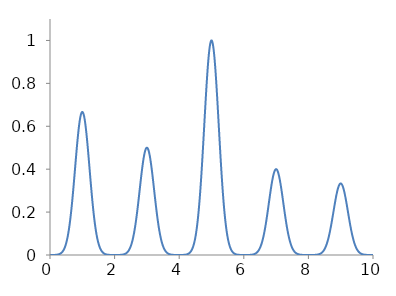
| Category | Series 0 |
|---|---|
| 0.0 | 0 |
| 0.001 | 0 |
| 0.002 | 0 |
| 0.003 | 0 |
| 0.004 | 0 |
| 0.005 | 0 |
| 0.006 | 0 |
| 0.007 | 0 |
| 0.008 | 0 |
| 0.009 | 0 |
| 0.01 | 0 |
| 0.011 | 0 |
| 0.012 | 0 |
| 0.013 | 0 |
| 0.014 | 0 |
| 0.015 | 0 |
| 0.016 | 0 |
| 0.017 | 0 |
| 0.018 | 0 |
| 0.019 | 0 |
| 0.02 | 0 |
| 0.021 | 0 |
| 0.022 | 0 |
| 0.023 | 0 |
| 0.024 | 0 |
| 0.025 | 0 |
| 0.026 | 0 |
| 0.027 | 0 |
| 0.028 | 0 |
| 0.029 | 0 |
| 0.03 | 0 |
| 0.031 | 0 |
| 0.032 | 0 |
| 0.033 | 0 |
| 0.034 | 0 |
| 0.035 | 0 |
| 0.036 | 0 |
| 0.037 | 0 |
| 0.038 | 0 |
| 0.039 | 0 |
| 0.04 | 0 |
| 0.041 | 0 |
| 0.042 | 0 |
| 0.043 | 0 |
| 0.044 | 0 |
| 0.045 | 0 |
| 0.046 | 0 |
| 0.047 | 0 |
| 0.048 | 0 |
| 0.049 | 0 |
| 0.05 | 0 |
| 0.051 | 0 |
| 0.052 | 0 |
| 0.053 | 0 |
| 0.054 | 0 |
| 0.055 | 0 |
| 0.056 | 0 |
| 0.057 | 0 |
| 0.058 | 0 |
| 0.059 | 0 |
| 0.06 | 0 |
| 0.061 | 0 |
| 0.062 | 0 |
| 0.063 | 0 |
| 0.064 | 0 |
| 0.065 | 0 |
| 0.066 | 0 |
| 0.067 | 0 |
| 0.068 | 0 |
| 0.069 | 0 |
| 0.07 | 0 |
| 0.071 | 0 |
| 0.072 | 0 |
| 0.073 | 0 |
| 0.074 | 0 |
| 0.075 | 0 |
| 0.076 | 0 |
| 0.077 | 0 |
| 0.078 | 0 |
| 0.079 | 0 |
| 0.08 | 0 |
| 0.081 | 0 |
| 0.082 | 0 |
| 0.083 | 0 |
| 0.084 | 0 |
| 0.085 | 0 |
| 0.086 | 0 |
| 0.087 | 0 |
| 0.088 | 0 |
| 0.089 | 0 |
| 0.09 | 0 |
| 0.091 | 0 |
| 0.092 | 0 |
| 0.093 | 0 |
| 0.094 | 0 |
| 0.095 | 0 |
| 0.096 | 0 |
| 0.097 | 0 |
| 0.098 | 0 |
| 0.099 | 0 |
| 0.1 | 0 |
| 0.101 | 0 |
| 0.102 | 0 |
| 0.103 | 0 |
| 0.104 | 0 |
| 0.105 | 0 |
| 0.106 | 0 |
| 0.107 | 0 |
| 0.108 | 0 |
| 0.109 | 0 |
| 0.11 | 0 |
| 0.111 | 0 |
| 0.112 | 0 |
| 0.113 | 0 |
| 0.114 | 0 |
| 0.115 | 0 |
| 0.116 | 0 |
| 0.117 | 0 |
| 0.118 | 0 |
| 0.119 | 0 |
| 0.12 | 0 |
| 0.121 | 0 |
| 0.122 | 0 |
| 0.123 | 0 |
| 0.124 | 0 |
| 0.125 | 0 |
| 0.126 | 0 |
| 0.127 | 0 |
| 0.128 | 0 |
| 0.129 | 0 |
| 0.13 | 0 |
| 0.131 | 0 |
| 0.132 | 0 |
| 0.133 | 0 |
| 0.134 | 0 |
| 0.135 | 0 |
| 0.136 | 0 |
| 0.137 | 0 |
| 0.138 | 0 |
| 0.139 | 0 |
| 0.14 | 0 |
| 0.141 | 0 |
| 0.142 | 0 |
| 0.143 | 0 |
| 0.144 | 0 |
| 0.145 | 0 |
| 0.146 | 0 |
| 0.147 | 0 |
| 0.148 | 0 |
| 0.149 | 0 |
| 0.15 | 0 |
| 0.151 | 0 |
| 0.152 | 0.001 |
| 0.153 | 0.001 |
| 0.154 | 0.001 |
| 0.155 | 0.001 |
| 0.156 | 0.001 |
| 0.157 | 0.001 |
| 0.158 | 0.001 |
| 0.159 | 0.001 |
| 0.16 | 0.001 |
| 0.161 | 0.001 |
| 0.162 | 0.001 |
| 0.163 | 0.001 |
| 0.164 | 0.001 |
| 0.165 | 0.001 |
| 0.166 | 0.001 |
| 0.167 | 0.001 |
| 0.168 | 0.001 |
| 0.169 | 0.001 |
| 0.17 | 0.001 |
| 0.171 | 0.001 |
| 0.172 | 0.001 |
| 0.173 | 0.001 |
| 0.174 | 0.001 |
| 0.175 | 0.001 |
| 0.176 | 0.001 |
| 0.177 | 0.001 |
| 0.178 | 0.001 |
| 0.179 | 0.001 |
| 0.18 | 0.001 |
| 0.181 | 0.001 |
| 0.182 | 0.001 |
| 0.183 | 0.001 |
| 0.184 | 0.001 |
| 0.185 | 0.001 |
| 0.186 | 0.001 |
| 0.187 | 0.001 |
| 0.188 | 0.001 |
| 0.189 | 0.001 |
| 0.19 | 0.001 |
| 0.191 | 0.001 |
| 0.192 | 0.001 |
| 0.193 | 0.001 |
| 0.194 | 0.001 |
| 0.195 | 0.001 |
| 0.196 | 0.001 |
| 0.197 | 0.001 |
| 0.198 | 0.001 |
| 0.199 | 0.001 |
| 0.2 | 0.001 |
| 0.201 | 0.001 |
| 0.202 | 0.001 |
| 0.203 | 0.001 |
| 0.204 | 0.001 |
| 0.205 | 0.001 |
| 0.206 | 0.001 |
| 0.207 | 0.001 |
| 0.208 | 0.001 |
| 0.209 | 0.001 |
| 0.21 | 0.001 |
| 0.211 | 0.001 |
| 0.212 | 0.001 |
| 0.213 | 0.001 |
| 0.214 | 0.001 |
| 0.215 | 0.001 |
| 0.216 | 0.001 |
| 0.217 | 0.001 |
| 0.218 | 0.001 |
| 0.219 | 0.001 |
| 0.22 | 0.002 |
| 0.221 | 0.002 |
| 0.222 | 0.002 |
| 0.223 | 0.002 |
| 0.224 | 0.002 |
| 0.225 | 0.002 |
| 0.226 | 0.002 |
| 0.227 | 0.002 |
| 0.228 | 0.002 |
| 0.229 | 0.002 |
| 0.23 | 0.002 |
| 0.231 | 0.002 |
| 0.232 | 0.002 |
| 0.233 | 0.002 |
| 0.234 | 0.002 |
| 0.235 | 0.002 |
| 0.236 | 0.002 |
| 0.237 | 0.002 |
| 0.238 | 0.002 |
| 0.239 | 0.002 |
| 0.24 | 0.002 |
| 0.241 | 0.002 |
| 0.242 | 0.002 |
| 0.243 | 0.002 |
| 0.244 | 0.002 |
| 0.245 | 0.002 |
| 0.246 | 0.002 |
| 0.247 | 0.002 |
| 0.248 | 0.002 |
| 0.249 | 0.002 |
| 0.25 | 0.002 |
| 0.251 | 0.002 |
| 0.252 | 0.002 |
| 0.253 | 0.003 |
| 0.254 | 0.003 |
| 0.255 | 0.003 |
| 0.256 | 0.003 |
| 0.257 | 0.003 |
| 0.258 | 0.003 |
| 0.259 | 0.003 |
| 0.26 | 0.003 |
| 0.261 | 0.003 |
| 0.262 | 0.003 |
| 0.263 | 0.003 |
| 0.264 | 0.003 |
| 0.265 | 0.003 |
| 0.266 | 0.003 |
| 0.267 | 0.003 |
| 0.268 | 0.003 |
| 0.269 | 0.003 |
| 0.27 | 0.003 |
| 0.271 | 0.003 |
| 0.272 | 0.003 |
| 0.273 | 0.003 |
| 0.274 | 0.003 |
| 0.275 | 0.003 |
| 0.276 | 0.004 |
| 0.277 | 0.004 |
| 0.278 | 0.004 |
| 0.279 | 0.004 |
| 0.28 | 0.004 |
| 0.281 | 0.004 |
| 0.282 | 0.004 |
| 0.283 | 0.004 |
| 0.284 | 0.004 |
| 0.285 | 0.004 |
| 0.286 | 0.004 |
| 0.287 | 0.004 |
| 0.288 | 0.004 |
| 0.289 | 0.004 |
| 0.29 | 0.004 |
| 0.291 | 0.004 |
| 0.292 | 0.004 |
| 0.293 | 0.004 |
| 0.294 | 0.005 |
| 0.295 | 0.005 |
| 0.296 | 0.005 |
| 0.297 | 0.005 |
| 0.298 | 0.005 |
| 0.299 | 0.005 |
| 0.3 | 0.005 |
| 0.301 | 0.005 |
| 0.302 | 0.005 |
| 0.303 | 0.005 |
| 0.304 | 0.005 |
| 0.305 | 0.005 |
| 0.306 | 0.005 |
| 0.307 | 0.005 |
| 0.308 | 0.006 |
| 0.309 | 0.006 |
| 0.31 | 0.006 |
| 0.311 | 0.006 |
| 0.312 | 0.006 |
| 0.313 | 0.006 |
| 0.314 | 0.006 |
| 0.315 | 0.006 |
| 0.316 | 0.006 |
| 0.317 | 0.006 |
| 0.318 | 0.006 |
| 0.319 | 0.006 |
| 0.32 | 0.007 |
| 0.321 | 0.007 |
| 0.322 | 0.007 |
| 0.323 | 0.007 |
| 0.324 | 0.007 |
| 0.325 | 0.007 |
| 0.326 | 0.007 |
| 0.327 | 0.007 |
| 0.328 | 0.007 |
| 0.329 | 0.007 |
| 0.33 | 0.007 |
| 0.331 | 0.008 |
| 0.332 | 0.008 |
| 0.333 | 0.008 |
| 0.334 | 0.008 |
| 0.335 | 0.008 |
| 0.336 | 0.008 |
| 0.337 | 0.008 |
| 0.338 | 0.008 |
| 0.339 | 0.008 |
| 0.34 | 0.009 |
| 0.341 | 0.009 |
| 0.342 | 0.009 |
| 0.343 | 0.009 |
| 0.344 | 0.009 |
| 0.345 | 0.009 |
| 0.346 | 0.009 |
| 0.347 | 0.009 |
| 0.348 | 0.009 |
| 0.349 | 0.01 |
| 0.35 | 0.01 |
| 0.351 | 0.01 |
| 0.352 | 0.01 |
| 0.353 | 0.01 |
| 0.354 | 0.01 |
| 0.355 | 0.01 |
| 0.356 | 0.011 |
| 0.357 | 0.011 |
| 0.358 | 0.011 |
| 0.359 | 0.011 |
| 0.36 | 0.011 |
| 0.361 | 0.011 |
| 0.362 | 0.011 |
| 0.363 | 0.012 |
| 0.364 | 0.012 |
| 0.365 | 0.012 |
| 0.366 | 0.012 |
| 0.367 | 0.012 |
| 0.368 | 0.012 |
| 0.369 | 0.012 |
| 0.37 | 0.013 |
| 0.371 | 0.013 |
| 0.372 | 0.013 |
| 0.373 | 0.013 |
| 0.374 | 0.013 |
| 0.375 | 0.013 |
| 0.376 | 0.014 |
| 0.377 | 0.014 |
| 0.378 | 0.014 |
| 0.379 | 0.014 |
| 0.38 | 0.014 |
| 0.381 | 0.014 |
| 0.382 | 0.015 |
| 0.383 | 0.015 |
| 0.384 | 0.015 |
| 0.385 | 0.015 |
| 0.386 | 0.015 |
| 0.387 | 0.016 |
| 0.388 | 0.016 |
| 0.389 | 0.016 |
| 0.39 | 0.016 |
| 0.391 | 0.016 |
| 0.392 | 0.017 |
| 0.393 | 0.017 |
| 0.394 | 0.017 |
| 0.395 | 0.017 |
| 0.396 | 0.017 |
| 0.397 | 0.018 |
| 0.398 | 0.018 |
| 0.399 | 0.018 |
| 0.4 | 0.018 |
| 0.401 | 0.018 |
| 0.402 | 0.019 |
| 0.403 | 0.019 |
| 0.404 | 0.019 |
| 0.405 | 0.019 |
| 0.406 | 0.02 |
| 0.407 | 0.02 |
| 0.408 | 0.02 |
| 0.409 | 0.02 |
| 0.41 | 0.021 |
| 0.411 | 0.021 |
| 0.412 | 0.021 |
| 0.413 | 0.021 |
| 0.414 | 0.022 |
| 0.415 | 0.022 |
| 0.416 | 0.022 |
| 0.417 | 0.022 |
| 0.418 | 0.023 |
| 0.419 | 0.023 |
| 0.42 | 0.023 |
| 0.421 | 0.023 |
| 0.422 | 0.024 |
| 0.423 | 0.024 |
| 0.424 | 0.024 |
| 0.425 | 0.024 |
| 0.426 | 0.025 |
| 0.427 | 0.025 |
| 0.428 | 0.025 |
| 0.429 | 0.026 |
| 0.43 | 0.026 |
| 0.431 | 0.026 |
| 0.432 | 0.026 |
| 0.433 | 0.027 |
| 0.434 | 0.027 |
| 0.435 | 0.027 |
| 0.436 | 0.028 |
| 0.437 | 0.028 |
| 0.438 | 0.028 |
| 0.439 | 0.029 |
| 0.44 | 0.029 |
| 0.441 | 0.029 |
| 0.442 | 0.03 |
| 0.443 | 0.03 |
| 0.444 | 0.03 |
| 0.445 | 0.031 |
| 0.446 | 0.031 |
| 0.447 | 0.031 |
| 0.448 | 0.032 |
| 0.449 | 0.032 |
| 0.45 | 0.032 |
| 0.451 | 0.033 |
| 0.452 | 0.033 |
| 0.453 | 0.033 |
| 0.454 | 0.034 |
| 0.455 | 0.034 |
| 0.456 | 0.035 |
| 0.457 | 0.035 |
| 0.458 | 0.035 |
| 0.459 | 0.036 |
| 0.46 | 0.036 |
| 0.461 | 0.036 |
| 0.462 | 0.037 |
| 0.463 | 0.037 |
| 0.464 | 0.038 |
| 0.465 | 0.038 |
| 0.466 | 0.039 |
| 0.467 | 0.039 |
| 0.468 | 0.039 |
| 0.469 | 0.04 |
| 0.47 | 0.04 |
| 0.471 | 0.041 |
| 0.472 | 0.041 |
| 0.473 | 0.041 |
| 0.474 | 0.042 |
| 0.475 | 0.042 |
| 0.476 | 0.043 |
| 0.477 | 0.043 |
| 0.478 | 0.044 |
| 0.479 | 0.044 |
| 0.48 | 0.045 |
| 0.481 | 0.045 |
| 0.482 | 0.046 |
| 0.483 | 0.046 |
| 0.484 | 0.047 |
| 0.485 | 0.047 |
| 0.486 | 0.047 |
| 0.487 | 0.048 |
| 0.488 | 0.048 |
| 0.489 | 0.049 |
| 0.49 | 0.049 |
| 0.491 | 0.05 |
| 0.492 | 0.05 |
| 0.493 | 0.051 |
| 0.494 | 0.052 |
| 0.495 | 0.052 |
| 0.496 | 0.053 |
| 0.497 | 0.053 |
| 0.498 | 0.054 |
| 0.499 | 0.054 |
| 0.5 | 0.055 |
| 0.501 | 0.055 |
| 0.502 | 0.056 |
| 0.503 | 0.056 |
| 0.504 | 0.057 |
| 0.505 | 0.058 |
| 0.506 | 0.058 |
| 0.507 | 0.059 |
| 0.508 | 0.059 |
| 0.509 | 0.06 |
| 0.51 | 0.06 |
| 0.511 | 0.061 |
| 0.512 | 0.062 |
| 0.513 | 0.062 |
| 0.514 | 0.063 |
| 0.515 | 0.063 |
| 0.516 | 0.064 |
| 0.517 | 0.065 |
| 0.518 | 0.065 |
| 0.519 | 0.066 |
| 0.52 | 0.067 |
| 0.521 | 0.067 |
| 0.522 | 0.068 |
| 0.523 | 0.069 |
| 0.524 | 0.069 |
| 0.525 | 0.07 |
| 0.526 | 0.07 |
| 0.527 | 0.071 |
| 0.528 | 0.072 |
| 0.529 | 0.073 |
| 0.53 | 0.073 |
| 0.531 | 0.074 |
| 0.532 | 0.075 |
| 0.533 | 0.075 |
| 0.534 | 0.076 |
| 0.535 | 0.077 |
| 0.536 | 0.077 |
| 0.537 | 0.078 |
| 0.538 | 0.079 |
| 0.539 | 0.08 |
| 0.54 | 0.08 |
| 0.541 | 0.081 |
| 0.542 | 0.082 |
| 0.543 | 0.083 |
| 0.544 | 0.083 |
| 0.545 | 0.084 |
| 0.546 | 0.085 |
| 0.547 | 0.086 |
| 0.548 | 0.086 |
| 0.549 | 0.087 |
| 0.55 | 0.088 |
| 0.551 | 0.089 |
| 0.552 | 0.09 |
| 0.553 | 0.09 |
| 0.554 | 0.091 |
| 0.555 | 0.092 |
| 0.556 | 0.093 |
| 0.557 | 0.094 |
| 0.558 | 0.095 |
| 0.559 | 0.095 |
| 0.56 | 0.096 |
| 0.561 | 0.097 |
| 0.562 | 0.098 |
| 0.563 | 0.099 |
| 0.564 | 0.1 |
| 0.565 | 0.1 |
| 0.566 | 0.101 |
| 0.567 | 0.102 |
| 0.568 | 0.103 |
| 0.569 | 0.104 |
| 0.57 | 0.105 |
| 0.571 | 0.106 |
| 0.572 | 0.107 |
| 0.573 | 0.108 |
| 0.574 | 0.109 |
| 0.575 | 0.11 |
| 0.576 | 0.11 |
| 0.577 | 0.111 |
| 0.578 | 0.112 |
| 0.579 | 0.113 |
| 0.58 | 0.114 |
| 0.581 | 0.115 |
| 0.582 | 0.116 |
| 0.583 | 0.117 |
| 0.584 | 0.118 |
| 0.585 | 0.119 |
| 0.586 | 0.12 |
| 0.587 | 0.121 |
| 0.588 | 0.122 |
| 0.589 | 0.123 |
| 0.59 | 0.124 |
| 0.591 | 0.125 |
| 0.592 | 0.126 |
| 0.593 | 0.127 |
| 0.594 | 0.128 |
| 0.595 | 0.129 |
| 0.596 | 0.13 |
| 0.597 | 0.131 |
| 0.598 | 0.132 |
| 0.599 | 0.134 |
| 0.6 | 0.135 |
| 0.601 | 0.136 |
| 0.602 | 0.137 |
| 0.603 | 0.138 |
| 0.604 | 0.139 |
| 0.605 | 0.14 |
| 0.606 | 0.141 |
| 0.607 | 0.142 |
| 0.608 | 0.143 |
| 0.609 | 0.145 |
| 0.61 | 0.146 |
| 0.611 | 0.147 |
| 0.612 | 0.148 |
| 0.613 | 0.149 |
| 0.614 | 0.15 |
| 0.615 | 0.151 |
| 0.616 | 0.153 |
| 0.617 | 0.154 |
| 0.618 | 0.155 |
| 0.619 | 0.156 |
| 0.62 | 0.157 |
| 0.621 | 0.159 |
| 0.622 | 0.16 |
| 0.623 | 0.161 |
| 0.624 | 0.162 |
| 0.625 | 0.163 |
| 0.626 | 0.165 |
| 0.627 | 0.166 |
| 0.628 | 0.167 |
| 0.629 | 0.168 |
| 0.63 | 0.17 |
| 0.631 | 0.171 |
| 0.632 | 0.172 |
| 0.633 | 0.173 |
| 0.634 | 0.175 |
| 0.635 | 0.176 |
| 0.636 | 0.177 |
| 0.637 | 0.179 |
| 0.638 | 0.18 |
| 0.639 | 0.181 |
| 0.64 | 0.182 |
| 0.641 | 0.184 |
| 0.642 | 0.185 |
| 0.643 | 0.186 |
| 0.644 | 0.188 |
| 0.645 | 0.189 |
| 0.646 | 0.19 |
| 0.647 | 0.192 |
| 0.648 | 0.193 |
| 0.649 | 0.194 |
| 0.65 | 0.196 |
| 0.651 | 0.197 |
| 0.652 | 0.199 |
| 0.653 | 0.2 |
| 0.654 | 0.201 |
| 0.655 | 0.203 |
| 0.656 | 0.204 |
| 0.657 | 0.206 |
| 0.658 | 0.207 |
| 0.659 | 0.208 |
| 0.66 | 0.21 |
| 0.661 | 0.211 |
| 0.662 | 0.213 |
| 0.663 | 0.214 |
| 0.664 | 0.216 |
| 0.665 | 0.217 |
| 0.666 | 0.218 |
| 0.667 | 0.22 |
| 0.668 | 0.221 |
| 0.669 | 0.223 |
| 0.67 | 0.224 |
| 0.671 | 0.226 |
| 0.672 | 0.227 |
| 0.673 | 0.229 |
| 0.674 | 0.23 |
| 0.675 | 0.232 |
| 0.676 | 0.233 |
| 0.677 | 0.235 |
| 0.678 | 0.236 |
| 0.679 | 0.238 |
| 0.68 | 0.239 |
| 0.681 | 0.241 |
| 0.682 | 0.243 |
| 0.683 | 0.244 |
| 0.684 | 0.246 |
| 0.685 | 0.247 |
| 0.686 | 0.249 |
| 0.687 | 0.25 |
| 0.688 | 0.252 |
| 0.689 | 0.253 |
| 0.69 | 0.255 |
| 0.691 | 0.257 |
| 0.692 | 0.258 |
| 0.693 | 0.26 |
| 0.694 | 0.261 |
| 0.695 | 0.263 |
| 0.696 | 0.265 |
| 0.697 | 0.266 |
| 0.698 | 0.268 |
| 0.699 | 0.269 |
| 0.7 | 0.271 |
| 0.701 | 0.273 |
| 0.702 | 0.274 |
| 0.703 | 0.276 |
| 0.704 | 0.278 |
| 0.705 | 0.279 |
| 0.706 | 0.281 |
| 0.707 | 0.283 |
| 0.708 | 0.284 |
| 0.709 | 0.286 |
| 0.71 | 0.288 |
| 0.711 | 0.289 |
| 0.712 | 0.291 |
| 0.713 | 0.293 |
| 0.714 | 0.294 |
| 0.715 | 0.296 |
| 0.716 | 0.298 |
| 0.717 | 0.299 |
| 0.718 | 0.301 |
| 0.719 | 0.303 |
| 0.72 | 0.304 |
| 0.721 | 0.306 |
| 0.722 | 0.308 |
| 0.723 | 0.31 |
| 0.724 | 0.311 |
| 0.725 | 0.313 |
| 0.726 | 0.315 |
| 0.727 | 0.316 |
| 0.728 | 0.318 |
| 0.729 | 0.32 |
| 0.73 | 0.322 |
| 0.731 | 0.323 |
| 0.732 | 0.325 |
| 0.733 | 0.327 |
| 0.734 | 0.329 |
| 0.735 | 0.33 |
| 0.736 | 0.332 |
| 0.737 | 0.334 |
| 0.738 | 0.336 |
| 0.739 | 0.337 |
| 0.74 | 0.339 |
| 0.741 | 0.341 |
| 0.742 | 0.343 |
| 0.743 | 0.344 |
| 0.744 | 0.346 |
| 0.745 | 0.348 |
| 0.746 | 0.35 |
| 0.747 | 0.351 |
| 0.748 | 0.353 |
| 0.749 | 0.355 |
| 0.75 | 0.357 |
| 0.751 | 0.359 |
| 0.752 | 0.36 |
| 0.753 | 0.362 |
| 0.754 | 0.364 |
| 0.755 | 0.366 |
| 0.756 | 0.368 |
| 0.757 | 0.369 |
| 0.758 | 0.371 |
| 0.759 | 0.373 |
| 0.76 | 0.375 |
| 0.761 | 0.377 |
| 0.762 | 0.378 |
| 0.763 | 0.38 |
| 0.764 | 0.382 |
| 0.765 | 0.384 |
| 0.766 | 0.386 |
| 0.767 | 0.387 |
| 0.768 | 0.389 |
| 0.769 | 0.391 |
| 0.77 | 0.393 |
| 0.771 | 0.395 |
| 0.772 | 0.396 |
| 0.773 | 0.398 |
| 0.774 | 0.4 |
| 0.775 | 0.402 |
| 0.776 | 0.404 |
| 0.777 | 0.405 |
| 0.778 | 0.407 |
| 0.779 | 0.409 |
| 0.78 | 0.411 |
| 0.781 | 0.413 |
| 0.782 | 0.414 |
| 0.783 | 0.416 |
| 0.784 | 0.418 |
| 0.785 | 0.42 |
| 0.786 | 0.422 |
| 0.787 | 0.424 |
| 0.788 | 0.425 |
| 0.789 | 0.427 |
| 0.79 | 0.429 |
| 0.791 | 0.431 |
| 0.792 | 0.433 |
| 0.793 | 0.434 |
| 0.794 | 0.436 |
| 0.795 | 0.438 |
| 0.796 | 0.44 |
| 0.797 | 0.442 |
| 0.798 | 0.443 |
| 0.799 | 0.445 |
| 0.8 | 0.447 |
| 0.801 | 0.449 |
| 0.802 | 0.45 |
| 0.803 | 0.452 |
| 0.804 | 0.454 |
| 0.805 | 0.456 |
| 0.806 | 0.458 |
| 0.807 | 0.459 |
| 0.808 | 0.461 |
| 0.809 | 0.463 |
| 0.81 | 0.465 |
| 0.811 | 0.466 |
| 0.812 | 0.468 |
| 0.813 | 0.47 |
| 0.814 | 0.472 |
| 0.815 | 0.473 |
| 0.816 | 0.475 |
| 0.817 | 0.477 |
| 0.818 | 0.479 |
| 0.819 | 0.48 |
| 0.82 | 0.482 |
| 0.821 | 0.484 |
| 0.822 | 0.486 |
| 0.823 | 0.487 |
| 0.824 | 0.489 |
| 0.825 | 0.491 |
| 0.826 | 0.493 |
| 0.827 | 0.494 |
| 0.828 | 0.496 |
| 0.829 | 0.498 |
| 0.83 | 0.499 |
| 0.831 | 0.501 |
| 0.832 | 0.503 |
| 0.833 | 0.504 |
| 0.834 | 0.506 |
| 0.835 | 0.508 |
| 0.836 | 0.509 |
| 0.837 | 0.511 |
| 0.838 | 0.513 |
| 0.839 | 0.514 |
| 0.84 | 0.516 |
| 0.841 | 0.518 |
| 0.842 | 0.519 |
| 0.843 | 0.521 |
| 0.844 | 0.523 |
| 0.845 | 0.524 |
| 0.846 | 0.526 |
| 0.847 | 0.528 |
| 0.848 | 0.529 |
| 0.849 | 0.531 |
| 0.85 | 0.532 |
| 0.851 | 0.534 |
| 0.852 | 0.536 |
| 0.853 | 0.537 |
| 0.854 | 0.539 |
| 0.855 | 0.54 |
| 0.856 | 0.542 |
| 0.857 | 0.543 |
| 0.858 | 0.545 |
| 0.859 | 0.546 |
| 0.86 | 0.548 |
| 0.861 | 0.55 |
| 0.862 | 0.551 |
| 0.863 | 0.553 |
| 0.864 | 0.554 |
| 0.865 | 0.556 |
| 0.866 | 0.557 |
| 0.867 | 0.559 |
| 0.868 | 0.56 |
| 0.869 | 0.562 |
| 0.87 | 0.563 |
| 0.871 | 0.564 |
| 0.872 | 0.566 |
| 0.873 | 0.567 |
| 0.874 | 0.569 |
| 0.875 | 0.57 |
| 0.876 | 0.572 |
| 0.877 | 0.573 |
| 0.878 | 0.574 |
| 0.879 | 0.576 |
| 0.88 | 0.577 |
| 0.881 | 0.579 |
| 0.882 | 0.58 |
| 0.883 | 0.581 |
| 0.884 | 0.583 |
| 0.885 | 0.584 |
| 0.886 | 0.585 |
| 0.887 | 0.587 |
| 0.888 | 0.588 |
| 0.889 | 0.589 |
| 0.89 | 0.591 |
| 0.891 | 0.592 |
| 0.892 | 0.593 |
| 0.893 | 0.595 |
| 0.894 | 0.596 |
| 0.895 | 0.597 |
| 0.896 | 0.598 |
| 0.897 | 0.6 |
| 0.898 | 0.601 |
| 0.899 | 0.602 |
| 0.9 | 0.603 |
| 0.901 | 0.604 |
| 0.902 | 0.606 |
| 0.903 | 0.607 |
| 0.904 | 0.608 |
| 0.905 | 0.609 |
| 0.906 | 0.61 |
| 0.907 | 0.611 |
| 0.908 | 0.613 |
| 0.909 | 0.614 |
| 0.91 | 0.615 |
| 0.911 | 0.616 |
| 0.912 | 0.617 |
| 0.913 | 0.618 |
| 0.914 | 0.619 |
| 0.915 | 0.62 |
| 0.916 | 0.621 |
| 0.917 | 0.622 |
| 0.918 | 0.623 |
| 0.919 | 0.624 |
| 0.92 | 0.625 |
| 0.921 | 0.626 |
| 0.922 | 0.627 |
| 0.923 | 0.628 |
| 0.924 | 0.629 |
| 0.925 | 0.63 |
| 0.926 | 0.631 |
| 0.927 | 0.632 |
| 0.928 | 0.633 |
| 0.929 | 0.634 |
| 0.93 | 0.635 |
| 0.931 | 0.636 |
| 0.932 | 0.637 |
| 0.933 | 0.637 |
| 0.934 | 0.638 |
| 0.935 | 0.639 |
| 0.936 | 0.64 |
| 0.937 | 0.641 |
| 0.938 | 0.642 |
| 0.939 | 0.642 |
| 0.94 | 0.643 |
| 0.941 | 0.644 |
| 0.942 | 0.645 |
| 0.943 | 0.645 |
| 0.944 | 0.646 |
| 0.945 | 0.647 |
| 0.946 | 0.648 |
| 0.947 | 0.648 |
| 0.948 | 0.649 |
| 0.949 | 0.65 |
| 0.95 | 0.65 |
| 0.951 | 0.651 |
| 0.952 | 0.651 |
| 0.953 | 0.652 |
| 0.954 | 0.653 |
| 0.955 | 0.653 |
| 0.956 | 0.654 |
| 0.957 | 0.654 |
| 0.958 | 0.655 |
| 0.959 | 0.656 |
| 0.96 | 0.656 |
| 0.961 | 0.657 |
| 0.962 | 0.657 |
| 0.963 | 0.658 |
| 0.964 | 0.658 |
| 0.965 | 0.659 |
| 0.966 | 0.659 |
| 0.967 | 0.659 |
| 0.968 | 0.66 |
| 0.969 | 0.66 |
| 0.97 | 0.661 |
| 0.971 | 0.661 |
| 0.972 | 0.661 |
| 0.973 | 0.662 |
| 0.974 | 0.662 |
| 0.975 | 0.663 |
| 0.976 | 0.663 |
| 0.977 | 0.663 |
| 0.978 | 0.663 |
| 0.979 | 0.664 |
| 0.98 | 0.664 |
| 0.981 | 0.664 |
| 0.982 | 0.665 |
| 0.983 | 0.665 |
| 0.984 | 0.665 |
| 0.985 | 0.665 |
| 0.986 | 0.665 |
| 0.987 | 0.666 |
| 0.988 | 0.666 |
| 0.989 | 0.666 |
| 0.99 | 0.666 |
| 0.991 | 0.666 |
| 0.992 | 0.666 |
| 0.993 | 0.666 |
| 0.994 | 0.666 |
| 0.995 | 0.667 |
| 0.996 | 0.667 |
| 0.997 | 0.667 |
| 0.998 | 0.667 |
| 0.999 | 0.667 |
| 1.0 | 0.667 |
| 1.001 | 0.667 |
| 1.002 | 0.667 |
| 1.003 | 0.667 |
| 1.004 | 0.667 |
| 1.005 | 0.667 |
| 1.006 | 0.666 |
| 1.007 | 0.666 |
| 1.008 | 0.666 |
| 1.009 | 0.666 |
| 1.01 | 0.666 |
| 1.011 | 0.666 |
| 1.012 | 0.666 |
| 1.013 | 0.666 |
| 1.014 | 0.665 |
| 1.015 | 0.665 |
| 1.016 | 0.665 |
| 1.017 | 0.665 |
| 1.018 | 0.665 |
| 1.019 | 0.664 |
| 1.02 | 0.664 |
| 1.021 | 0.664 |
| 1.022 | 0.663 |
| 1.023 | 0.663 |
| 1.024 | 0.663 |
| 1.025 | 0.663 |
| 1.026 | 0.662 |
| 1.027 | 0.662 |
| 1.028 | 0.661 |
| 1.029 | 0.661 |
| 1.03 | 0.661 |
| 1.031 | 0.66 |
| 1.032 | 0.66 |
| 1.033 | 0.659 |
| 1.034 | 0.659 |
| 1.035 | 0.659 |
| 1.036 | 0.658 |
| 1.037 | 0.658 |
| 1.038 | 0.657 |
| 1.039 | 0.657 |
| 1.04 | 0.656 |
| 1.041 | 0.656 |
| 1.042 | 0.655 |
| 1.043 | 0.654 |
| 1.044 | 0.654 |
| 1.045 | 0.653 |
| 1.046 | 0.653 |
| 1.047 | 0.652 |
| 1.048 | 0.651 |
| 1.049 | 0.651 |
| 1.05 | 0.65 |
| 1.051 | 0.65 |
| 1.052 | 0.649 |
| 1.053 | 0.648 |
| 1.054 | 0.648 |
| 1.055 | 0.647 |
| 1.056 | 0.646 |
| 1.057 | 0.645 |
| 1.058 | 0.645 |
| 1.059 | 0.644 |
| 1.06 | 0.643 |
| 1.061 | 0.642 |
| 1.062 | 0.642 |
| 1.063 | 0.641 |
| 1.064 | 0.64 |
| 1.065 | 0.639 |
| 1.066 | 0.638 |
| 1.067 | 0.637 |
| 1.068 | 0.637 |
| 1.069 | 0.636 |
| 1.07 | 0.635 |
| 1.071 | 0.634 |
| 1.072 | 0.633 |
| 1.073 | 0.632 |
| 1.074 | 0.631 |
| 1.075 | 0.63 |
| 1.076 | 0.629 |
| 1.077 | 0.628 |
| 1.078 | 0.627 |
| 1.079 | 0.626 |
| 1.08 | 0.625 |
| 1.081 | 0.624 |
| 1.082 | 0.623 |
| 1.083 | 0.622 |
| 1.084 | 0.621 |
| 1.085 | 0.62 |
| 1.086 | 0.619 |
| 1.087 | 0.618 |
| 1.088 | 0.617 |
| 1.089 | 0.616 |
| 1.09 | 0.615 |
| 1.091 | 0.614 |
| 1.092 | 0.613 |
| 1.093 | 0.611 |
| 1.094 | 0.61 |
| 1.095 | 0.609 |
| 1.096 | 0.608 |
| 1.097 | 0.607 |
| 1.098 | 0.606 |
| 1.099 | 0.604 |
| 1.1 | 0.603 |
| 1.101 | 0.602 |
| 1.102 | 0.601 |
| 1.103 | 0.6 |
| 1.104 | 0.598 |
| 1.105 | 0.597 |
| 1.106 | 0.596 |
| 1.107 | 0.595 |
| 1.108 | 0.593 |
| 1.109 | 0.592 |
| 1.11 | 0.591 |
| 1.111 | 0.589 |
| 1.112 | 0.588 |
| 1.113 | 0.587 |
| 1.114 | 0.585 |
| 1.115 | 0.584 |
| 1.116 | 0.583 |
| 1.117 | 0.581 |
| 1.118 | 0.58 |
| 1.119 | 0.579 |
| 1.12 | 0.577 |
| 1.121 | 0.576 |
| 1.122 | 0.574 |
| 1.123 | 0.573 |
| 1.124 | 0.572 |
| 1.125 | 0.57 |
| 1.126 | 0.569 |
| 1.127 | 0.567 |
| 1.128 | 0.566 |
| 1.129 | 0.564 |
| 1.13 | 0.563 |
| 1.131 | 0.562 |
| 1.132 | 0.56 |
| 1.133 | 0.559 |
| 1.134 | 0.557 |
| 1.135 | 0.556 |
| 1.136 | 0.554 |
| 1.137 | 0.553 |
| 1.138 | 0.551 |
| 1.139 | 0.55 |
| 1.14 | 0.548 |
| 1.141 | 0.546 |
| 1.142 | 0.545 |
| 1.143 | 0.543 |
| 1.144 | 0.542 |
| 1.145 | 0.54 |
| 1.146 | 0.539 |
| 1.147 | 0.537 |
| 1.148 | 0.536 |
| 1.149 | 0.534 |
| 1.15 | 0.532 |
| 1.151 | 0.531 |
| 1.152 | 0.529 |
| 1.153 | 0.528 |
| 1.154 | 0.526 |
| 1.155 | 0.524 |
| 1.156 | 0.523 |
| 1.157 | 0.521 |
| 1.158 | 0.519 |
| 1.159 | 0.518 |
| 1.16 | 0.516 |
| 1.161 | 0.514 |
| 1.162 | 0.513 |
| 1.163 | 0.511 |
| 1.164 | 0.509 |
| 1.165 | 0.508 |
| 1.166 | 0.506 |
| 1.167 | 0.504 |
| 1.168 | 0.503 |
| 1.169 | 0.501 |
| 1.17 | 0.499 |
| 1.171 | 0.498 |
| 1.172 | 0.496 |
| 1.173 | 0.494 |
| 1.174 | 0.493 |
| 1.175 | 0.491 |
| 1.176 | 0.489 |
| 1.177 | 0.487 |
| 1.178 | 0.486 |
| 1.179 | 0.484 |
| 1.18 | 0.482 |
| 1.181 | 0.48 |
| 1.182 | 0.479 |
| 1.183 | 0.477 |
| 1.184 | 0.475 |
| 1.185 | 0.473 |
| 1.186 | 0.472 |
| 1.187 | 0.47 |
| 1.188 | 0.468 |
| 1.189 | 0.466 |
| 1.19 | 0.465 |
| 1.191 | 0.463 |
| 1.192 | 0.461 |
| 1.193 | 0.459 |
| 1.194 | 0.458 |
| 1.195 | 0.456 |
| 1.196 | 0.454 |
| 1.197 | 0.452 |
| 1.198 | 0.45 |
| 1.199 | 0.449 |
| 1.2 | 0.447 |
| 1.201 | 0.445 |
| 1.202 | 0.443 |
| 1.203 | 0.442 |
| 1.204 | 0.44 |
| 1.205 | 0.438 |
| 1.206 | 0.436 |
| 1.207 | 0.434 |
| 1.208 | 0.433 |
| 1.209 | 0.431 |
| 1.21 | 0.429 |
| 1.211 | 0.427 |
| 1.212 | 0.425 |
| 1.213 | 0.424 |
| 1.214 | 0.422 |
| 1.215 | 0.42 |
| 1.216 | 0.418 |
| 1.217 | 0.416 |
| 1.218 | 0.414 |
| 1.219 | 0.413 |
| 1.22 | 0.411 |
| 1.221 | 0.409 |
| 1.222 | 0.407 |
| 1.223 | 0.405 |
| 1.224 | 0.404 |
| 1.225 | 0.402 |
| 1.226 | 0.4 |
| 1.227 | 0.398 |
| 1.228 | 0.396 |
| 1.229 | 0.395 |
| 1.23 | 0.393 |
| 1.231 | 0.391 |
| 1.232 | 0.389 |
| 1.233 | 0.387 |
| 1.234 | 0.386 |
| 1.235 | 0.384 |
| 1.236 | 0.382 |
| 1.237 | 0.38 |
| 1.238 | 0.378 |
| 1.239 | 0.377 |
| 1.24 | 0.375 |
| 1.241 | 0.373 |
| 1.242 | 0.371 |
| 1.243 | 0.369 |
| 1.244 | 0.368 |
| 1.245 | 0.366 |
| 1.246 | 0.364 |
| 1.247 | 0.362 |
| 1.248 | 0.36 |
| 1.249 | 0.359 |
| 1.25 | 0.357 |
| 1.251 | 0.355 |
| 1.252 | 0.353 |
| 1.253 | 0.351 |
| 1.254 | 0.35 |
| 1.255 | 0.348 |
| 1.256 | 0.346 |
| 1.257 | 0.344 |
| 1.258 | 0.343 |
| 1.259 | 0.341 |
| 1.26 | 0.339 |
| 1.261 | 0.337 |
| 1.262 | 0.336 |
| 1.263 | 0.334 |
| 1.264 | 0.332 |
| 1.265 | 0.33 |
| 1.266 | 0.329 |
| 1.267 | 0.327 |
| 1.268 | 0.325 |
| 1.269 | 0.323 |
| 1.27 | 0.322 |
| 1.271 | 0.32 |
| 1.272 | 0.318 |
| 1.273 | 0.316 |
| 1.274 | 0.315 |
| 1.275 | 0.313 |
| 1.276 | 0.311 |
| 1.277 | 0.31 |
| 1.278 | 0.308 |
| 1.279 | 0.306 |
| 1.28 | 0.304 |
| 1.281 | 0.303 |
| 1.282 | 0.301 |
| 1.283 | 0.299 |
| 1.284 | 0.298 |
| 1.285 | 0.296 |
| 1.286 | 0.294 |
| 1.287 | 0.293 |
| 1.288 | 0.291 |
| 1.289 | 0.289 |
| 1.29 | 0.288 |
| 1.291 | 0.286 |
| 1.292 | 0.284 |
| 1.293 | 0.283 |
| 1.294 | 0.281 |
| 1.295 | 0.279 |
| 1.296 | 0.278 |
| 1.297 | 0.276 |
| 1.298 | 0.274 |
| 1.299 | 0.273 |
| 1.3 | 0.271 |
| 1.301 | 0.269 |
| 1.302 | 0.268 |
| 1.303 | 0.266 |
| 1.304 | 0.265 |
| 1.305 | 0.263 |
| 1.306 | 0.261 |
| 1.307 | 0.26 |
| 1.308 | 0.258 |
| 1.309 | 0.257 |
| 1.31 | 0.255 |
| 1.311 | 0.253 |
| 1.312 | 0.252 |
| 1.313 | 0.25 |
| 1.314 | 0.249 |
| 1.315 | 0.247 |
| 1.316 | 0.246 |
| 1.317 | 0.244 |
| 1.318 | 0.243 |
| 1.319 | 0.241 |
| 1.32 | 0.239 |
| 1.321 | 0.238 |
| 1.322 | 0.236 |
| 1.323 | 0.235 |
| 1.324 | 0.233 |
| 1.325 | 0.232 |
| 1.326 | 0.23 |
| 1.327 | 0.229 |
| 1.328 | 0.227 |
| 1.329 | 0.226 |
| 1.33 | 0.224 |
| 1.331 | 0.223 |
| 1.332 | 0.221 |
| 1.333 | 0.22 |
| 1.334 | 0.218 |
| 1.335 | 0.217 |
| 1.336 | 0.216 |
| 1.337 | 0.214 |
| 1.338 | 0.213 |
| 1.339 | 0.211 |
| 1.34 | 0.21 |
| 1.341 | 0.208 |
| 1.342 | 0.207 |
| 1.343 | 0.206 |
| 1.344 | 0.204 |
| 1.345 | 0.203 |
| 1.346 | 0.201 |
| 1.347 | 0.2 |
| 1.348 | 0.199 |
| 1.349 | 0.197 |
| 1.35 | 0.196 |
| 1.351 | 0.194 |
| 1.352 | 0.193 |
| 1.353 | 0.192 |
| 1.354 | 0.19 |
| 1.355 | 0.189 |
| 1.356 | 0.188 |
| 1.357 | 0.186 |
| 1.358 | 0.185 |
| 1.359 | 0.184 |
| 1.36 | 0.182 |
| 1.361 | 0.181 |
| 1.362 | 0.18 |
| 1.363 | 0.179 |
| 1.364 | 0.177 |
| 1.365 | 0.176 |
| 1.366 | 0.175 |
| 1.367 | 0.173 |
| 1.368 | 0.172 |
| 1.369 | 0.171 |
| 1.37 | 0.17 |
| 1.371 | 0.168 |
| 1.372 | 0.167 |
| 1.373 | 0.166 |
| 1.374 | 0.165 |
| 1.375 | 0.163 |
| 1.376 | 0.162 |
| 1.377 | 0.161 |
| 1.378 | 0.16 |
| 1.379 | 0.159 |
| 1.38 | 0.157 |
| 1.381 | 0.156 |
| 1.382 | 0.155 |
| 1.383 | 0.154 |
| 1.384 | 0.153 |
| 1.385 | 0.151 |
| 1.386 | 0.15 |
| 1.387 | 0.149 |
| 1.388 | 0.148 |
| 1.389 | 0.147 |
| 1.39 | 0.146 |
| 1.391 | 0.145 |
| 1.392 | 0.143 |
| 1.393 | 0.142 |
| 1.394 | 0.141 |
| 1.395 | 0.14 |
| 1.396 | 0.139 |
| 1.397 | 0.138 |
| 1.398 | 0.137 |
| 1.399 | 0.136 |
| 1.4 | 0.135 |
| 1.401 | 0.134 |
| 1.402 | 0.132 |
| 1.403 | 0.131 |
| 1.404 | 0.13 |
| 1.405 | 0.129 |
| 1.406 | 0.128 |
| 1.407 | 0.127 |
| 1.408 | 0.126 |
| 1.409 | 0.125 |
| 1.41 | 0.124 |
| 1.411 | 0.123 |
| 1.412 | 0.122 |
| 1.413 | 0.121 |
| 1.414 | 0.12 |
| 1.415 | 0.119 |
| 1.416 | 0.118 |
| 1.417 | 0.117 |
| 1.418 | 0.116 |
| 1.419 | 0.115 |
| 1.42 | 0.114 |
| 1.421 | 0.113 |
| 1.422 | 0.112 |
| 1.423 | 0.111 |
| 1.424 | 0.11 |
| 1.425 | 0.11 |
| 1.426 | 0.109 |
| 1.427 | 0.108 |
| 1.428 | 0.107 |
| 1.429 | 0.106 |
| 1.43 | 0.105 |
| 1.431 | 0.104 |
| 1.432 | 0.103 |
| 1.433 | 0.102 |
| 1.434 | 0.101 |
| 1.435 | 0.1 |
| 1.436 | 0.1 |
| 1.437 | 0.099 |
| 1.438 | 0.098 |
| 1.439 | 0.097 |
| 1.44 | 0.096 |
| 1.441 | 0.095 |
| 1.442 | 0.095 |
| 1.443 | 0.094 |
| 1.444 | 0.093 |
| 1.445 | 0.092 |
| 1.446 | 0.091 |
| 1.447 | 0.09 |
| 1.448 | 0.09 |
| 1.449 | 0.089 |
| 1.45 | 0.088 |
| 1.451 | 0.087 |
| 1.452 | 0.086 |
| 1.453 | 0.086 |
| 1.454 | 0.085 |
| 1.455 | 0.084 |
| 1.456 | 0.083 |
| 1.457 | 0.083 |
| 1.458 | 0.082 |
| 1.459 | 0.081 |
| 1.46 | 0.08 |
| 1.461 | 0.08 |
| 1.462 | 0.079 |
| 1.463 | 0.078 |
| 1.464 | 0.077 |
| 1.465 | 0.077 |
| 1.466 | 0.076 |
| 1.467 | 0.075 |
| 1.468 | 0.075 |
| 1.469 | 0.074 |
| 1.47 | 0.073 |
| 1.471 | 0.073 |
| 1.472 | 0.072 |
| 1.473 | 0.071 |
| 1.474 | 0.07 |
| 1.475 | 0.07 |
| 1.476 | 0.069 |
| 1.477 | 0.069 |
| 1.478 | 0.068 |
| 1.479 | 0.067 |
| 1.48 | 0.067 |
| 1.481 | 0.066 |
| 1.482 | 0.065 |
| 1.483 | 0.065 |
| 1.484 | 0.064 |
| 1.485 | 0.063 |
| 1.486 | 0.063 |
| 1.487 | 0.062 |
| 1.488 | 0.062 |
| 1.489 | 0.061 |
| 1.49 | 0.06 |
| 1.491 | 0.06 |
| 1.492 | 0.059 |
| 1.493 | 0.059 |
| 1.494 | 0.058 |
| 1.495 | 0.058 |
| 1.496 | 0.057 |
| 1.497 | 0.056 |
| 1.498 | 0.056 |
| 1.499 | 0.055 |
| 1.5 | 0.055 |
| 1.501 | 0.054 |
| 1.502 | 0.054 |
| 1.503 | 0.053 |
| 1.504 | 0.053 |
| 1.505 | 0.052 |
| 1.506 | 0.052 |
| 1.507 | 0.051 |
| 1.508 | 0.05 |
| 1.509 | 0.05 |
| 1.51 | 0.049 |
| 1.511 | 0.049 |
| 1.512 | 0.048 |
| 1.513 | 0.048 |
| 1.514 | 0.047 |
| 1.515 | 0.047 |
| 1.516 | 0.047 |
| 1.517 | 0.046 |
| 1.518 | 0.046 |
| 1.519 | 0.045 |
| 1.52 | 0.045 |
| 1.521 | 0.044 |
| 1.522 | 0.044 |
| 1.523 | 0.043 |
| 1.524 | 0.043 |
| 1.525 | 0.042 |
| 1.526 | 0.042 |
| 1.527 | 0.041 |
| 1.528 | 0.041 |
| 1.529 | 0.041 |
| 1.53 | 0.04 |
| 1.531 | 0.04 |
| 1.532 | 0.039 |
| 1.533 | 0.039 |
| 1.534 | 0.039 |
| 1.535 | 0.038 |
| 1.536 | 0.038 |
| 1.537 | 0.037 |
| 1.538 | 0.037 |
| 1.539 | 0.036 |
| 1.54 | 0.036 |
| 1.541 | 0.036 |
| 1.542 | 0.035 |
| 1.543 | 0.035 |
| 1.544 | 0.035 |
| 1.545 | 0.034 |
| 1.546 | 0.034 |
| 1.547 | 0.033 |
| 1.548 | 0.033 |
| 1.549 | 0.033 |
| 1.55 | 0.032 |
| 1.551 | 0.032 |
| 1.552 | 0.032 |
| 1.553 | 0.031 |
| 1.554 | 0.031 |
| 1.555 | 0.031 |
| 1.556 | 0.03 |
| 1.557 | 0.03 |
| 1.558 | 0.03 |
| 1.559 | 0.029 |
| 1.56 | 0.029 |
| 1.561 | 0.029 |
| 1.562 | 0.028 |
| 1.563 | 0.028 |
| 1.564 | 0.028 |
| 1.565 | 0.027 |
| 1.566 | 0.027 |
| 1.567 | 0.027 |
| 1.568 | 0.026 |
| 1.569 | 0.026 |
| 1.57 | 0.026 |
| 1.571 | 0.026 |
| 1.572 | 0.025 |
| 1.573 | 0.025 |
| 1.574 | 0.025 |
| 1.575 | 0.024 |
| 1.576 | 0.024 |
| 1.577 | 0.024 |
| 1.578 | 0.024 |
| 1.579 | 0.023 |
| 1.58 | 0.023 |
| 1.581 | 0.023 |
| 1.582 | 0.023 |
| 1.583 | 0.022 |
| 1.584 | 0.022 |
| 1.585 | 0.022 |
| 1.586 | 0.022 |
| 1.587 | 0.021 |
| 1.588 | 0.021 |
| 1.589 | 0.021 |
| 1.59 | 0.021 |
| 1.591 | 0.02 |
| 1.592 | 0.02 |
| 1.593 | 0.02 |
| 1.594 | 0.02 |
| 1.595 | 0.019 |
| 1.596 | 0.019 |
| 1.597 | 0.019 |
| 1.598 | 0.019 |
| 1.599 | 0.018 |
| 1.6 | 0.018 |
| 1.601 | 0.018 |
| 1.602 | 0.018 |
| 1.603 | 0.018 |
| 1.604 | 0.017 |
| 1.605 | 0.017 |
| 1.606 | 0.017 |
| 1.607 | 0.017 |
| 1.608 | 0.017 |
| 1.609 | 0.016 |
| 1.61 | 0.016 |
| 1.611 | 0.016 |
| 1.612 | 0.016 |
| 1.613 | 0.016 |
| 1.614 | 0.015 |
| 1.615 | 0.015 |
| 1.616 | 0.015 |
| 1.617 | 0.015 |
| 1.618 | 0.015 |
| 1.619 | 0.014 |
| 1.62 | 0.014 |
| 1.621 | 0.014 |
| 1.622 | 0.014 |
| 1.623 | 0.014 |
| 1.624 | 0.014 |
| 1.625 | 0.013 |
| 1.626 | 0.013 |
| 1.627 | 0.013 |
| 1.628 | 0.013 |
| 1.629 | 0.013 |
| 1.63 | 0.013 |
| 1.631 | 0.012 |
| 1.632 | 0.012 |
| 1.633 | 0.012 |
| 1.634 | 0.012 |
| 1.635 | 0.012 |
| 1.636 | 0.012 |
| 1.637 | 0.012 |
| 1.638 | 0.011 |
| 1.639 | 0.011 |
| 1.64 | 0.011 |
| 1.641 | 0.011 |
| 1.642 | 0.011 |
| 1.643 | 0.011 |
| 1.644 | 0.011 |
| 1.645 | 0.01 |
| 1.646 | 0.01 |
| 1.647 | 0.01 |
| 1.648 | 0.01 |
| 1.649 | 0.01 |
| 1.65 | 0.01 |
| 1.651 | 0.01 |
| 1.652 | 0.009 |
| 1.653 | 0.009 |
| 1.654 | 0.009 |
| 1.655 | 0.009 |
| 1.656 | 0.009 |
| 1.657 | 0.009 |
| 1.658 | 0.009 |
| 1.659 | 0.009 |
| 1.66 | 0.009 |
| 1.661 | 0.008 |
| 1.662 | 0.008 |
| 1.663 | 0.008 |
| 1.664 | 0.008 |
| 1.665 | 0.008 |
| 1.666 | 0.008 |
| 1.667 | 0.008 |
| 1.668 | 0.008 |
| 1.669 | 0.008 |
| 1.67 | 0.007 |
| 1.671 | 0.007 |
| 1.672 | 0.007 |
| 1.673 | 0.007 |
| 1.674 | 0.007 |
| 1.675 | 0.007 |
| 1.676 | 0.007 |
| 1.677 | 0.007 |
| 1.678 | 0.007 |
| 1.679 | 0.007 |
| 1.68 | 0.007 |
| 1.681 | 0.006 |
| 1.682 | 0.006 |
| 1.683 | 0.006 |
| 1.684 | 0.006 |
| 1.685 | 0.006 |
| 1.686 | 0.006 |
| 1.687 | 0.006 |
| 1.688 | 0.006 |
| 1.689 | 0.006 |
| 1.69 | 0.006 |
| 1.691 | 0.006 |
| 1.692 | 0.006 |
| 1.693 | 0.005 |
| 1.694 | 0.005 |
| 1.695 | 0.005 |
| 1.696 | 0.005 |
| 1.697 | 0.005 |
| 1.698 | 0.005 |
| 1.699 | 0.005 |
| 1.7 | 0.005 |
| 1.701 | 0.005 |
| 1.702 | 0.005 |
| 1.703 | 0.005 |
| 1.704 | 0.005 |
| 1.705 | 0.005 |
| 1.706 | 0.005 |
| 1.707 | 0.004 |
| 1.708 | 0.004 |
| 1.709 | 0.004 |
| 1.71 | 0.004 |
| 1.711 | 0.004 |
| 1.712 | 0.004 |
| 1.713 | 0.004 |
| 1.714 | 0.004 |
| 1.715 | 0.004 |
| 1.716 | 0.004 |
| 1.717 | 0.004 |
| 1.718 | 0.004 |
| 1.719 | 0.004 |
| 1.72 | 0.004 |
| 1.721 | 0.004 |
| 1.722 | 0.004 |
| 1.723 | 0.004 |
| 1.724 | 0.004 |
| 1.725 | 0.003 |
| 1.726 | 0.003 |
| 1.727 | 0.003 |
| 1.728 | 0.003 |
| 1.729 | 0.003 |
| 1.73 | 0.003 |
| 1.731 | 0.003 |
| 1.732 | 0.003 |
| 1.733 | 0.003 |
| 1.734 | 0.003 |
| 1.735 | 0.003 |
| 1.736 | 0.003 |
| 1.737 | 0.003 |
| 1.738 | 0.003 |
| 1.739 | 0.003 |
| 1.74 | 0.003 |
| 1.741 | 0.003 |
| 1.742 | 0.003 |
| 1.743 | 0.003 |
| 1.744 | 0.003 |
| 1.745 | 0.003 |
| 1.746 | 0.003 |
| 1.747 | 0.003 |
| 1.748 | 0.002 |
| 1.749 | 0.002 |
| 1.75 | 0.002 |
| 1.751 | 0.002 |
| 1.752 | 0.002 |
| 1.753 | 0.002 |
| 1.754 | 0.002 |
| 1.755 | 0.002 |
| 1.756 | 0.002 |
| 1.757 | 0.002 |
| 1.758 | 0.002 |
| 1.759 | 0.002 |
| 1.76 | 0.002 |
| 1.761 | 0.002 |
| 1.762 | 0.002 |
| 1.763 | 0.002 |
| 1.764 | 0.002 |
| 1.765 | 0.002 |
| 1.766 | 0.002 |
| 1.767 | 0.002 |
| 1.768 | 0.002 |
| 1.769 | 0.002 |
| 1.77 | 0.002 |
| 1.771 | 0.002 |
| 1.772 | 0.002 |
| 1.773 | 0.002 |
| 1.774 | 0.002 |
| 1.775 | 0.002 |
| 1.776 | 0.002 |
| 1.777 | 0.002 |
| 1.778 | 0.002 |
| 1.779 | 0.002 |
| 1.78 | 0.002 |
| 1.781 | 0.001 |
| 1.782 | 0.001 |
| 1.783 | 0.001 |
| 1.784 | 0.001 |
| 1.785 | 0.001 |
| 1.786 | 0.001 |
| 1.787 | 0.001 |
| 1.788 | 0.001 |
| 1.789 | 0.001 |
| 1.79 | 0.001 |
| 1.791 | 0.001 |
| 1.792 | 0.001 |
| 1.793 | 0.001 |
| 1.794 | 0.001 |
| 1.795 | 0.001 |
| 1.796 | 0.001 |
| 1.797 | 0.001 |
| 1.798 | 0.001 |
| 1.799 | 0.001 |
| 1.8 | 0.001 |
| 1.801 | 0.001 |
| 1.802 | 0.001 |
| 1.803 | 0.001 |
| 1.804 | 0.001 |
| 1.805 | 0.001 |
| 1.806 | 0.001 |
| 1.807 | 0.001 |
| 1.808 | 0.001 |
| 1.809 | 0.001 |
| 1.81 | 0.001 |
| 1.811 | 0.001 |
| 1.812 | 0.001 |
| 1.813 | 0.001 |
| 1.814 | 0.001 |
| 1.815 | 0.001 |
| 1.816 | 0.001 |
| 1.817 | 0.001 |
| 1.818 | 0.001 |
| 1.819 | 0.001 |
| 1.82 | 0.001 |
| 1.821 | 0.001 |
| 1.822 | 0.001 |
| 1.823 | 0.001 |
| 1.824 | 0.001 |
| 1.825 | 0.001 |
| 1.826 | 0.001 |
| 1.827 | 0.001 |
| 1.828 | 0.001 |
| 1.829 | 0.001 |
| 1.83 | 0.001 |
| 1.831 | 0.001 |
| 1.832 | 0.001 |
| 1.833 | 0.001 |
| 1.834 | 0.001 |
| 1.835 | 0.001 |
| 1.836 | 0.001 |
| 1.837 | 0.001 |
| 1.838 | 0.001 |
| 1.839 | 0.001 |
| 1.84 | 0.001 |
| 1.841 | 0.001 |
| 1.842 | 0.001 |
| 1.843 | 0.001 |
| 1.844 | 0.001 |
| 1.845 | 0.001 |
| 1.846 | 0.001 |
| 1.847 | 0.001 |
| 1.848 | 0.001 |
| 1.849 | 0 |
| 1.85 | 0 |
| 1.851 | 0 |
| 1.852 | 0 |
| 1.853 | 0 |
| 1.854 | 0 |
| 1.855 | 0 |
| 1.856 | 0 |
| 1.857 | 0 |
| 1.858 | 0 |
| 1.859 | 0 |
| 1.86 | 0 |
| 1.861 | 0 |
| 1.862 | 0 |
| 1.863 | 0 |
| 1.864 | 0 |
| 1.865 | 0 |
| 1.866 | 0 |
| 1.867 | 0 |
| 1.868 | 0 |
| 1.869 | 0 |
| 1.87 | 0 |
| 1.871 | 0 |
| 1.872 | 0 |
| 1.873 | 0 |
| 1.874 | 0 |
| 1.875 | 0 |
| 1.876 | 0 |
| 1.877 | 0 |
| 1.878 | 0 |
| 1.879 | 0 |
| 1.88 | 0 |
| 1.881 | 0 |
| 1.882 | 0 |
| 1.883 | 0 |
| 1.884 | 0 |
| 1.885 | 0 |
| 1.886 | 0 |
| 1.887 | 0 |
| 1.888 | 0 |
| 1.889 | 0 |
| 1.89 | 0 |
| 1.891 | 0 |
| 1.892 | 0 |
| 1.893 | 0 |
| 1.894 | 0 |
| 1.895 | 0 |
| 1.896 | 0 |
| 1.897 | 0 |
| 1.898 | 0 |
| 1.899 | 0 |
| 1.9 | 0 |
| 1.901 | 0 |
| 1.902 | 0 |
| 1.903 | 0 |
| 1.904 | 0 |
| 1.905 | 0 |
| 1.906 | 0 |
| 1.907 | 0 |
| 1.908 | 0 |
| 1.909 | 0 |
| 1.91 | 0 |
| 1.911 | 0 |
| 1.912 | 0 |
| 1.913 | 0 |
| 1.914 | 0 |
| 1.915 | 0 |
| 1.916 | 0 |
| 1.917 | 0 |
| 1.918 | 0 |
| 1.919 | 0 |
| 1.92 | 0 |
| 1.921 | 0 |
| 1.922 | 0 |
| 1.923 | 0 |
| 1.924 | 0 |
| 1.925 | 0 |
| 1.926 | 0 |
| 1.927 | 0 |
| 1.928 | 0 |
| 1.929 | 0 |
| 1.93 | 0 |
| 1.931 | 0 |
| 1.932 | 0 |
| 1.933 | 0 |
| 1.934 | 0 |
| 1.935 | 0 |
| 1.936 | 0 |
| 1.937 | 0 |
| 1.938 | 0 |
| 1.939 | 0 |
| 1.94 | 0 |
| 1.941 | 0 |
| 1.942 | 0 |
| 1.943 | 0 |
| 1.944 | 0 |
| 1.945 | 0 |
| 1.946 | 0 |
| 1.947 | 0 |
| 1.948 | 0 |
| 1.949 | 0 |
| 1.95 | 0 |
| 1.951 | 0 |
| 1.952 | 0 |
| 1.953 | 0 |
| 1.954 | 0 |
| 1.955 | 0 |
| 1.956 | 0 |
| 1.957 | 0 |
| 1.958 | 0 |
| 1.959 | 0 |
| 1.96 | 0 |
| 1.961 | 0 |
| 1.962 | 0 |
| 1.963 | 0 |
| 1.964 | 0 |
| 1.965 | 0 |
| 1.966 | 0 |
| 1.967 | 0 |
| 1.968 | 0 |
| 1.969 | 0 |
| 1.97 | 0 |
| 1.971 | 0 |
| 1.972 | 0 |
| 1.973 | 0 |
| 1.974 | 0 |
| 1.975 | 0 |
| 1.976 | 0 |
| 1.977 | 0 |
| 1.978 | 0 |
| 1.979 | 0 |
| 1.98 | 0 |
| 1.981 | 0 |
| 1.982 | 0 |
| 1.983 | 0 |
| 1.984 | 0 |
| 1.985 | 0 |
| 1.986 | 0 |
| 1.987 | 0 |
| 1.988 | 0 |
| 1.989 | 0 |
| 1.99 | 0 |
| 1.991 | 0 |
| 1.992 | 0 |
| 1.993 | 0 |
| 1.994 | 0 |
| 1.995 | 0 |
| 1.996 | 0 |
| 1.997 | 0 |
| 1.998 | 0 |
| 1.999 | 0 |
| 2.0 | 0 |
| 2.001 | 0 |
| 2.002 | 0 |
| 2.003 | 0 |
| 2.004 | 0 |
| 2.005 | 0 |
| 2.006 | 0 |
| 2.007 | 0 |
| 2.008 | 0 |
| 2.009 | 0 |
| 2.01 | 0 |
| 2.011 | 0 |
| 2.012 | 0 |
| 2.013 | 0 |
| 2.014 | 0 |
| 2.015 | 0 |
| 2.016 | 0 |
| 2.017 | 0 |
| 2.018 | 0 |
| 2.019 | 0 |
| 2.02 | 0 |
| 2.021 | 0 |
| 2.022 | 0 |
| 2.023 | 0 |
| 2.024 | 0 |
| 2.025 | 0 |
| 2.026 | 0 |
| 2.027 | 0 |
| 2.028 | 0 |
| 2.029 | 0 |
| 2.03 | 0 |
| 2.031 | 0 |
| 2.032 | 0 |
| 2.033 | 0 |
| 2.034 | 0 |
| 2.035 | 0 |
| 2.036 | 0 |
| 2.037 | 0 |
| 2.038 | 0 |
| 2.039 | 0 |
| 2.04 | 0 |
| 2.041 | 0 |
| 2.042 | 0 |
| 2.043 | 0 |
| 2.044 | 0 |
| 2.045 | 0 |
| 2.046 | 0 |
| 2.047 | 0 |
| 2.048 | 0 |
| 2.049 | 0 |
| 2.05 | 0 |
| 2.051 | 0 |
| 2.052 | 0 |
| 2.053 | 0 |
| 2.054 | 0 |
| 2.055 | 0 |
| 2.056 | 0 |
| 2.057 | 0 |
| 2.058 | 0 |
| 2.059 | 0 |
| 2.06 | 0 |
| 2.061 | 0 |
| 2.062 | 0 |
| 2.063 | 0 |
| 2.064 | 0 |
| 2.065 | 0 |
| 2.066 | 0 |
| 2.067 | 0 |
| 2.068 | 0 |
| 2.069 | 0 |
| 2.07 | 0 |
| 2.071 | 0 |
| 2.072 | 0 |
| 2.073 | 0 |
| 2.074 | 0 |
| 2.075 | 0 |
| 2.076 | 0 |
| 2.077 | 0 |
| 2.078 | 0 |
| 2.079 | 0 |
| 2.08 | 0 |
| 2.081 | 0 |
| 2.082 | 0 |
| 2.083 | 0 |
| 2.084 | 0 |
| 2.085 | 0 |
| 2.086 | 0 |
| 2.087 | 0 |
| 2.088 | 0 |
| 2.089 | 0 |
| 2.09 | 0 |
| 2.091 | 0 |
| 2.092 | 0 |
| 2.093 | 0 |
| 2.094 | 0 |
| 2.095 | 0 |
| 2.096 | 0 |
| 2.097 | 0 |
| 2.098 | 0 |
| 2.099 | 0 |
| 2.1 | 0 |
| 2.101 | 0 |
| 2.102 | 0 |
| 2.103 | 0 |
| 2.104 | 0 |
| 2.105 | 0 |
| 2.106 | 0 |
| 2.107 | 0 |
| 2.108 | 0 |
| 2.109 | 0 |
| 2.11 | 0 |
| 2.111 | 0 |
| 2.112 | 0 |
| 2.113 | 0 |
| 2.114 | 0 |
| 2.115 | 0 |
| 2.116 | 0 |
| 2.117 | 0 |
| 2.118 | 0 |
| 2.119 | 0 |
| 2.12 | 0 |
| 2.121 | 0 |
| 2.122 | 0 |
| 2.123 | 0 |
| 2.124 | 0 |
| 2.125 | 0 |
| 2.126 | 0 |
| 2.127 | 0 |
| 2.128 | 0 |
| 2.129 | 0 |
| 2.13 | 0 |
| 2.131 | 0 |
| 2.132 | 0 |
| 2.133 | 0 |
| 2.134 | 0 |
| 2.135 | 0 |
| 2.136 | 0 |
| 2.137 | 0 |
| 2.138 | 0 |
| 2.139 | 0 |
| 2.14 | 0 |
| 2.141 | 0 |
| 2.142 | 0 |
| 2.143 | 0 |
| 2.144 | 0 |
| 2.145 | 0 |
| 2.146 | 0 |
| 2.147 | 0 |
| 2.148 | 0 |
| 2.149 | 0 |
| 2.15 | 0 |
| 2.151 | 0 |
| 2.152 | 0 |
| 2.153 | 0 |
| 2.154 | 0 |
| 2.155 | 0 |
| 2.156 | 0 |
| 2.157 | 0 |
| 2.158 | 0 |
| 2.159 | 0 |
| 2.16 | 0 |
| 2.161 | 0 |
| 2.162 | 0 |
| 2.163 | 0 |
| 2.164 | 0 |
| 2.165 | 0 |
| 2.166 | 0 |
| 2.167 | 0 |
| 2.168 | 0 |
| 2.169 | 0.001 |
| 2.17 | 0.001 |
| 2.171 | 0.001 |
| 2.172 | 0.001 |
| 2.173 | 0.001 |
| 2.174 | 0.001 |
| 2.175 | 0.001 |
| 2.176 | 0.001 |
| 2.177 | 0.001 |
| 2.178 | 0.001 |
| 2.179 | 0.001 |
| 2.18 | 0.001 |
| 2.181 | 0.001 |
| 2.182 | 0.001 |
| 2.183 | 0.001 |
| 2.184 | 0.001 |
| 2.185 | 0.001 |
| 2.186 | 0.001 |
| 2.187 | 0.001 |
| 2.188 | 0.001 |
| 2.189 | 0.001 |
| 2.19 | 0.001 |
| 2.191 | 0.001 |
| 2.192 | 0.001 |
| 2.193 | 0.001 |
| 2.194 | 0.001 |
| 2.195 | 0.001 |
| 2.196 | 0.001 |
| 2.197 | 0.001 |
| 2.198 | 0.001 |
| 2.199 | 0.001 |
| 2.2 | 0.001 |
| 2.201 | 0.001 |
| 2.202 | 0.001 |
| 2.203 | 0.001 |
| 2.204 | 0.001 |
| 2.205 | 0.001 |
| 2.206 | 0.001 |
| 2.207 | 0.001 |
| 2.208 | 0.001 |
| 2.209 | 0.001 |
| 2.21 | 0.001 |
| 2.211 | 0.001 |
| 2.212 | 0.001 |
| 2.213 | 0.001 |
| 2.214 | 0.001 |
| 2.215 | 0.001 |
| 2.216 | 0.001 |
| 2.217 | 0.001 |
| 2.218 | 0.001 |
| 2.219 | 0.001 |
| 2.22 | 0.001 |
| 2.221 | 0.001 |
| 2.222 | 0.001 |
| 2.223 | 0.001 |
| 2.224 | 0.001 |
| 2.225 | 0.001 |
| 2.226 | 0.001 |
| 2.227 | 0.001 |
| 2.228 | 0.001 |
| 2.229 | 0.001 |
| 2.23 | 0.001 |
| 2.231 | 0.001 |
| 2.232 | 0.001 |
| 2.233 | 0.001 |
| 2.234 | 0.001 |
| 2.235 | 0.001 |
| 2.236 | 0.001 |
| 2.237 | 0.001 |
| 2.238 | 0.002 |
| 2.239 | 0.002 |
| 2.24 | 0.002 |
| 2.241 | 0.002 |
| 2.242 | 0.002 |
| 2.243 | 0.002 |
| 2.244 | 0.002 |
| 2.245 | 0.002 |
| 2.246 | 0.002 |
| 2.247 | 0.002 |
| 2.248 | 0.002 |
| 2.249 | 0.002 |
| 2.25 | 0.002 |
| 2.251 | 0.002 |
| 2.252 | 0.002 |
| 2.253 | 0.002 |
| 2.254 | 0.002 |
| 2.255 | 0.002 |
| 2.256 | 0.002 |
| 2.257 | 0.002 |
| 2.258 | 0.002 |
| 2.259 | 0.002 |
| 2.26 | 0.002 |
| 2.261 | 0.002 |
| 2.262 | 0.002 |
| 2.263 | 0.002 |
| 2.264 | 0.002 |
| 2.265 | 0.002 |
| 2.266 | 0.002 |
| 2.267 | 0.002 |
| 2.268 | 0.002 |
| 2.269 | 0.002 |
| 2.27 | 0.002 |
| 2.271 | 0.002 |
| 2.272 | 0.002 |
| 2.273 | 0.003 |
| 2.274 | 0.003 |
| 2.275 | 0.003 |
| 2.276 | 0.003 |
| 2.277 | 0.003 |
| 2.278 | 0.003 |
| 2.279 | 0.003 |
| 2.28 | 0.003 |
| 2.281 | 0.003 |
| 2.282 | 0.003 |
| 2.283 | 0.003 |
| 2.284 | 0.003 |
| 2.285 | 0.003 |
| 2.286 | 0.003 |
| 2.287 | 0.003 |
| 2.288 | 0.003 |
| 2.289 | 0.003 |
| 2.29 | 0.003 |
| 2.291 | 0.003 |
| 2.292 | 0.003 |
| 2.293 | 0.003 |
| 2.294 | 0.003 |
| 2.295 | 0.003 |
| 2.296 | 0.004 |
| 2.297 | 0.004 |
| 2.298 | 0.004 |
| 2.299 | 0.004 |
| 2.3 | 0.004 |
| 2.301 | 0.004 |
| 2.302 | 0.004 |
| 2.303 | 0.004 |
| 2.304 | 0.004 |
| 2.305 | 0.004 |
| 2.306 | 0.004 |
| 2.307 | 0.004 |
| 2.308 | 0.004 |
| 2.309 | 0.004 |
| 2.31 | 0.004 |
| 2.311 | 0.004 |
| 2.312 | 0.004 |
| 2.313 | 0.004 |
| 2.314 | 0.005 |
| 2.315 | 0.005 |
| 2.316 | 0.005 |
| 2.317 | 0.005 |
| 2.318 | 0.005 |
| 2.319 | 0.005 |
| 2.32 | 0.005 |
| 2.321 | 0.005 |
| 2.322 | 0.005 |
| 2.323 | 0.005 |
| 2.324 | 0.005 |
| 2.325 | 0.005 |
| 2.326 | 0.005 |
| 2.327 | 0.005 |
| 2.328 | 0.005 |
| 2.329 | 0.006 |
| 2.33 | 0.006 |
| 2.331 | 0.006 |
| 2.332 | 0.006 |
| 2.333 | 0.006 |
| 2.334 | 0.006 |
| 2.335 | 0.006 |
| 2.336 | 0.006 |
| 2.337 | 0.006 |
| 2.338 | 0.006 |
| 2.339 | 0.006 |
| 2.34 | 0.006 |
| 2.341 | 0.006 |
| 2.342 | 0.007 |
| 2.343 | 0.007 |
| 2.344 | 0.007 |
| 2.345 | 0.007 |
| 2.346 | 0.007 |
| 2.347 | 0.007 |
| 2.348 | 0.007 |
| 2.349 | 0.007 |
| 2.35 | 0.007 |
| 2.351 | 0.007 |
| 2.352 | 0.008 |
| 2.353 | 0.008 |
| 2.354 | 0.008 |
| 2.355 | 0.008 |
| 2.356 | 0.008 |
| 2.357 | 0.008 |
| 2.358 | 0.008 |
| 2.359 | 0.008 |
| 2.36 | 0.008 |
| 2.361 | 0.008 |
| 2.362 | 0.009 |
| 2.363 | 0.009 |
| 2.364 | 0.009 |
| 2.365 | 0.009 |
| 2.366 | 0.009 |
| 2.367 | 0.009 |
| 2.368 | 0.009 |
| 2.369 | 0.009 |
| 2.37 | 0.009 |
| 2.371 | 0.01 |
| 2.372 | 0.01 |
| 2.373 | 0.01 |
| 2.374 | 0.01 |
| 2.375 | 0.01 |
| 2.376 | 0.01 |
| 2.377 | 0.01 |
| 2.378 | 0.01 |
| 2.379 | 0.011 |
| 2.38 | 0.011 |
| 2.381 | 0.011 |
| 2.382 | 0.011 |
| 2.383 | 0.011 |
| 2.384 | 0.011 |
| 2.385 | 0.011 |
| 2.386 | 0.012 |
| 2.387 | 0.012 |
| 2.388 | 0.012 |
| 2.389 | 0.012 |
| 2.39 | 0.012 |
| 2.391 | 0.012 |
| 2.392 | 0.012 |
| 2.393 | 0.013 |
| 2.394 | 0.013 |
| 2.395 | 0.013 |
| 2.396 | 0.013 |
| 2.397 | 0.013 |
| 2.398 | 0.013 |
| 2.399 | 0.013 |
| 2.4 | 0.014 |
| 2.401 | 0.014 |
| 2.402 | 0.014 |
| 2.403 | 0.014 |
| 2.404 | 0.014 |
| 2.405 | 0.015 |
| 2.406 | 0.015 |
| 2.407 | 0.015 |
| 2.408 | 0.015 |
| 2.409 | 0.015 |
| 2.41 | 0.015 |
| 2.411 | 0.016 |
| 2.412 | 0.016 |
| 2.413 | 0.016 |
| 2.414 | 0.016 |
| 2.415 | 0.016 |
| 2.416 | 0.017 |
| 2.417 | 0.017 |
| 2.418 | 0.017 |
| 2.419 | 0.017 |
| 2.42 | 0.017 |
| 2.421 | 0.017 |
| 2.422 | 0.018 |
| 2.423 | 0.018 |
| 2.424 | 0.018 |
| 2.425 | 0.018 |
| 2.426 | 0.019 |
| 2.427 | 0.019 |
| 2.428 | 0.019 |
| 2.429 | 0.019 |
| 2.43 | 0.019 |
| 2.431 | 0.02 |
| 2.432 | 0.02 |
| 2.433 | 0.02 |
| 2.434 | 0.02 |
| 2.435 | 0.021 |
| 2.436 | 0.021 |
| 2.437 | 0.021 |
| 2.438 | 0.021 |
| 2.439 | 0.021 |
| 2.44 | 0.022 |
| 2.441 | 0.022 |
| 2.442 | 0.022 |
| 2.443 | 0.022 |
| 2.444 | 0.023 |
| 2.445 | 0.023 |
| 2.446 | 0.023 |
| 2.447 | 0.023 |
| 2.448 | 0.024 |
| 2.449 | 0.024 |
| 2.45 | 0.024 |
| 2.451 | 0.025 |
| 2.452 | 0.025 |
| 2.453 | 0.025 |
| 2.454 | 0.025 |
| 2.455 | 0.026 |
| 2.456 | 0.026 |
| 2.457 | 0.026 |
| 2.458 | 0.026 |
| 2.459 | 0.027 |
| 2.46 | 0.027 |
| 2.461 | 0.027 |
| 2.462 | 0.028 |
| 2.463 | 0.028 |
| 2.464 | 0.028 |
| 2.465 | 0.029 |
| 2.466 | 0.029 |
| 2.467 | 0.029 |
| 2.468 | 0.029 |
| 2.469 | 0.03 |
| 2.47 | 0.03 |
| 2.471 | 0.03 |
| 2.472 | 0.031 |
| 2.473 | 0.031 |
| 2.474 | 0.031 |
| 2.475 | 0.032 |
| 2.476 | 0.032 |
| 2.477 | 0.032 |
| 2.478 | 0.033 |
| 2.479 | 0.033 |
| 2.48 | 0.033 |
| 2.481 | 0.034 |
| 2.482 | 0.034 |
| 2.483 | 0.035 |
| 2.484 | 0.035 |
| 2.485 | 0.035 |
| 2.486 | 0.036 |
| 2.487 | 0.036 |
| 2.488 | 0.036 |
| 2.489 | 0.037 |
| 2.49 | 0.037 |
| 2.491 | 0.037 |
| 2.492 | 0.038 |
| 2.493 | 0.038 |
| 2.494 | 0.039 |
| 2.495 | 0.039 |
| 2.496 | 0.039 |
| 2.497 | 0.04 |
| 2.498 | 0.04 |
| 2.499 | 0.041 |
| 2.5 | 0.041 |
| 2.501 | 0.041 |
| 2.502 | 0.042 |
| 2.503 | 0.042 |
| 2.504 | 0.043 |
| 2.505 | 0.043 |
| 2.506 | 0.044 |
| 2.507 | 0.044 |
| 2.508 | 0.044 |
| 2.509 | 0.045 |
| 2.51 | 0.045 |
| 2.511 | 0.046 |
| 2.512 | 0.046 |
| 2.513 | 0.047 |
| 2.514 | 0.047 |
| 2.515 | 0.048 |
| 2.516 | 0.048 |
| 2.517 | 0.049 |
| 2.518 | 0.049 |
| 2.519 | 0.049 |
| 2.52 | 0.05 |
| 2.521 | 0.05 |
| 2.522 | 0.051 |
| 2.523 | 0.051 |
| 2.524 | 0.052 |
| 2.525 | 0.052 |
| 2.526 | 0.053 |
| 2.527 | 0.053 |
| 2.528 | 0.054 |
| 2.529 | 0.054 |
| 2.53 | 0.055 |
| 2.531 | 0.055 |
| 2.532 | 0.056 |
| 2.533 | 0.056 |
| 2.534 | 0.057 |
| 2.535 | 0.058 |
| 2.536 | 0.058 |
| 2.537 | 0.059 |
| 2.538 | 0.059 |
| 2.539 | 0.06 |
| 2.54 | 0.06 |
| 2.541 | 0.061 |
| 2.542 | 0.061 |
| 2.543 | 0.062 |
| 2.544 | 0.063 |
| 2.545 | 0.063 |
| 2.546 | 0.064 |
| 2.547 | 0.064 |
| 2.548 | 0.065 |
| 2.549 | 0.065 |
| 2.55 | 0.066 |
| 2.551 | 0.067 |
| 2.552 | 0.067 |
| 2.553 | 0.068 |
| 2.554 | 0.068 |
| 2.555 | 0.069 |
| 2.556 | 0.07 |
| 2.557 | 0.07 |
| 2.558 | 0.071 |
| 2.559 | 0.072 |
| 2.56 | 0.072 |
| 2.561 | 0.073 |
| 2.562 | 0.073 |
| 2.563 | 0.074 |
| 2.564 | 0.075 |
| 2.565 | 0.075 |
| 2.566 | 0.076 |
| 2.567 | 0.077 |
| 2.568 | 0.077 |
| 2.569 | 0.078 |
| 2.57 | 0.079 |
| 2.571 | 0.079 |
| 2.572 | 0.08 |
| 2.573 | 0.081 |
| 2.574 | 0.081 |
| 2.575 | 0.082 |
| 2.576 | 0.083 |
| 2.577 | 0.084 |
| 2.578 | 0.084 |
| 2.579 | 0.085 |
| 2.58 | 0.086 |
| 2.581 | 0.086 |
| 2.582 | 0.087 |
| 2.583 | 0.088 |
| 2.584 | 0.089 |
| 2.585 | 0.089 |
| 2.586 | 0.09 |
| 2.587 | 0.091 |
| 2.588 | 0.092 |
| 2.589 | 0.092 |
| 2.59 | 0.093 |
| 2.591 | 0.094 |
| 2.592 | 0.095 |
| 2.593 | 0.095 |
| 2.594 | 0.096 |
| 2.595 | 0.097 |
| 2.596 | 0.098 |
| 2.597 | 0.099 |
| 2.598 | 0.099 |
| 2.599 | 0.1 |
| 2.6 | 0.101 |
| 2.601 | 0.102 |
| 2.602 | 0.103 |
| 2.603 | 0.103 |
| 2.604 | 0.104 |
| 2.605 | 0.105 |
| 2.606 | 0.106 |
| 2.607 | 0.107 |
| 2.608 | 0.108 |
| 2.609 | 0.108 |
| 2.61 | 0.109 |
| 2.611 | 0.11 |
| 2.612 | 0.111 |
| 2.613 | 0.112 |
| 2.614 | 0.113 |
| 2.615 | 0.114 |
| 2.616 | 0.114 |
| 2.617 | 0.115 |
| 2.618 | 0.116 |
| 2.619 | 0.117 |
| 2.62 | 0.118 |
| 2.621 | 0.119 |
| 2.622 | 0.12 |
| 2.623 | 0.121 |
| 2.624 | 0.122 |
| 2.625 | 0.123 |
| 2.626 | 0.123 |
| 2.627 | 0.124 |
| 2.628 | 0.125 |
| 2.629 | 0.126 |
| 2.63 | 0.127 |
| 2.631 | 0.128 |
| 2.632 | 0.129 |
| 2.633 | 0.13 |
| 2.634 | 0.131 |
| 2.635 | 0.132 |
| 2.636 | 0.133 |
| 2.637 | 0.134 |
| 2.638 | 0.135 |
| 2.639 | 0.136 |
| 2.64 | 0.137 |
| 2.641 | 0.138 |
| 2.642 | 0.139 |
| 2.643 | 0.14 |
| 2.644 | 0.141 |
| 2.645 | 0.142 |
| 2.646 | 0.143 |
| 2.647 | 0.144 |
| 2.648 | 0.145 |
| 2.649 | 0.146 |
| 2.65 | 0.147 |
| 2.651 | 0.148 |
| 2.652 | 0.149 |
| 2.653 | 0.15 |
| 2.654 | 0.151 |
| 2.655 | 0.152 |
| 2.656 | 0.153 |
| 2.657 | 0.154 |
| 2.658 | 0.155 |
| 2.659 | 0.156 |
| 2.66 | 0.157 |
| 2.661 | 0.158 |
| 2.662 | 0.16 |
| 2.663 | 0.161 |
| 2.664 | 0.162 |
| 2.665 | 0.163 |
| 2.666 | 0.164 |
| 2.667 | 0.165 |
| 2.668 | 0.166 |
| 2.669 | 0.167 |
| 2.67 | 0.168 |
| 2.671 | 0.169 |
| 2.672 | 0.171 |
| 2.673 | 0.172 |
| 2.674 | 0.173 |
| 2.675 | 0.174 |
| 2.676 | 0.175 |
| 2.677 | 0.176 |
| 2.678 | 0.177 |
| 2.679 | 0.178 |
| 2.68 | 0.18 |
| 2.681 | 0.181 |
| 2.682 | 0.182 |
| 2.683 | 0.183 |
| 2.684 | 0.184 |
| 2.685 | 0.185 |
| 2.686 | 0.187 |
| 2.687 | 0.188 |
| 2.688 | 0.189 |
| 2.689 | 0.19 |
| 2.69 | 0.191 |
| 2.691 | 0.192 |
| 2.692 | 0.194 |
| 2.693 | 0.195 |
| 2.694 | 0.196 |
| 2.695 | 0.197 |
| 2.696 | 0.198 |
| 2.697 | 0.2 |
| 2.698 | 0.201 |
| 2.699 | 0.202 |
| 2.7 | 0.203 |
| 2.701 | 0.205 |
| 2.702 | 0.206 |
| 2.703 | 0.207 |
| 2.704 | 0.208 |
| 2.705 | 0.209 |
| 2.706 | 0.211 |
| 2.707 | 0.212 |
| 2.708 | 0.213 |
| 2.709 | 0.214 |
| 2.71 | 0.216 |
| 2.711 | 0.217 |
| 2.712 | 0.218 |
| 2.713 | 0.219 |
| 2.714 | 0.221 |
| 2.715 | 0.222 |
| 2.716 | 0.223 |
| 2.717 | 0.224 |
| 2.718 | 0.226 |
| 2.719 | 0.227 |
| 2.72 | 0.228 |
| 2.721 | 0.23 |
| 2.722 | 0.231 |
| 2.723 | 0.232 |
| 2.724 | 0.233 |
| 2.725 | 0.235 |
| 2.726 | 0.236 |
| 2.727 | 0.237 |
| 2.728 | 0.239 |
| 2.729 | 0.24 |
| 2.73 | 0.241 |
| 2.731 | 0.242 |
| 2.732 | 0.244 |
| 2.733 | 0.245 |
| 2.734 | 0.246 |
| 2.735 | 0.248 |
| 2.736 | 0.249 |
| 2.737 | 0.25 |
| 2.738 | 0.252 |
| 2.739 | 0.253 |
| 2.74 | 0.254 |
| 2.741 | 0.256 |
| 2.742 | 0.257 |
| 2.743 | 0.258 |
| 2.744 | 0.26 |
| 2.745 | 0.261 |
| 2.746 | 0.262 |
| 2.747 | 0.264 |
| 2.748 | 0.265 |
| 2.749 | 0.266 |
| 2.75 | 0.268 |
| 2.751 | 0.269 |
| 2.752 | 0.27 |
| 2.753 | 0.272 |
| 2.754 | 0.273 |
| 2.755 | 0.274 |
| 2.756 | 0.276 |
| 2.757 | 0.277 |
| 2.758 | 0.278 |
| 2.759 | 0.28 |
| 2.76 | 0.281 |
| 2.761 | 0.282 |
| 2.762 | 0.284 |
| 2.763 | 0.285 |
| 2.764 | 0.286 |
| 2.765 | 0.288 |
| 2.766 | 0.289 |
| 2.767 | 0.291 |
| 2.768 | 0.292 |
| 2.769 | 0.293 |
| 2.77 | 0.295 |
| 2.771 | 0.296 |
| 2.772 | 0.297 |
| 2.773 | 0.299 |
| 2.774 | 0.3 |
| 2.775 | 0.301 |
| 2.776 | 0.303 |
| 2.777 | 0.304 |
| 2.778 | 0.305 |
| 2.779 | 0.307 |
| 2.78 | 0.308 |
| 2.781 | 0.31 |
| 2.782 | 0.311 |
| 2.783 | 0.312 |
| 2.784 | 0.314 |
| 2.785 | 0.315 |
| 2.786 | 0.316 |
| 2.787 | 0.318 |
| 2.788 | 0.319 |
| 2.789 | 0.32 |
| 2.79 | 0.322 |
| 2.791 | 0.323 |
| 2.792 | 0.324 |
| 2.793 | 0.326 |
| 2.794 | 0.327 |
| 2.795 | 0.328 |
| 2.796 | 0.33 |
| 2.797 | 0.331 |
| 2.798 | 0.332 |
| 2.799 | 0.334 |
| 2.8 | 0.335 |
| 2.801 | 0.336 |
| 2.802 | 0.338 |
| 2.803 | 0.339 |
| 2.804 | 0.341 |
| 2.805 | 0.342 |
| 2.806 | 0.343 |
| 2.807 | 0.345 |
| 2.808 | 0.346 |
| 2.809 | 0.347 |
| 2.81 | 0.348 |
| 2.811 | 0.35 |
| 2.812 | 0.351 |
| 2.813 | 0.352 |
| 2.814 | 0.354 |
| 2.815 | 0.355 |
| 2.816 | 0.356 |
| 2.817 | 0.358 |
| 2.818 | 0.359 |
| 2.819 | 0.36 |
| 2.82 | 0.362 |
| 2.821 | 0.363 |
| 2.822 | 0.364 |
| 2.823 | 0.366 |
| 2.824 | 0.367 |
| 2.825 | 0.368 |
| 2.826 | 0.369 |
| 2.827 | 0.371 |
| 2.828 | 0.372 |
| 2.829 | 0.373 |
| 2.83 | 0.375 |
| 2.831 | 0.376 |
| 2.832 | 0.377 |
| 2.833 | 0.378 |
| 2.834 | 0.38 |
| 2.835 | 0.381 |
| 2.836 | 0.382 |
| 2.837 | 0.383 |
| 2.838 | 0.385 |
| 2.839 | 0.386 |
| 2.84 | 0.387 |
| 2.841 | 0.388 |
| 2.842 | 0.39 |
| 2.843 | 0.391 |
| 2.844 | 0.392 |
| 2.845 | 0.393 |
| 2.846 | 0.394 |
| 2.847 | 0.396 |
| 2.848 | 0.397 |
| 2.849 | 0.398 |
| 2.85 | 0.399 |
| 2.851 | 0.4 |
| 2.852 | 0.402 |
| 2.853 | 0.403 |
| 2.854 | 0.404 |
| 2.855 | 0.405 |
| 2.856 | 0.406 |
| 2.857 | 0.408 |
| 2.858 | 0.409 |
| 2.859 | 0.41 |
| 2.86 | 0.411 |
| 2.861 | 0.412 |
| 2.862 | 0.413 |
| 2.863 | 0.414 |
| 2.864 | 0.416 |
| 2.865 | 0.417 |
| 2.866 | 0.418 |
| 2.867 | 0.419 |
| 2.868 | 0.42 |
| 2.869 | 0.421 |
| 2.87 | 0.422 |
| 2.871 | 0.423 |
| 2.872 | 0.424 |
| 2.873 | 0.426 |
| 2.874 | 0.427 |
| 2.875 | 0.428 |
| 2.876 | 0.429 |
| 2.877 | 0.43 |
| 2.878 | 0.431 |
| 2.879 | 0.432 |
| 2.88 | 0.433 |
| 2.881 | 0.434 |
| 2.882 | 0.435 |
| 2.883 | 0.436 |
| 2.884 | 0.437 |
| 2.885 | 0.438 |
| 2.886 | 0.439 |
| 2.887 | 0.44 |
| 2.888 | 0.441 |
| 2.889 | 0.442 |
| 2.89 | 0.443 |
| 2.891 | 0.444 |
| 2.892 | 0.445 |
| 2.893 | 0.446 |
| 2.894 | 0.447 |
| 2.895 | 0.448 |
| 2.896 | 0.449 |
| 2.897 | 0.45 |
| 2.898 | 0.451 |
| 2.899 | 0.452 |
| 2.9 | 0.452 |
| 2.901 | 0.453 |
| 2.902 | 0.454 |
| 2.903 | 0.455 |
| 2.904 | 0.456 |
| 2.905 | 0.457 |
| 2.906 | 0.458 |
| 2.907 | 0.459 |
| 2.908 | 0.459 |
| 2.909 | 0.46 |
| 2.91 | 0.461 |
| 2.911 | 0.462 |
| 2.912 | 0.463 |
| 2.913 | 0.464 |
| 2.914 | 0.464 |
| 2.915 | 0.465 |
| 2.916 | 0.466 |
| 2.917 | 0.467 |
| 2.918 | 0.467 |
| 2.919 | 0.468 |
| 2.92 | 0.469 |
| 2.921 | 0.47 |
| 2.922 | 0.47 |
| 2.923 | 0.471 |
| 2.924 | 0.472 |
| 2.925 | 0.473 |
| 2.926 | 0.473 |
| 2.927 | 0.474 |
| 2.928 | 0.475 |
| 2.929 | 0.475 |
| 2.93 | 0.476 |
| 2.931 | 0.477 |
| 2.932 | 0.477 |
| 2.933 | 0.478 |
| 2.934 | 0.479 |
| 2.935 | 0.479 |
| 2.936 | 0.48 |
| 2.937 | 0.481 |
| 2.938 | 0.481 |
| 2.939 | 0.482 |
| 2.94 | 0.482 |
| 2.941 | 0.483 |
| 2.942 | 0.483 |
| 2.943 | 0.484 |
| 2.944 | 0.485 |
| 2.945 | 0.485 |
| 2.946 | 0.486 |
| 2.947 | 0.486 |
| 2.948 | 0.487 |
| 2.949 | 0.487 |
| 2.95 | 0.488 |
| 2.951 | 0.488 |
| 2.952 | 0.489 |
| 2.953 | 0.489 |
| 2.954 | 0.49 |
| 2.955 | 0.49 |
| 2.956 | 0.49 |
| 2.957 | 0.491 |
| 2.958 | 0.491 |
| 2.959 | 0.492 |
| 2.96 | 0.492 |
| 2.961 | 0.492 |
| 2.962 | 0.493 |
| 2.963 | 0.493 |
| 2.964 | 0.494 |
| 2.965 | 0.494 |
| 2.966 | 0.494 |
| 2.967 | 0.495 |
| 2.968 | 0.495 |
| 2.969 | 0.495 |
| 2.97 | 0.496 |
| 2.971 | 0.496 |
| 2.972 | 0.496 |
| 2.973 | 0.496 |
| 2.974 | 0.497 |
| 2.975 | 0.497 |
| 2.976 | 0.497 |
| 2.977 | 0.497 |
| 2.978 | 0.498 |
| 2.979 | 0.498 |
| 2.98 | 0.498 |
| 2.981 | 0.498 |
| 2.982 | 0.498 |
| 2.983 | 0.499 |
| 2.984 | 0.499 |
| 2.985 | 0.499 |
| 2.986 | 0.499 |
| 2.987 | 0.499 |
| 2.988 | 0.499 |
| 2.989 | 0.499 |
| 2.99 | 0.5 |
| 2.991 | 0.5 |
| 2.992 | 0.5 |
| 2.993 | 0.5 |
| 2.994 | 0.5 |
| 2.995 | 0.5 |
| 2.996 | 0.5 |
| 2.997 | 0.5 |
| 2.998 | 0.5 |
| 2.999 | 0.5 |
| 3.0 | 0.5 |
| 3.001 | 0.5 |
| 3.002 | 0.5 |
| 3.003 | 0.5 |
| 3.004 | 0.5 |
| 3.005 | 0.5 |
| 3.006 | 0.5 |
| 3.007 | 0.5 |
| 3.008 | 0.5 |
| 3.009 | 0.5 |
| 3.01 | 0.5 |
| 3.011 | 0.499 |
| 3.012 | 0.499 |
| 3.013 | 0.499 |
| 3.014 | 0.499 |
| 3.015 | 0.499 |
| 3.016 | 0.499 |
| 3.017 | 0.499 |
| 3.018 | 0.498 |
| 3.019 | 0.498 |
| 3.02 | 0.498 |
| 3.021 | 0.498 |
| 3.022 | 0.498 |
| 3.023 | 0.497 |
| 3.024 | 0.497 |
| 3.025 | 0.497 |
| 3.026 | 0.497 |
| 3.027 | 0.496 |
| 3.028 | 0.496 |
| 3.029 | 0.496 |
| 3.03 | 0.496 |
| 3.031 | 0.495 |
| 3.032 | 0.495 |
| 3.033 | 0.495 |
| 3.034 | 0.494 |
| 3.035 | 0.494 |
| 3.036 | 0.494 |
| 3.037 | 0.493 |
| 3.038 | 0.493 |
| 3.039 | 0.492 |
| 3.04 | 0.492 |
| 3.041 | 0.492 |
| 3.042 | 0.491 |
| 3.043 | 0.491 |
| 3.044 | 0.49 |
| 3.045 | 0.49 |
| 3.046 | 0.49 |
| 3.047 | 0.489 |
| 3.048 | 0.489 |
| 3.049 | 0.488 |
| 3.05 | 0.488 |
| 3.051 | 0.487 |
| 3.052 | 0.487 |
| 3.053 | 0.486 |
| 3.054 | 0.486 |
| 3.055 | 0.485 |
| 3.056 | 0.485 |
| 3.057 | 0.484 |
| 3.058 | 0.483 |
| 3.059 | 0.483 |
| 3.06 | 0.482 |
| 3.061 | 0.482 |
| 3.062 | 0.481 |
| 3.063 | 0.481 |
| 3.064 | 0.48 |
| 3.065 | 0.479 |
| 3.066 | 0.479 |
| 3.067 | 0.478 |
| 3.068 | 0.477 |
| 3.069 | 0.477 |
| 3.07 | 0.476 |
| 3.071 | 0.475 |
| 3.072 | 0.475 |
| 3.073 | 0.474 |
| 3.074 | 0.473 |
| 3.075 | 0.473 |
| 3.076 | 0.472 |
| 3.077 | 0.471 |
| 3.078 | 0.47 |
| 3.079 | 0.47 |
| 3.08 | 0.469 |
| 3.081 | 0.468 |
| 3.082 | 0.467 |
| 3.083 | 0.467 |
| 3.084 | 0.466 |
| 3.085 | 0.465 |
| 3.086 | 0.464 |
| 3.087 | 0.464 |
| 3.088 | 0.463 |
| 3.089 | 0.462 |
| 3.09 | 0.461 |
| 3.091 | 0.46 |
| 3.092 | 0.459 |
| 3.093 | 0.459 |
| 3.094 | 0.458 |
| 3.095 | 0.457 |
| 3.096 | 0.456 |
| 3.097 | 0.455 |
| 3.098 | 0.454 |
| 3.099 | 0.453 |
| 3.1 | 0.452 |
| 3.101 | 0.452 |
| 3.102 | 0.451 |
| 3.103 | 0.45 |
| 3.104 | 0.449 |
| 3.105 | 0.448 |
| 3.106 | 0.447 |
| 3.107 | 0.446 |
| 3.108 | 0.445 |
| 3.109 | 0.444 |
| 3.11 | 0.443 |
| 3.111 | 0.442 |
| 3.112 | 0.441 |
| 3.113 | 0.44 |
| 3.114 | 0.439 |
| 3.115 | 0.438 |
| 3.116 | 0.437 |
| 3.117 | 0.436 |
| 3.118 | 0.435 |
| 3.119 | 0.434 |
| 3.12 | 0.433 |
| 3.121 | 0.432 |
| 3.122 | 0.431 |
| 3.123 | 0.43 |
| 3.124 | 0.429 |
| 3.125 | 0.428 |
| 3.126 | 0.427 |
| 3.127 | 0.426 |
| 3.128 | 0.424 |
| 3.129 | 0.423 |
| 3.13 | 0.422 |
| 3.131 | 0.421 |
| 3.132 | 0.42 |
| 3.133 | 0.419 |
| 3.134 | 0.418 |
| 3.135 | 0.417 |
| 3.136 | 0.416 |
| 3.137 | 0.414 |
| 3.138 | 0.413 |
| 3.139 | 0.412 |
| 3.14 | 0.411 |
| 3.141 | 0.41 |
| 3.142 | 0.409 |
| 3.143 | 0.408 |
| 3.144 | 0.406 |
| 3.145 | 0.405 |
| 3.146 | 0.404 |
| 3.147 | 0.403 |
| 3.148 | 0.402 |
| 3.149 | 0.4 |
| 3.15 | 0.399 |
| 3.151 | 0.398 |
| 3.152 | 0.397 |
| 3.153 | 0.396 |
| 3.154 | 0.394 |
| 3.155 | 0.393 |
| 3.156 | 0.392 |
| 3.157 | 0.391 |
| 3.158 | 0.39 |
| 3.159 | 0.388 |
| 3.16 | 0.387 |
| 3.161 | 0.386 |
| 3.162 | 0.385 |
| 3.163 | 0.383 |
| 3.164 | 0.382 |
| 3.165 | 0.381 |
| 3.166 | 0.38 |
| 3.167 | 0.378 |
| 3.168 | 0.377 |
| 3.169 | 0.376 |
| 3.17 | 0.375 |
| 3.171 | 0.373 |
| 3.172 | 0.372 |
| 3.173 | 0.371 |
| 3.174 | 0.369 |
| 3.175 | 0.368 |
| 3.176 | 0.367 |
| 3.177 | 0.366 |
| 3.178 | 0.364 |
| 3.179 | 0.363 |
| 3.18 | 0.362 |
| 3.181 | 0.36 |
| 3.182 | 0.359 |
| 3.183 | 0.358 |
| 3.184 | 0.356 |
| 3.185 | 0.355 |
| 3.186 | 0.354 |
| 3.187 | 0.352 |
| 3.188 | 0.351 |
| 3.189 | 0.35 |
| 3.19 | 0.348 |
| 3.191 | 0.347 |
| 3.192 | 0.346 |
| 3.193 | 0.345 |
| 3.194 | 0.343 |
| 3.195 | 0.342 |
| 3.196 | 0.341 |
| 3.197 | 0.339 |
| 3.198 | 0.338 |
| 3.199 | 0.336 |
| 3.2 | 0.335 |
| 3.201 | 0.334 |
| 3.202 | 0.332 |
| 3.203 | 0.331 |
| 3.204 | 0.33 |
| 3.205 | 0.328 |
| 3.206 | 0.327 |
| 3.207 | 0.326 |
| 3.208 | 0.324 |
| 3.209 | 0.323 |
| 3.21 | 0.322 |
| 3.211 | 0.32 |
| 3.212 | 0.319 |
| 3.213 | 0.318 |
| 3.214 | 0.316 |
| 3.215 | 0.315 |
| 3.216 | 0.314 |
| 3.217 | 0.312 |
| 3.218 | 0.311 |
| 3.219 | 0.31 |
| 3.22 | 0.308 |
| 3.221 | 0.307 |
| 3.222 | 0.305 |
| 3.223 | 0.304 |
| 3.224 | 0.303 |
| 3.225 | 0.301 |
| 3.226 | 0.3 |
| 3.227 | 0.299 |
| 3.228 | 0.297 |
| 3.229 | 0.296 |
| 3.23 | 0.295 |
| 3.231 | 0.293 |
| 3.232 | 0.292 |
| 3.233 | 0.291 |
| 3.234 | 0.289 |
| 3.235 | 0.288 |
| 3.236 | 0.286 |
| 3.237 | 0.285 |
| 3.238 | 0.284 |
| 3.239 | 0.282 |
| 3.24 | 0.281 |
| 3.241 | 0.28 |
| 3.242 | 0.278 |
| 3.243 | 0.277 |
| 3.244 | 0.276 |
| 3.245 | 0.274 |
| 3.246 | 0.273 |
| 3.247 | 0.272 |
| 3.248 | 0.27 |
| 3.249 | 0.269 |
| 3.25 | 0.268 |
| 3.251 | 0.266 |
| 3.252 | 0.265 |
| 3.253 | 0.264 |
| 3.254 | 0.262 |
| 3.255 | 0.261 |
| 3.256 | 0.26 |
| 3.257 | 0.258 |
| 3.258 | 0.257 |
| 3.259 | 0.256 |
| 3.26 | 0.254 |
| 3.261 | 0.253 |
| 3.262 | 0.252 |
| 3.263 | 0.25 |
| 3.264 | 0.249 |
| 3.265 | 0.248 |
| 3.266 | 0.246 |
| 3.267 | 0.245 |
| 3.268 | 0.244 |
| 3.269 | 0.242 |
| 3.27 | 0.241 |
| 3.271 | 0.24 |
| 3.272 | 0.239 |
| 3.273 | 0.237 |
| 3.274 | 0.236 |
| 3.275 | 0.235 |
| 3.276 | 0.233 |
| 3.277 | 0.232 |
| 3.278 | 0.231 |
| 3.279 | 0.23 |
| 3.28 | 0.228 |
| 3.281 | 0.227 |
| 3.282 | 0.226 |
| 3.283 | 0.224 |
| 3.284 | 0.223 |
| 3.285 | 0.222 |
| 3.286 | 0.221 |
| 3.287 | 0.219 |
| 3.288 | 0.218 |
| 3.289 | 0.217 |
| 3.29 | 0.216 |
| 3.291 | 0.214 |
| 3.292 | 0.213 |
| 3.293 | 0.212 |
| 3.294 | 0.211 |
| 3.295 | 0.209 |
| 3.296 | 0.208 |
| 3.297 | 0.207 |
| 3.298 | 0.206 |
| 3.299 | 0.205 |
| 3.3 | 0.203 |
| 3.301 | 0.202 |
| 3.302 | 0.201 |
| 3.303 | 0.2 |
| 3.304 | 0.198 |
| 3.305 | 0.197 |
| 3.306 | 0.196 |
| 3.307 | 0.195 |
| 3.308 | 0.194 |
| 3.309 | 0.192 |
| 3.31 | 0.191 |
| 3.311 | 0.19 |
| 3.312 | 0.189 |
| 3.313 | 0.188 |
| 3.314 | 0.187 |
| 3.315 | 0.185 |
| 3.316 | 0.184 |
| 3.317 | 0.183 |
| 3.318 | 0.182 |
| 3.319 | 0.181 |
| 3.32 | 0.18 |
| 3.321 | 0.178 |
| 3.322 | 0.177 |
| 3.323 | 0.176 |
| 3.324 | 0.175 |
| 3.325 | 0.174 |
| 3.326 | 0.173 |
| 3.327 | 0.172 |
| 3.328 | 0.171 |
| 3.329 | 0.169 |
| 3.33 | 0.168 |
| 3.331 | 0.167 |
| 3.332 | 0.166 |
| 3.333 | 0.165 |
| 3.334 | 0.164 |
| 3.335 | 0.163 |
| 3.336 | 0.162 |
| 3.337 | 0.161 |
| 3.338 | 0.16 |
| 3.339 | 0.158 |
| 3.34 | 0.157 |
| 3.341 | 0.156 |
| 3.342 | 0.155 |
| 3.343 | 0.154 |
| 3.344 | 0.153 |
| 3.345 | 0.152 |
| 3.346 | 0.151 |
| 3.347 | 0.15 |
| 3.348 | 0.149 |
| 3.349 | 0.148 |
| 3.35 | 0.147 |
| 3.351 | 0.146 |
| 3.352 | 0.145 |
| 3.353 | 0.144 |
| 3.354 | 0.143 |
| 3.355 | 0.142 |
| 3.356 | 0.141 |
| 3.357 | 0.14 |
| 3.358 | 0.139 |
| 3.359 | 0.138 |
| 3.36 | 0.137 |
| 3.361 | 0.136 |
| 3.362 | 0.135 |
| 3.363 | 0.134 |
| 3.364 | 0.133 |
| 3.365 | 0.132 |
| 3.366 | 0.131 |
| 3.367 | 0.13 |
| 3.368 | 0.129 |
| 3.369 | 0.128 |
| 3.37 | 0.127 |
| 3.371 | 0.126 |
| 3.372 | 0.125 |
| 3.373 | 0.124 |
| 3.374 | 0.123 |
| 3.375 | 0.123 |
| 3.376 | 0.122 |
| 3.377 | 0.121 |
| 3.378 | 0.12 |
| 3.379 | 0.119 |
| 3.38 | 0.118 |
| 3.381 | 0.117 |
| 3.382 | 0.116 |
| 3.383 | 0.115 |
| 3.384 | 0.114 |
| 3.385 | 0.114 |
| 3.386 | 0.113 |
| 3.387 | 0.112 |
| 3.388 | 0.111 |
| 3.389 | 0.11 |
| 3.39 | 0.109 |
| 3.391 | 0.108 |
| 3.392 | 0.108 |
| 3.393 | 0.107 |
| 3.394 | 0.106 |
| 3.395 | 0.105 |
| 3.396 | 0.104 |
| 3.397 | 0.103 |
| 3.398 | 0.103 |
| 3.399 | 0.102 |
| 3.4 | 0.101 |
| 3.401 | 0.1 |
| 3.402 | 0.099 |
| 3.403 | 0.099 |
| 3.404 | 0.098 |
| 3.405 | 0.097 |
| 3.406 | 0.096 |
| 3.407 | 0.095 |
| 3.408 | 0.095 |
| 3.409 | 0.094 |
| 3.41 | 0.093 |
| 3.411 | 0.092 |
| 3.412 | 0.092 |
| 3.413 | 0.091 |
| 3.414 | 0.09 |
| 3.415 | 0.089 |
| 3.416 | 0.089 |
| 3.417 | 0.088 |
| 3.418 | 0.087 |
| 3.419 | 0.086 |
| 3.42 | 0.086 |
| 3.421 | 0.085 |
| 3.422 | 0.084 |
| 3.423 | 0.084 |
| 3.424 | 0.083 |
| 3.425 | 0.082 |
| 3.426 | 0.081 |
| 3.427 | 0.081 |
| 3.428 | 0.08 |
| 3.429 | 0.079 |
| 3.43 | 0.079 |
| 3.431 | 0.078 |
| 3.432 | 0.077 |
| 3.433 | 0.077 |
| 3.434 | 0.076 |
| 3.435 | 0.075 |
| 3.436 | 0.075 |
| 3.437 | 0.074 |
| 3.438 | 0.073 |
| 3.439 | 0.073 |
| 3.44 | 0.072 |
| 3.441 | 0.072 |
| 3.442 | 0.071 |
| 3.443 | 0.07 |
| 3.444 | 0.07 |
| 3.445 | 0.069 |
| 3.446 | 0.068 |
| 3.447 | 0.068 |
| 3.448 | 0.067 |
| 3.449 | 0.067 |
| 3.45 | 0.066 |
| 3.451 | 0.065 |
| 3.452 | 0.065 |
| 3.453 | 0.064 |
| 3.454 | 0.064 |
| 3.455 | 0.063 |
| 3.456 | 0.063 |
| 3.457 | 0.062 |
| 3.458 | 0.061 |
| 3.459 | 0.061 |
| 3.46 | 0.06 |
| 3.461 | 0.06 |
| 3.462 | 0.059 |
| 3.463 | 0.059 |
| 3.464 | 0.058 |
| 3.465 | 0.058 |
| 3.466 | 0.057 |
| 3.467 | 0.056 |
| 3.468 | 0.056 |
| 3.469 | 0.055 |
| 3.47 | 0.055 |
| 3.471 | 0.054 |
| 3.472 | 0.054 |
| 3.473 | 0.053 |
| 3.474 | 0.053 |
| 3.475 | 0.052 |
| 3.476 | 0.052 |
| 3.477 | 0.051 |
| 3.478 | 0.051 |
| 3.479 | 0.05 |
| 3.48 | 0.05 |
| 3.481 | 0.049 |
| 3.482 | 0.049 |
| 3.483 | 0.049 |
| 3.484 | 0.048 |
| 3.485 | 0.048 |
| 3.486 | 0.047 |
| 3.487 | 0.047 |
| 3.488 | 0.046 |
| 3.489 | 0.046 |
| 3.49 | 0.045 |
| 3.491 | 0.045 |
| 3.492 | 0.044 |
| 3.493 | 0.044 |
| 3.494 | 0.044 |
| 3.495 | 0.043 |
| 3.496 | 0.043 |
| 3.497 | 0.042 |
| 3.498 | 0.042 |
| 3.499 | 0.041 |
| 3.5 | 0.041 |
| 3.501 | 0.041 |
| 3.502 | 0.04 |
| 3.503 | 0.04 |
| 3.504 | 0.039 |
| 3.505 | 0.039 |
| 3.506 | 0.039 |
| 3.507 | 0.038 |
| 3.508 | 0.038 |
| 3.509 | 0.037 |
| 3.51 | 0.037 |
| 3.511 | 0.037 |
| 3.512 | 0.036 |
| 3.513 | 0.036 |
| 3.514 | 0.036 |
| 3.515 | 0.035 |
| 3.516 | 0.035 |
| 3.517 | 0.035 |
| 3.518 | 0.034 |
| 3.519 | 0.034 |
| 3.52 | 0.033 |
| 3.521 | 0.033 |
| 3.522 | 0.033 |
| 3.523 | 0.032 |
| 3.524 | 0.032 |
| 3.525 | 0.032 |
| 3.526 | 0.031 |
| 3.527 | 0.031 |
| 3.528 | 0.031 |
| 3.529 | 0.03 |
| 3.53 | 0.03 |
| 3.531 | 0.03 |
| 3.532 | 0.029 |
| 3.533 | 0.029 |
| 3.534 | 0.029 |
| 3.535 | 0.029 |
| 3.536 | 0.028 |
| 3.537 | 0.028 |
| 3.538 | 0.028 |
| 3.539 | 0.027 |
| 3.54 | 0.027 |
| 3.541 | 0.027 |
| 3.542 | 0.026 |
| 3.543 | 0.026 |
| 3.544 | 0.026 |
| 3.545 | 0.026 |
| 3.546 | 0.025 |
| 3.547 | 0.025 |
| 3.548 | 0.025 |
| 3.549 | 0.025 |
| 3.55 | 0.024 |
| 3.551 | 0.024 |
| 3.552 | 0.024 |
| 3.553 | 0.023 |
| 3.554 | 0.023 |
| 3.555 | 0.023 |
| 3.556 | 0.023 |
| 3.557 | 0.022 |
| 3.558 | 0.022 |
| 3.559 | 0.022 |
| 3.56 | 0.022 |
| 3.561 | 0.021 |
| 3.562 | 0.021 |
| 3.563 | 0.021 |
| 3.564 | 0.021 |
| 3.565 | 0.021 |
| 3.566 | 0.02 |
| 3.567 | 0.02 |
| 3.568 | 0.02 |
| 3.569 | 0.02 |
| 3.57 | 0.019 |
| 3.571 | 0.019 |
| 3.572 | 0.019 |
| 3.573 | 0.019 |
| 3.574 | 0.019 |
| 3.575 | 0.018 |
| 3.576 | 0.018 |
| 3.577 | 0.018 |
| 3.578 | 0.018 |
| 3.579 | 0.017 |
| 3.58 | 0.017 |
| 3.581 | 0.017 |
| 3.582 | 0.017 |
| 3.583 | 0.017 |
| 3.584 | 0.017 |
| 3.585 | 0.016 |
| 3.586 | 0.016 |
| 3.587 | 0.016 |
| 3.588 | 0.016 |
| 3.589 | 0.016 |
| 3.59 | 0.015 |
| 3.591 | 0.015 |
| 3.592 | 0.015 |
| 3.593 | 0.015 |
| 3.594 | 0.015 |
| 3.595 | 0.015 |
| 3.596 | 0.014 |
| 3.597 | 0.014 |
| 3.598 | 0.014 |
| 3.599 | 0.014 |
| 3.6 | 0.014 |
| 3.601 | 0.013 |
| 3.602 | 0.013 |
| 3.603 | 0.013 |
| 3.604 | 0.013 |
| 3.605 | 0.013 |
| 3.606 | 0.013 |
| 3.607 | 0.013 |
| 3.608 | 0.012 |
| 3.609 | 0.012 |
| 3.61 | 0.012 |
| 3.611 | 0.012 |
| 3.612 | 0.012 |
| 3.613 | 0.012 |
| 3.614 | 0.012 |
| 3.615 | 0.011 |
| 3.616 | 0.011 |
| 3.617 | 0.011 |
| 3.618 | 0.011 |
| 3.619 | 0.011 |
| 3.62 | 0.011 |
| 3.621 | 0.011 |
| 3.622 | 0.01 |
| 3.623 | 0.01 |
| 3.624 | 0.01 |
| 3.625 | 0.01 |
| 3.626 | 0.01 |
| 3.627 | 0.01 |
| 3.628 | 0.01 |
| 3.629 | 0.01 |
| 3.63 | 0.009 |
| 3.631 | 0.009 |
| 3.632 | 0.009 |
| 3.633 | 0.009 |
| 3.634 | 0.009 |
| 3.635 | 0.009 |
| 3.636 | 0.009 |
| 3.637 | 0.009 |
| 3.638 | 0.009 |
| 3.639 | 0.008 |
| 3.64 | 0.008 |
| 3.641 | 0.008 |
| 3.642 | 0.008 |
| 3.643 | 0.008 |
| 3.644 | 0.008 |
| 3.645 | 0.008 |
| 3.646 | 0.008 |
| 3.647 | 0.008 |
| 3.648 | 0.008 |
| 3.649 | 0.007 |
| 3.65 | 0.007 |
| 3.651 | 0.007 |
| 3.652 | 0.007 |
| 3.653 | 0.007 |
| 3.654 | 0.007 |
| 3.655 | 0.007 |
| 3.656 | 0.007 |
| 3.657 | 0.007 |
| 3.658 | 0.007 |
| 3.659 | 0.006 |
| 3.66 | 0.006 |
| 3.661 | 0.006 |
| 3.662 | 0.006 |
| 3.663 | 0.006 |
| 3.664 | 0.006 |
| 3.665 | 0.006 |
| 3.666 | 0.006 |
| 3.667 | 0.006 |
| 3.668 | 0.006 |
| 3.669 | 0.006 |
| 3.67 | 0.006 |
| 3.671 | 0.006 |
| 3.672 | 0.005 |
| 3.673 | 0.005 |
| 3.674 | 0.005 |
| 3.675 | 0.005 |
| 3.676 | 0.005 |
| 3.677 | 0.005 |
| 3.678 | 0.005 |
| 3.679 | 0.005 |
| 3.68 | 0.005 |
| 3.681 | 0.005 |
| 3.682 | 0.005 |
| 3.683 | 0.005 |
| 3.684 | 0.005 |
| 3.685 | 0.005 |
| 3.686 | 0.005 |
| 3.687 | 0.004 |
| 3.688 | 0.004 |
| 3.689 | 0.004 |
| 3.69 | 0.004 |
| 3.691 | 0.004 |
| 3.692 | 0.004 |
| 3.693 | 0.004 |
| 3.694 | 0.004 |
| 3.695 | 0.004 |
| 3.696 | 0.004 |
| 3.697 | 0.004 |
| 3.698 | 0.004 |
| 3.699 | 0.004 |
| 3.7 | 0.004 |
| 3.701 | 0.004 |
| 3.702 | 0.004 |
| 3.703 | 0.004 |
| 3.704 | 0.004 |
| 3.705 | 0.003 |
| 3.706 | 0.003 |
| 3.707 | 0.003 |
| 3.708 | 0.003 |
| 3.709 | 0.003 |
| 3.71 | 0.003 |
| 3.711 | 0.003 |
| 3.712 | 0.003 |
| 3.713 | 0.003 |
| 3.714 | 0.003 |
| 3.715 | 0.003 |
| 3.716 | 0.003 |
| 3.717 | 0.003 |
| 3.718 | 0.003 |
| 3.719 | 0.003 |
| 3.72 | 0.003 |
| 3.721 | 0.003 |
| 3.722 | 0.003 |
| 3.723 | 0.003 |
| 3.724 | 0.003 |
| 3.725 | 0.003 |
| 3.726 | 0.003 |
| 3.727 | 0.003 |
| 3.728 | 0.002 |
| 3.729 | 0.002 |
| 3.73 | 0.002 |
| 3.731 | 0.002 |
| 3.732 | 0.002 |
| 3.733 | 0.002 |
| 3.734 | 0.002 |
| 3.735 | 0.002 |
| 3.736 | 0.002 |
| 3.737 | 0.002 |
| 3.738 | 0.002 |
| 3.739 | 0.002 |
| 3.74 | 0.002 |
| 3.741 | 0.002 |
| 3.742 | 0.002 |
| 3.743 | 0.002 |
| 3.744 | 0.002 |
| 3.745 | 0.002 |
| 3.746 | 0.002 |
| 3.747 | 0.002 |
| 3.748 | 0.002 |
| 3.749 | 0.002 |
| 3.75 | 0.002 |
| 3.751 | 0.002 |
| 3.752 | 0.002 |
| 3.753 | 0.002 |
| 3.754 | 0.002 |
| 3.755 | 0.002 |
| 3.756 | 0.002 |
| 3.757 | 0.002 |
| 3.758 | 0.002 |
| 3.759 | 0.002 |
| 3.76 | 0.002 |
| 3.761 | 0.002 |
| 3.762 | 0.002 |
| 3.763 | 0.001 |
| 3.764 | 0.001 |
| 3.765 | 0.001 |
| 3.766 | 0.001 |
| 3.767 | 0.001 |
| 3.768 | 0.001 |
| 3.769 | 0.001 |
| 3.77 | 0.001 |
| 3.771 | 0.001 |
| 3.772 | 0.001 |
| 3.773 | 0.001 |
| 3.774 | 0.001 |
| 3.775 | 0.001 |
| 3.776 | 0.001 |
| 3.777 | 0.001 |
| 3.778 | 0.001 |
| 3.779 | 0.001 |
| 3.78 | 0.001 |
| 3.781 | 0.001 |
| 3.782 | 0.001 |
| 3.783 | 0.001 |
| 3.784 | 0.001 |
| 3.785 | 0.001 |
| 3.786 | 0.001 |
| 3.787 | 0.001 |
| 3.788 | 0.001 |
| 3.789 | 0.001 |
| 3.79 | 0.001 |
| 3.791 | 0.001 |
| 3.792 | 0.001 |
| 3.793 | 0.001 |
| 3.794 | 0.001 |
| 3.795 | 0.001 |
| 3.796 | 0.001 |
| 3.797 | 0.001 |
| 3.798 | 0.001 |
| 3.799 | 0.001 |
| 3.8 | 0.001 |
| 3.801 | 0.001 |
| 3.802 | 0.001 |
| 3.803 | 0.001 |
| 3.804 | 0.001 |
| 3.805 | 0.001 |
| 3.806 | 0.001 |
| 3.807 | 0.001 |
| 3.808 | 0.001 |
| 3.809 | 0.001 |
| 3.81 | 0.001 |
| 3.811 | 0.001 |
| 3.812 | 0.001 |
| 3.813 | 0.001 |
| 3.814 | 0.001 |
| 3.815 | 0.001 |
| 3.816 | 0.001 |
| 3.817 | 0.001 |
| 3.818 | 0.001 |
| 3.819 | 0.001 |
| 3.82 | 0.001 |
| 3.821 | 0.001 |
| 3.822 | 0.001 |
| 3.823 | 0.001 |
| 3.824 | 0.001 |
| 3.825 | 0.001 |
| 3.826 | 0.001 |
| 3.827 | 0.001 |
| 3.828 | 0.001 |
| 3.829 | 0.001 |
| 3.83 | 0.001 |
| 3.831 | 0.001 |
| 3.832 | 0 |
| 3.833 | 0 |
| 3.834 | 0 |
| 3.835 | 0 |
| 3.836 | 0 |
| 3.837 | 0 |
| 3.838 | 0 |
| 3.839 | 0 |
| 3.84 | 0 |
| 3.841 | 0 |
| 3.842 | 0 |
| 3.843 | 0 |
| 3.844 | 0 |
| 3.845 | 0 |
| 3.846 | 0 |
| 3.847 | 0 |
| 3.848 | 0 |
| 3.849 | 0 |
| 3.85 | 0 |
| 3.851 | 0 |
| 3.852 | 0 |
| 3.853 | 0 |
| 3.854 | 0 |
| 3.855 | 0 |
| 3.856 | 0 |
| 3.857 | 0 |
| 3.858 | 0 |
| 3.859 | 0 |
| 3.86 | 0 |
| 3.861 | 0 |
| 3.862 | 0 |
| 3.863 | 0 |
| 3.864 | 0 |
| 3.865 | 0 |
| 3.866 | 0 |
| 3.867 | 0 |
| 3.868 | 0 |
| 3.869 | 0 |
| 3.87 | 0 |
| 3.871 | 0 |
| 3.872 | 0 |
| 3.873 | 0 |
| 3.874 | 0 |
| 3.875 | 0 |
| 3.876 | 0 |
| 3.877 | 0 |
| 3.878 | 0 |
| 3.879 | 0 |
| 3.88 | 0 |
| 3.881 | 0 |
| 3.882 | 0 |
| 3.883 | 0 |
| 3.884 | 0 |
| 3.885 | 0 |
| 3.886 | 0 |
| 3.887 | 0 |
| 3.888 | 0 |
| 3.889 | 0 |
| 3.89 | 0 |
| 3.891 | 0 |
| 3.892 | 0 |
| 3.893 | 0 |
| 3.894 | 0 |
| 3.895 | 0 |
| 3.896 | 0 |
| 3.897 | 0 |
| 3.898 | 0 |
| 3.899 | 0 |
| 3.9 | 0 |
| 3.901 | 0 |
| 3.902 | 0 |
| 3.903 | 0 |
| 3.904 | 0 |
| 3.905 | 0 |
| 3.906 | 0 |
| 3.907 | 0 |
| 3.908 | 0 |
| 3.909 | 0 |
| 3.91 | 0 |
| 3.911 | 0 |
| 3.912 | 0 |
| 3.913 | 0 |
| 3.914 | 0 |
| 3.915 | 0 |
| 3.916 | 0 |
| 3.917 | 0 |
| 3.918 | 0 |
| 3.919 | 0 |
| 3.92 | 0 |
| 3.921 | 0 |
| 3.922 | 0 |
| 3.923 | 0 |
| 3.924 | 0 |
| 3.925 | 0 |
| 3.926 | 0 |
| 3.927 | 0 |
| 3.928 | 0 |
| 3.929 | 0 |
| 3.93 | 0 |
| 3.931 | 0 |
| 3.932 | 0 |
| 3.933 | 0 |
| 3.934 | 0 |
| 3.935 | 0 |
| 3.936 | 0 |
| 3.937 | 0 |
| 3.938 | 0 |
| 3.939 | 0 |
| 3.94 | 0 |
| 3.941 | 0 |
| 3.942 | 0 |
| 3.943 | 0 |
| 3.944 | 0 |
| 3.945 | 0 |
| 3.946 | 0 |
| 3.947 | 0 |
| 3.948 | 0 |
| 3.949 | 0 |
| 3.95 | 0 |
| 3.951 | 0 |
| 3.952 | 0 |
| 3.953 | 0 |
| 3.954 | 0 |
| 3.955 | 0 |
| 3.956 | 0 |
| 3.957 | 0 |
| 3.958 | 0 |
| 3.959 | 0 |
| 3.96 | 0 |
| 3.961 | 0 |
| 3.962 | 0 |
| 3.963 | 0 |
| 3.964 | 0 |
| 3.965 | 0 |
| 3.966 | 0 |
| 3.967 | 0 |
| 3.968 | 0 |
| 3.969 | 0 |
| 3.97 | 0 |
| 3.971 | 0 |
| 3.972 | 0 |
| 3.973 | 0 |
| 3.974 | 0 |
| 3.975 | 0 |
| 3.976 | 0 |
| 3.977 | 0 |
| 3.978 | 0 |
| 3.979 | 0 |
| 3.98 | 0 |
| 3.981 | 0 |
| 3.982 | 0 |
| 3.983 | 0 |
| 3.984 | 0 |
| 3.985 | 0 |
| 3.986 | 0 |
| 3.987 | 0 |
| 3.988 | 0 |
| 3.989 | 0 |
| 3.99 | 0 |
| 3.991 | 0 |
| 3.992 | 0 |
| 3.993 | 0 |
| 3.994 | 0 |
| 3.995 | 0 |
| 3.996 | 0 |
| 3.997 | 0 |
| 3.998 | 0 |
| 3.999 | 0 |
| 4.0 | 0 |
| 4.001 | 0 |
| 4.002 | 0 |
| 4.003 | 0 |
| 4.004 | 0 |
| 4.005 | 0 |
| 4.006 | 0 |
| 4.007 | 0 |
| 4.008 | 0 |
| 4.009 | 0 |
| 4.01 | 0 |
| 4.011 | 0 |
| 4.012 | 0 |
| 4.013 | 0 |
| 4.014 | 0 |
| 4.015 | 0 |
| 4.016 | 0 |
| 4.017 | 0 |
| 4.018 | 0 |
| 4.019 | 0 |
| 4.02 | 0 |
| 4.021 | 0 |
| 4.022 | 0 |
| 4.023 | 0 |
| 4.024 | 0 |
| 4.025 | 0 |
| 4.026 | 0 |
| 4.027 | 0 |
| 4.028 | 0 |
| 4.029 | 0 |
| 4.03 | 0 |
| 4.031 | 0 |
| 4.032 | 0 |
| 4.033 | 0 |
| 4.034 | 0 |
| 4.035 | 0 |
| 4.036 | 0 |
| 4.037 | 0 |
| 4.038 | 0 |
| 4.039 | 0 |
| 4.04 | 0 |
| 4.041 | 0 |
| 4.042 | 0 |
| 4.043 | 0 |
| 4.044 | 0 |
| 4.045 | 0 |
| 4.046 | 0 |
| 4.047 | 0 |
| 4.048 | 0 |
| 4.049 | 0 |
| 4.05 | 0 |
| 4.051 | 0 |
| 4.052 | 0 |
| 4.053 | 0 |
| 4.054 | 0 |
| 4.055 | 0 |
| 4.056 | 0 |
| 4.057 | 0 |
| 4.058 | 0 |
| 4.059 | 0 |
| 4.06 | 0 |
| 4.061 | 0 |
| 4.062 | 0 |
| 4.063 | 0 |
| 4.064 | 0 |
| 4.065 | 0 |
| 4.066 | 0 |
| 4.067 | 0 |
| 4.068 | 0 |
| 4.069 | 0 |
| 4.07 | 0 |
| 4.071 | 0 |
| 4.072 | 0 |
| 4.073 | 0 |
| 4.074 | 0 |
| 4.075 | 0 |
| 4.076 | 0 |
| 4.077 | 0 |
| 4.078 | 0 |
| 4.079 | 0 |
| 4.08 | 0 |
| 4.081 | 0 |
| 4.082 | 0 |
| 4.083 | 0 |
| 4.084 | 0 |
| 4.085 | 0 |
| 4.086 | 0 |
| 4.087 | 0 |
| 4.088 | 0 |
| 4.089 | 0 |
| 4.09 | 0 |
| 4.091 | 0 |
| 4.092 | 0 |
| 4.093 | 0 |
| 4.094 | 0 |
| 4.095 | 0 |
| 4.096 | 0 |
| 4.097 | 0 |
| 4.098 | 0 |
| 4.099 | 0 |
| 4.1 | 0 |
| 4.101 | 0 |
| 4.102 | 0 |
| 4.103 | 0 |
| 4.104 | 0 |
| 4.105 | 0 |
| 4.106 | 0 |
| 4.107 | 0 |
| 4.108 | 0 |
| 4.109 | 0 |
| 4.11 | 0 |
| 4.111 | 0 |
| 4.112 | 0 |
| 4.113 | 0 |
| 4.114 | 0 |
| 4.115 | 0 |
| 4.116 | 0 |
| 4.117 | 0 |
| 4.118 | 0 |
| 4.119 | 0 |
| 4.12 | 0 |
| 4.121 | 0 |
| 4.122 | 0 |
| 4.123 | 0 |
| 4.124 | 0 |
| 4.125 | 0 |
| 4.126 | 0 |
| 4.127 | 0 |
| 4.128 | 0.001 |
| 4.129 | 0.001 |
| 4.13 | 0.001 |
| 4.131 | 0.001 |
| 4.132 | 0.001 |
| 4.133 | 0.001 |
| 4.134 | 0.001 |
| 4.135 | 0.001 |
| 4.136 | 0.001 |
| 4.137 | 0.001 |
| 4.138 | 0.001 |
| 4.139 | 0.001 |
| 4.14 | 0.001 |
| 4.141 | 0.001 |
| 4.142 | 0.001 |
| 4.143 | 0.001 |
| 4.144 | 0.001 |
| 4.145 | 0.001 |
| 4.146 | 0.001 |
| 4.147 | 0.001 |
| 4.148 | 0.001 |
| 4.149 | 0.001 |
| 4.15 | 0.001 |
| 4.151 | 0.001 |
| 4.152 | 0.001 |
| 4.153 | 0.001 |
| 4.154 | 0.001 |
| 4.155 | 0.001 |
| 4.156 | 0.001 |
| 4.157 | 0.001 |
| 4.158 | 0.001 |
| 4.159 | 0.001 |
| 4.16 | 0.001 |
| 4.161 | 0.001 |
| 4.162 | 0.001 |
| 4.163 | 0.001 |
| 4.164 | 0.001 |
| 4.165 | 0.001 |
| 4.166 | 0.001 |
| 4.167 | 0.001 |
| 4.168 | 0.001 |
| 4.169 | 0.001 |
| 4.17 | 0.001 |
| 4.171 | 0.001 |
| 4.172 | 0.001 |
| 4.173 | 0.001 |
| 4.174 | 0.001 |
| 4.175 | 0.001 |
| 4.176 | 0.001 |
| 4.177 | 0.001 |
| 4.178 | 0.001 |
| 4.179 | 0.001 |
| 4.18 | 0.001 |
| 4.181 | 0.001 |
| 4.182 | 0.001 |
| 4.183 | 0.001 |
| 4.184 | 0.001 |
| 4.185 | 0.001 |
| 4.186 | 0.001 |
| 4.187 | 0.001 |
| 4.188 | 0.001 |
| 4.189 | 0.001 |
| 4.19 | 0.001 |
| 4.191 | 0.001 |
| 4.192 | 0.001 |
| 4.193 | 0.001 |
| 4.194 | 0.002 |
| 4.195 | 0.002 |
| 4.196 | 0.002 |
| 4.197 | 0.002 |
| 4.198 | 0.002 |
| 4.199 | 0.002 |
| 4.2 | 0.002 |
| 4.201 | 0.002 |
| 4.202 | 0.002 |
| 4.203 | 0.002 |
| 4.204 | 0.002 |
| 4.205 | 0.002 |
| 4.206 | 0.002 |
| 4.207 | 0.002 |
| 4.208 | 0.002 |
| 4.209 | 0.002 |
| 4.21 | 0.002 |
| 4.211 | 0.002 |
| 4.212 | 0.002 |
| 4.213 | 0.002 |
| 4.214 | 0.002 |
| 4.215 | 0.002 |
| 4.216 | 0.002 |
| 4.217 | 0.002 |
| 4.218 | 0.002 |
| 4.219 | 0.002 |
| 4.22 | 0.002 |
| 4.221 | 0.002 |
| 4.222 | 0.002 |
| 4.223 | 0.002 |
| 4.224 | 0.002 |
| 4.225 | 0.002 |
| 4.226 | 0.003 |
| 4.227 | 0.003 |
| 4.228 | 0.003 |
| 4.229 | 0.003 |
| 4.23 | 0.003 |
| 4.231 | 0.003 |
| 4.232 | 0.003 |
| 4.233 | 0.003 |
| 4.234 | 0.003 |
| 4.235 | 0.003 |
| 4.236 | 0.003 |
| 4.237 | 0.003 |
| 4.238 | 0.003 |
| 4.239 | 0.003 |
| 4.24 | 0.003 |
| 4.241 | 0.003 |
| 4.242 | 0.003 |
| 4.243 | 0.003 |
| 4.244 | 0.003 |
| 4.245 | 0.003 |
| 4.246 | 0.003 |
| 4.247 | 0.003 |
| 4.248 | 0.003 |
| 4.249 | 0.004 |
| 4.25 | 0.004 |
| 4.251 | 0.004 |
| 4.252 | 0.004 |
| 4.253 | 0.004 |
| 4.254 | 0.004 |
| 4.255 | 0.004 |
| 4.256 | 0.004 |
| 4.257 | 0.004 |
| 4.258 | 0.004 |
| 4.259 | 0.004 |
| 4.26 | 0.004 |
| 4.261 | 0.004 |
| 4.262 | 0.004 |
| 4.263 | 0.004 |
| 4.264 | 0.004 |
| 4.265 | 0.005 |
| 4.266 | 0.005 |
| 4.267 | 0.005 |
| 4.268 | 0.005 |
| 4.269 | 0.005 |
| 4.27 | 0.005 |
| 4.271 | 0.005 |
| 4.272 | 0.005 |
| 4.273 | 0.005 |
| 4.274 | 0.005 |
| 4.275 | 0.005 |
| 4.276 | 0.005 |
| 4.277 | 0.005 |
| 4.278 | 0.005 |
| 4.279 | 0.006 |
| 4.28 | 0.006 |
| 4.281 | 0.006 |
| 4.282 | 0.006 |
| 4.283 | 0.006 |
| 4.284 | 0.006 |
| 4.285 | 0.006 |
| 4.286 | 0.006 |
| 4.287 | 0.006 |
| 4.288 | 0.006 |
| 4.289 | 0.006 |
| 4.29 | 0.006 |
| 4.291 | 0.007 |
| 4.292 | 0.007 |
| 4.293 | 0.007 |
| 4.294 | 0.007 |
| 4.295 | 0.007 |
| 4.296 | 0.007 |
| 4.297 | 0.007 |
| 4.298 | 0.007 |
| 4.299 | 0.007 |
| 4.3 | 0.007 |
| 4.301 | 0.008 |
| 4.302 | 0.008 |
| 4.303 | 0.008 |
| 4.304 | 0.008 |
| 4.305 | 0.008 |
| 4.306 | 0.008 |
| 4.307 | 0.008 |
| 4.308 | 0.008 |
| 4.309 | 0.008 |
| 4.31 | 0.009 |
| 4.311 | 0.009 |
| 4.312 | 0.009 |
| 4.313 | 0.009 |
| 4.314 | 0.009 |
| 4.315 | 0.009 |
| 4.316 | 0.009 |
| 4.317 | 0.009 |
| 4.318 | 0.01 |
| 4.319 | 0.01 |
| 4.32 | 0.01 |
| 4.321 | 0.01 |
| 4.322 | 0.01 |
| 4.323 | 0.01 |
| 4.324 | 0.01 |
| 4.325 | 0.011 |
| 4.326 | 0.011 |
| 4.327 | 0.011 |
| 4.328 | 0.011 |
| 4.329 | 0.011 |
| 4.33 | 0.011 |
| 4.331 | 0.011 |
| 4.332 | 0.012 |
| 4.333 | 0.012 |
| 4.334 | 0.012 |
| 4.335 | 0.012 |
| 4.336 | 0.012 |
| 4.337 | 0.012 |
| 4.338 | 0.012 |
| 4.339 | 0.013 |
| 4.34 | 0.013 |
| 4.341 | 0.013 |
| 4.342 | 0.013 |
| 4.343 | 0.013 |
| 4.344 | 0.014 |
| 4.345 | 0.014 |
| 4.346 | 0.014 |
| 4.347 | 0.014 |
| 4.348 | 0.014 |
| 4.349 | 0.014 |
| 4.35 | 0.015 |
| 4.351 | 0.015 |
| 4.352 | 0.015 |
| 4.353 | 0.015 |
| 4.354 | 0.015 |
| 4.355 | 0.016 |
| 4.356 | 0.016 |
| 4.357 | 0.016 |
| 4.358 | 0.016 |
| 4.359 | 0.016 |
| 4.36 | 0.017 |
| 4.361 | 0.017 |
| 4.362 | 0.017 |
| 4.363 | 0.017 |
| 4.364 | 0.018 |
| 4.365 | 0.018 |
| 4.366 | 0.018 |
| 4.367 | 0.018 |
| 4.368 | 0.018 |
| 4.369 | 0.019 |
| 4.37 | 0.019 |
| 4.371 | 0.019 |
| 4.372 | 0.019 |
| 4.373 | 0.02 |
| 4.374 | 0.02 |
| 4.375 | 0.02 |
| 4.376 | 0.02 |
| 4.377 | 0.021 |
| 4.378 | 0.021 |
| 4.379 | 0.021 |
| 4.38 | 0.021 |
| 4.381 | 0.022 |
| 4.382 | 0.022 |
| 4.383 | 0.022 |
| 4.384 | 0.022 |
| 4.385 | 0.023 |
| 4.386 | 0.023 |
| 4.387 | 0.023 |
| 4.388 | 0.024 |
| 4.389 | 0.024 |
| 4.39 | 0.024 |
| 4.391 | 0.025 |
| 4.392 | 0.025 |
| 4.393 | 0.025 |
| 4.394 | 0.025 |
| 4.395 | 0.026 |
| 4.396 | 0.026 |
| 4.397 | 0.026 |
| 4.398 | 0.027 |
| 4.399 | 0.027 |
| 4.4 | 0.027 |
| 4.401 | 0.028 |
| 4.402 | 0.028 |
| 4.403 | 0.028 |
| 4.404 | 0.029 |
| 4.405 | 0.029 |
| 4.406 | 0.029 |
| 4.407 | 0.03 |
| 4.408 | 0.03 |
| 4.409 | 0.03 |
| 4.41 | 0.031 |
| 4.411 | 0.031 |
| 4.412 | 0.032 |
| 4.413 | 0.032 |
| 4.414 | 0.032 |
| 4.415 | 0.033 |
| 4.416 | 0.033 |
| 4.417 | 0.033 |
| 4.418 | 0.034 |
| 4.419 | 0.034 |
| 4.42 | 0.035 |
| 4.421 | 0.035 |
| 4.422 | 0.035 |
| 4.423 | 0.036 |
| 4.424 | 0.036 |
| 4.425 | 0.037 |
| 4.426 | 0.037 |
| 4.427 | 0.038 |
| 4.428 | 0.038 |
| 4.429 | 0.038 |
| 4.43 | 0.039 |
| 4.431 | 0.039 |
| 4.432 | 0.04 |
| 4.433 | 0.04 |
| 4.434 | 0.041 |
| 4.435 | 0.041 |
| 4.436 | 0.042 |
| 4.437 | 0.042 |
| 4.438 | 0.042 |
| 4.439 | 0.043 |
| 4.44 | 0.043 |
| 4.441 | 0.044 |
| 4.442 | 0.044 |
| 4.443 | 0.045 |
| 4.444 | 0.045 |
| 4.445 | 0.046 |
| 4.446 | 0.046 |
| 4.447 | 0.047 |
| 4.448 | 0.047 |
| 4.449 | 0.048 |
| 4.45 | 0.049 |
| 4.451 | 0.049 |
| 4.452 | 0.05 |
| 4.453 | 0.05 |
| 4.454 | 0.051 |
| 4.455 | 0.051 |
| 4.456 | 0.052 |
| 4.457 | 0.052 |
| 4.458 | 0.053 |
| 4.459 | 0.054 |
| 4.46 | 0.054 |
| 4.461 | 0.055 |
| 4.462 | 0.055 |
| 4.463 | 0.056 |
| 4.464 | 0.057 |
| 4.465 | 0.057 |
| 4.466 | 0.058 |
| 4.467 | 0.058 |
| 4.468 | 0.059 |
| 4.469 | 0.06 |
| 4.47 | 0.06 |
| 4.471 | 0.061 |
| 4.472 | 0.062 |
| 4.473 | 0.062 |
| 4.474 | 0.063 |
| 4.475 | 0.064 |
| 4.476 | 0.064 |
| 4.477 | 0.065 |
| 4.478 | 0.066 |
| 4.479 | 0.066 |
| 4.48 | 0.067 |
| 4.481 | 0.068 |
| 4.482 | 0.068 |
| 4.483 | 0.069 |
| 4.484 | 0.07 |
| 4.485 | 0.07 |
| 4.486 | 0.071 |
| 4.487 | 0.072 |
| 4.488 | 0.073 |
| 4.489 | 0.073 |
| 4.49 | 0.074 |
| 4.491 | 0.075 |
| 4.492 | 0.076 |
| 4.493 | 0.076 |
| 4.494 | 0.077 |
| 4.495 | 0.078 |
| 4.496 | 0.079 |
| 4.497 | 0.08 |
| 4.498 | 0.08 |
| 4.499 | 0.081 |
| 4.5 | 0.082 |
| 4.501 | 0.083 |
| 4.502 | 0.084 |
| 4.503 | 0.085 |
| 4.504 | 0.085 |
| 4.505 | 0.086 |
| 4.506 | 0.087 |
| 4.507 | 0.088 |
| 4.508 | 0.089 |
| 4.509 | 0.09 |
| 4.51 | 0.091 |
| 4.511 | 0.092 |
| 4.512 | 0.092 |
| 4.513 | 0.093 |
| 4.514 | 0.094 |
| 4.515 | 0.095 |
| 4.516 | 0.096 |
| 4.517 | 0.097 |
| 4.518 | 0.098 |
| 4.519 | 0.099 |
| 4.52 | 0.1 |
| 4.521 | 0.101 |
| 4.522 | 0.102 |
| 4.523 | 0.103 |
| 4.524 | 0.104 |
| 4.525 | 0.105 |
| 4.526 | 0.106 |
| 4.527 | 0.107 |
| 4.528 | 0.108 |
| 4.529 | 0.109 |
| 4.53 | 0.11 |
| 4.531 | 0.111 |
| 4.532 | 0.112 |
| 4.533 | 0.113 |
| 4.534 | 0.114 |
| 4.535 | 0.115 |
| 4.536 | 0.116 |
| 4.537 | 0.117 |
| 4.538 | 0.118 |
| 4.539 | 0.119 |
| 4.54 | 0.121 |
| 4.541 | 0.122 |
| 4.542 | 0.123 |
| 4.543 | 0.124 |
| 4.544 | 0.125 |
| 4.545 | 0.126 |
| 4.546 | 0.127 |
| 4.547 | 0.128 |
| 4.548 | 0.13 |
| 4.549 | 0.131 |
| 4.55 | 0.132 |
| 4.551 | 0.133 |
| 4.552 | 0.134 |
| 4.553 | 0.136 |
| 4.554 | 0.137 |
| 4.555 | 0.138 |
| 4.556 | 0.139 |
| 4.557 | 0.141 |
| 4.558 | 0.142 |
| 4.559 | 0.143 |
| 4.56 | 0.144 |
| 4.561 | 0.146 |
| 4.562 | 0.147 |
| 4.563 | 0.148 |
| 4.564 | 0.149 |
| 4.565 | 0.151 |
| 4.566 | 0.152 |
| 4.567 | 0.153 |
| 4.568 | 0.155 |
| 4.569 | 0.156 |
| 4.57 | 0.157 |
| 4.571 | 0.159 |
| 4.572 | 0.16 |
| 4.573 | 0.161 |
| 4.574 | 0.163 |
| 4.575 | 0.164 |
| 4.576 | 0.166 |
| 4.577 | 0.167 |
| 4.578 | 0.168 |
| 4.579 | 0.17 |
| 4.58 | 0.171 |
| 4.581 | 0.173 |
| 4.582 | 0.174 |
| 4.583 | 0.176 |
| 4.584 | 0.177 |
| 4.585 | 0.179 |
| 4.586 | 0.18 |
| 4.587 | 0.182 |
| 4.588 | 0.183 |
| 4.589 | 0.185 |
| 4.59 | 0.186 |
| 4.591 | 0.188 |
| 4.592 | 0.189 |
| 4.593 | 0.191 |
| 4.594 | 0.192 |
| 4.595 | 0.194 |
| 4.596 | 0.196 |
| 4.597 | 0.197 |
| 4.598 | 0.199 |
| 4.599 | 0.2 |
| 4.6 | 0.202 |
| 4.601 | 0.204 |
| 4.602 | 0.205 |
| 4.603 | 0.207 |
| 4.604 | 0.208 |
| 4.605 | 0.21 |
| 4.606 | 0.212 |
| 4.607 | 0.213 |
| 4.608 | 0.215 |
| 4.609 | 0.217 |
| 4.61 | 0.218 |
| 4.611 | 0.22 |
| 4.612 | 0.222 |
| 4.613 | 0.224 |
| 4.614 | 0.225 |
| 4.615 | 0.227 |
| 4.616 | 0.229 |
| 4.617 | 0.231 |
| 4.618 | 0.232 |
| 4.619 | 0.234 |
| 4.62 | 0.236 |
| 4.621 | 0.238 |
| 4.622 | 0.24 |
| 4.623 | 0.241 |
| 4.624 | 0.243 |
| 4.625 | 0.245 |
| 4.626 | 0.247 |
| 4.627 | 0.249 |
| 4.628 | 0.251 |
| 4.628999999999999 | 0.252 |
| 4.63 | 0.254 |
| 4.631 | 0.256 |
| 4.632 | 0.258 |
| 4.633 | 0.26 |
| 4.634 | 0.262 |
| 4.635 | 0.264 |
| 4.636 | 0.266 |
| 4.636999999999999 | 0.268 |
| 4.638 | 0.27 |
| 4.639 | 0.272 |
| 4.64 | 0.274 |
| 4.641 | 0.276 |
| 4.642 | 0.278 |
| 4.643 | 0.28 |
| 4.644 | 0.282 |
| 4.644999999999999 | 0.284 |
| 4.646 | 0.286 |
| 4.647 | 0.288 |
| 4.648 | 0.29 |
| 4.649 | 0.292 |
| 4.65 | 0.294 |
| 4.651 | 0.296 |
| 4.652 | 0.298 |
| 4.652999999999999 | 0.3 |
| 4.654 | 0.302 |
| 4.655 | 0.304 |
| 4.656 | 0.306 |
| 4.657 | 0.308 |
| 4.658 | 0.31 |
| 4.659 | 0.313 |
| 4.66 | 0.315 |
| 4.660999999999999 | 0.317 |
| 4.662 | 0.319 |
| 4.663 | 0.321 |
| 4.664 | 0.323 |
| 4.665 | 0.326 |
| 4.666 | 0.328 |
| 4.667 | 0.33 |
| 4.668 | 0.332 |
| 4.668999999999999 | 0.334 |
| 4.67 | 0.337 |
| 4.671 | 0.339 |
| 4.672 | 0.341 |
| 4.673 | 0.343 |
| 4.674 | 0.346 |
| 4.675 | 0.348 |
| 4.676 | 0.35 |
| 4.677 | 0.352 |
| 4.678 | 0.355 |
| 4.679 | 0.357 |
| 4.68 | 0.359 |
| 4.681 | 0.361 |
| 4.682 | 0.364 |
| 4.683 | 0.366 |
| 4.684 | 0.368 |
| 4.685 | 0.371 |
| 4.686 | 0.373 |
| 4.687 | 0.375 |
| 4.688 | 0.378 |
| 4.689 | 0.38 |
| 4.69 | 0.383 |
| 4.691 | 0.385 |
| 4.692 | 0.387 |
| 4.693 | 0.39 |
| 4.694 | 0.392 |
| 4.695 | 0.394 |
| 4.696 | 0.397 |
| 4.697 | 0.399 |
| 4.698 | 0.402 |
| 4.699 | 0.404 |
| 4.7 | 0.407 |
| 4.701 | 0.409 |
| 4.702 | 0.411 |
| 4.703 | 0.414 |
| 4.704 | 0.416 |
| 4.705 | 0.419 |
| 4.706 | 0.421 |
| 4.707 | 0.424 |
| 4.708 | 0.426 |
| 4.709 | 0.429 |
| 4.71 | 0.431 |
| 4.711 | 0.434 |
| 4.712 | 0.436 |
| 4.713 | 0.439 |
| 4.714 | 0.441 |
| 4.715 | 0.444 |
| 4.716 | 0.446 |
| 4.717 | 0.449 |
| 4.718 | 0.451 |
| 4.719 | 0.454 |
| 4.72 | 0.457 |
| 4.721 | 0.459 |
| 4.722 | 0.462 |
| 4.723 | 0.464 |
| 4.724 | 0.467 |
| 4.725 | 0.469 |
| 4.726 | 0.472 |
| 4.727 | 0.475 |
| 4.728 | 0.477 |
| 4.729 | 0.48 |
| 4.73 | 0.482 |
| 4.731 | 0.485 |
| 4.732 | 0.488 |
| 4.733 | 0.49 |
| 4.734 | 0.493 |
| 4.735 | 0.495 |
| 4.736 | 0.498 |
| 4.737 | 0.501 |
| 4.738 | 0.503 |
| 4.739 | 0.506 |
| 4.74 | 0.509 |
| 4.741 | 0.511 |
| 4.742 | 0.514 |
| 4.743 | 0.517 |
| 4.744 | 0.519 |
| 4.745 | 0.522 |
| 4.746 | 0.525 |
| 4.747 | 0.527 |
| 4.748 | 0.53 |
| 4.749 | 0.533 |
| 4.75 | 0.535 |
| 4.751 | 0.538 |
| 4.752 | 0.541 |
| 4.753 | 0.543 |
| 4.753999999999999 | 0.546 |
| 4.755 | 0.549 |
| 4.756 | 0.551 |
| 4.757 | 0.554 |
| 4.758 | 0.557 |
| 4.759 | 0.559 |
| 4.76 | 0.562 |
| 4.761 | 0.565 |
| 4.761999999999999 | 0.568 |
| 4.763 | 0.57 |
| 4.764 | 0.573 |
| 4.765 | 0.576 |
| 4.766 | 0.578 |
| 4.767 | 0.581 |
| 4.768 | 0.584 |
| 4.769 | 0.586 |
| 4.769999999999999 | 0.589 |
| 4.771 | 0.592 |
| 4.772 | 0.595 |
| 4.773 | 0.597 |
| 4.774 | 0.6 |
| 4.775 | 0.603 |
| 4.776 | 0.605 |
| 4.777 | 0.608 |
| 4.778 | 0.611 |
| 4.779 | 0.614 |
| 4.78 | 0.616 |
| 4.781 | 0.619 |
| 4.782 | 0.622 |
| 4.783 | 0.624 |
| 4.784 | 0.627 |
| 4.785 | 0.63 |
| 4.786 | 0.633 |
| 4.787 | 0.635 |
| 4.788 | 0.638 |
| 4.789 | 0.641 |
| 4.79 | 0.643 |
| 4.791 | 0.646 |
| 4.792 | 0.649 |
| 4.793 | 0.651 |
| 4.794 | 0.654 |
| 4.795 | 0.657 |
| 4.796 | 0.66 |
| 4.797 | 0.662 |
| 4.798 | 0.665 |
| 4.799 | 0.668 |
| 4.8 | 0.67 |
| 4.801 | 0.673 |
| 4.802 | 0.676 |
| 4.803 | 0.678 |
| 4.804 | 0.681 |
| 4.805 | 0.684 |
| 4.806 | 0.686 |
| 4.807 | 0.689 |
| 4.808 | 0.692 |
| 4.809 | 0.694 |
| 4.81 | 0.697 |
| 4.811 | 0.7 |
| 4.812 | 0.702 |
| 4.813 | 0.705 |
| 4.814 | 0.708 |
| 4.815 | 0.71 |
| 4.816 | 0.713 |
| 4.817 | 0.715 |
| 4.818 | 0.718 |
| 4.819 | 0.721 |
| 4.82 | 0.723 |
| 4.821 | 0.726 |
| 4.822 | 0.728 |
| 4.823 | 0.731 |
| 4.824 | 0.734 |
| 4.825 | 0.736 |
| 4.826 | 0.739 |
| 4.827 | 0.741 |
| 4.828 | 0.744 |
| 4.829 | 0.746 |
| 4.83 | 0.749 |
| 4.831 | 0.752 |
| 4.832 | 0.754 |
| 4.833 | 0.757 |
| 4.834 | 0.759 |
| 4.835 | 0.762 |
| 4.836 | 0.764 |
| 4.837 | 0.767 |
| 4.838 | 0.769 |
| 4.839 | 0.772 |
| 4.84 | 0.774 |
| 4.841 | 0.777 |
| 4.842 | 0.779 |
| 4.843 | 0.782 |
| 4.844 | 0.784 |
| 4.845 | 0.786 |
| 4.846 | 0.789 |
| 4.847 | 0.791 |
| 4.848 | 0.794 |
| 4.849 | 0.796 |
| 4.85 | 0.799 |
| 4.851 | 0.801 |
| 4.852 | 0.803 |
| 4.853 | 0.806 |
| 4.854 | 0.808 |
| 4.855 | 0.81 |
| 4.856 | 0.813 |
| 4.857 | 0.815 |
| 4.858 | 0.817 |
| 4.859 | 0.82 |
| 4.86 | 0.822 |
| 4.861 | 0.824 |
| 4.862 | 0.827 |
| 4.863 | 0.829 |
| 4.864 | 0.831 |
| 4.865 | 0.833 |
| 4.866 | 0.836 |
| 4.867 | 0.838 |
| 4.868 | 0.84 |
| 4.869 | 0.842 |
| 4.87 | 0.845 |
| 4.871 | 0.847 |
| 4.872 | 0.849 |
| 4.873 | 0.851 |
| 4.874 | 0.853 |
| 4.875 | 0.855 |
| 4.876 | 0.857 |
| 4.877 | 0.86 |
| 4.878 | 0.862 |
| 4.879 | 0.864 |
| 4.88 | 0.866 |
| 4.881 | 0.868 |
| 4.882 | 0.87 |
| 4.883 | 0.872 |
| 4.884 | 0.874 |
| 4.885 | 0.876 |
| 4.886 | 0.878 |
| 4.887 | 0.88 |
| 4.888 | 0.882 |
| 4.889 | 0.884 |
| 4.89 | 0.886 |
| 4.891 | 0.888 |
| 4.892 | 0.89 |
| 4.893 | 0.892 |
| 4.894 | 0.894 |
| 4.895 | 0.896 |
| 4.896 | 0.897 |
| 4.897 | 0.899 |
| 4.898 | 0.901 |
| 4.899 | 0.903 |
| 4.9 | 0.905 |
| 4.901 | 0.907 |
| 4.902 | 0.908 |
| 4.903 | 0.91 |
| 4.904 | 0.912 |
| 4.905 | 0.914 |
| 4.906 | 0.915 |
| 4.907 | 0.917 |
| 4.908 | 0.919 |
| 4.909 | 0.921 |
| 4.91 | 0.922 |
| 4.911 | 0.924 |
| 4.912 | 0.925 |
| 4.913 | 0.927 |
| 4.914 | 0.929 |
| 4.915 | 0.93 |
| 4.916 | 0.932 |
| 4.917 | 0.933 |
| 4.918 | 0.935 |
| 4.919 | 0.936 |
| 4.92 | 0.938 |
| 4.921 | 0.939 |
| 4.922 | 0.941 |
| 4.923 | 0.942 |
| 4.924 | 0.944 |
| 4.925 | 0.945 |
| 4.926 | 0.947 |
| 4.927 | 0.948 |
| 4.928 | 0.949 |
| 4.929 | 0.951 |
| 4.93 | 0.952 |
| 4.931 | 0.954 |
| 4.932 | 0.955 |
| 4.933 | 0.956 |
| 4.934 | 0.957 |
| 4.935 | 0.959 |
| 4.936 | 0.96 |
| 4.937 | 0.961 |
| 4.938 | 0.962 |
| 4.939 | 0.963 |
| 4.94 | 0.965 |
| 4.941 | 0.966 |
| 4.942 | 0.967 |
| 4.943 | 0.968 |
| 4.944 | 0.969 |
| 4.945 | 0.97 |
| 4.946 | 0.971 |
| 4.947 | 0.972 |
| 4.948 | 0.973 |
| 4.949 | 0.974 |
| 4.95 | 0.975 |
| 4.951 | 0.976 |
| 4.952 | 0.977 |
| 4.953 | 0.978 |
| 4.954 | 0.979 |
| 4.955 | 0.98 |
| 4.956 | 0.981 |
| 4.957 | 0.982 |
| 4.958 | 0.983 |
| 4.959 | 0.983 |
| 4.96 | 0.984 |
| 4.961 | 0.985 |
| 4.962 | 0.986 |
| 4.963 | 0.986 |
| 4.964 | 0.987 |
| 4.965 | 0.988 |
| 4.966 | 0.989 |
| 4.967 | 0.989 |
| 4.968 | 0.99 |
| 4.969 | 0.99 |
| 4.97 | 0.991 |
| 4.971 | 0.992 |
| 4.972 | 0.992 |
| 4.973 | 0.993 |
| 4.974 | 0.993 |
| 4.975 | 0.994 |
| 4.976 | 0.994 |
| 4.977 | 0.995 |
| 4.978 | 0.995 |
| 4.979 | 0.996 |
| 4.98 | 0.996 |
| 4.981 | 0.996 |
| 4.982 | 0.997 |
| 4.983 | 0.997 |
| 4.984 | 0.997 |
| 4.985 | 0.998 |
| 4.986 | 0.998 |
| 4.987 | 0.998 |
| 4.988 | 0.999 |
| 4.989 | 0.999 |
| 4.99 | 0.999 |
| 4.991 | 0.999 |
| 4.992 | 0.999 |
| 4.993 | 1 |
| 4.994 | 1 |
| 4.995 | 1 |
| 4.996 | 1 |
| 4.997 | 1 |
| 4.998 | 1 |
| 4.999 | 1 |
| 5.0 | 1 |
| 5.001 | 1 |
| 5.002 | 1 |
| 5.003 | 1 |
| 5.004 | 1 |
| 5.005 | 1 |
| 5.006 | 1 |
| 5.007 | 1 |
| 5.008 | 0.999 |
| 5.009 | 0.999 |
| 5.01 | 0.999 |
| 5.011 | 0.999 |
| 5.012 | 0.999 |
| 5.013 | 0.998 |
| 5.014 | 0.998 |
| 5.015 | 0.998 |
| 5.016 | 0.997 |
| 5.017 | 0.997 |
| 5.018 | 0.997 |
| 5.019 | 0.996 |
| 5.02 | 0.996 |
| 5.021 | 0.996 |
| 5.022 | 0.995 |
| 5.023 | 0.995 |
| 5.024 | 0.994 |
| 5.025 | 0.994 |
| 5.026 | 0.993 |
| 5.027 | 0.993 |
| 5.028 | 0.992 |
| 5.029 | 0.992 |
| 5.03 | 0.991 |
| 5.031 | 0.99 |
| 5.032 | 0.99 |
| 5.033 | 0.989 |
| 5.034 | 0.989 |
| 5.035 | 0.988 |
| 5.036 | 0.987 |
| 5.037 | 0.986 |
| 5.038 | 0.986 |
| 5.039 | 0.985 |
| 5.04 | 0.984 |
| 5.041 | 0.983 |
| 5.042 | 0.983 |
| 5.043 | 0.982 |
| 5.044 | 0.981 |
| 5.045 | 0.98 |
| 5.046 | 0.979 |
| 5.047 | 0.978 |
| 5.048 | 0.977 |
| 5.049 | 0.976 |
| 5.05 | 0.975 |
| 5.051 | 0.974 |
| 5.052 | 0.973 |
| 5.053 | 0.972 |
| 5.054 | 0.971 |
| 5.055 | 0.97 |
| 5.056 | 0.969 |
| 5.057 | 0.968 |
| 5.058 | 0.967 |
| 5.059 | 0.966 |
| 5.06 | 0.965 |
| 5.061 | 0.963 |
| 5.062 | 0.962 |
| 5.063 | 0.961 |
| 5.064 | 0.96 |
| 5.065 | 0.959 |
| 5.066 | 0.957 |
| 5.067 | 0.956 |
| 5.068 | 0.955 |
| 5.069 | 0.954 |
| 5.07 | 0.952 |
| 5.071 | 0.951 |
| 5.072 | 0.949 |
| 5.073 | 0.948 |
| 5.074 | 0.947 |
| 5.075 | 0.945 |
| 5.076 | 0.944 |
| 5.077 | 0.942 |
| 5.078 | 0.941 |
| 5.079 | 0.939 |
| 5.08 | 0.938 |
| 5.081 | 0.936 |
| 5.082 | 0.935 |
| 5.083 | 0.933 |
| 5.084 | 0.932 |
| 5.085 | 0.93 |
| 5.086 | 0.929 |
| 5.087 | 0.927 |
| 5.088 | 0.925 |
| 5.089 | 0.924 |
| 5.09 | 0.922 |
| 5.091 | 0.921 |
| 5.092 | 0.919 |
| 5.093 | 0.917 |
| 5.094 | 0.915 |
| 5.095 | 0.914 |
| 5.096 | 0.912 |
| 5.097 | 0.91 |
| 5.098 | 0.908 |
| 5.099 | 0.907 |
| 5.1 | 0.905 |
| 5.101 | 0.903 |
| 5.102 | 0.901 |
| 5.103 | 0.899 |
| 5.104 | 0.897 |
| 5.105 | 0.896 |
| 5.106 | 0.894 |
| 5.107 | 0.892 |
| 5.108 | 0.89 |
| 5.109 | 0.888 |
| 5.11 | 0.886 |
| 5.111 | 0.884 |
| 5.112 | 0.882 |
| 5.113 | 0.88 |
| 5.114 | 0.878 |
| 5.115 | 0.876 |
| 5.116 | 0.874 |
| 5.117 | 0.872 |
| 5.118 | 0.87 |
| 5.119 | 0.868 |
| 5.12 | 0.866 |
| 5.121 | 0.864 |
| 5.122 | 0.862 |
| 5.123 | 0.86 |
| 5.124 | 0.857 |
| 5.125 | 0.855 |
| 5.126 | 0.853 |
| 5.127 | 0.851 |
| 5.128 | 0.849 |
| 5.129 | 0.847 |
| 5.13 | 0.845 |
| 5.131 | 0.842 |
| 5.132 | 0.84 |
| 5.133 | 0.838 |
| 5.134 | 0.836 |
| 5.135 | 0.833 |
| 5.136 | 0.831 |
| 5.137 | 0.829 |
| 5.138 | 0.827 |
| 5.139 | 0.824 |
| 5.14 | 0.822 |
| 5.141 | 0.82 |
| 5.142 | 0.817 |
| 5.143 | 0.815 |
| 5.144 | 0.813 |
| 5.145 | 0.81 |
| 5.146 | 0.808 |
| 5.147 | 0.806 |
| 5.148 | 0.803 |
| 5.149 | 0.801 |
| 5.15 | 0.799 |
| 5.151 | 0.796 |
| 5.152 | 0.794 |
| 5.153 | 0.791 |
| 5.154 | 0.789 |
| 5.155 | 0.786 |
| 5.156 | 0.784 |
| 5.157 | 0.782 |
| 5.158 | 0.779 |
| 5.159 | 0.777 |
| 5.16 | 0.774 |
| 5.161 | 0.772 |
| 5.162 | 0.769 |
| 5.163 | 0.767 |
| 5.164 | 0.764 |
| 5.165 | 0.762 |
| 5.166 | 0.759 |
| 5.167 | 0.757 |
| 5.168 | 0.754 |
| 5.169 | 0.752 |
| 5.17 | 0.749 |
| 5.171 | 0.746 |
| 5.172 | 0.744 |
| 5.173 | 0.741 |
| 5.174 | 0.739 |
| 5.175 | 0.736 |
| 5.176 | 0.734 |
| 5.177 | 0.731 |
| 5.178 | 0.728 |
| 5.179 | 0.726 |
| 5.18 | 0.723 |
| 5.181 | 0.721 |
| 5.182 | 0.718 |
| 5.183 | 0.715 |
| 5.184 | 0.713 |
| 5.185 | 0.71 |
| 5.186 | 0.708 |
| 5.187 | 0.705 |
| 5.188 | 0.702 |
| 5.189 | 0.7 |
| 5.19 | 0.697 |
| 5.191 | 0.694 |
| 5.192 | 0.692 |
| 5.193 | 0.689 |
| 5.194 | 0.686 |
| 5.195 | 0.684 |
| 5.196 | 0.681 |
| 5.197 | 0.678 |
| 5.198 | 0.676 |
| 5.199 | 0.673 |
| 5.2 | 0.67 |
| 5.201 | 0.668 |
| 5.202 | 0.665 |
| 5.203 | 0.662 |
| 5.204 | 0.66 |
| 5.205 | 0.657 |
| 5.206 | 0.654 |
| 5.207 | 0.651 |
| 5.208 | 0.649 |
| 5.209 | 0.646 |
| 5.21 | 0.643 |
| 5.211 | 0.641 |
| 5.212 | 0.638 |
| 5.213 | 0.635 |
| 5.214 | 0.633 |
| 5.215 | 0.63 |
| 5.216 | 0.627 |
| 5.217 | 0.624 |
| 5.218 | 0.622 |
| 5.219 | 0.619 |
| 5.22 | 0.616 |
| 5.221 | 0.614 |
| 5.222 | 0.611 |
| 5.223 | 0.608 |
| 5.224 | 0.605 |
| 5.225 | 0.603 |
| 5.226 | 0.6 |
| 5.227 | 0.597 |
| 5.228 | 0.595 |
| 5.229 | 0.592 |
| 5.23 | 0.589 |
| 5.231 | 0.586 |
| 5.232 | 0.584 |
| 5.233 | 0.581 |
| 5.234 | 0.578 |
| 5.235 | 0.576 |
| 5.236 | 0.573 |
| 5.237 | 0.57 |
| 5.238 | 0.568 |
| 5.239 | 0.565 |
| 5.24 | 0.562 |
| 5.241 | 0.559 |
| 5.242 | 0.557 |
| 5.243 | 0.554 |
| 5.244 | 0.551 |
| 5.245 | 0.549 |
| 5.246 | 0.546 |
| 5.247 | 0.543 |
| 5.248 | 0.541 |
| 5.249 | 0.538 |
| 5.25 | 0.535 |
| 5.251 | 0.533 |
| 5.252 | 0.53 |
| 5.253 | 0.527 |
| 5.254 | 0.525 |
| 5.255 | 0.522 |
| 5.256 | 0.519 |
| 5.257 | 0.517 |
| 5.258 | 0.514 |
| 5.259 | 0.511 |
| 5.26 | 0.509 |
| 5.261 | 0.506 |
| 5.262 | 0.503 |
| 5.263 | 0.501 |
| 5.264 | 0.498 |
| 5.265 | 0.495 |
| 5.266 | 0.493 |
| 5.267 | 0.49 |
| 5.268 | 0.488 |
| 5.269 | 0.485 |
| 5.27 | 0.482 |
| 5.271 | 0.48 |
| 5.272 | 0.477 |
| 5.273 | 0.475 |
| 5.274 | 0.472 |
| 5.275 | 0.469 |
| 5.276 | 0.467 |
| 5.277 | 0.464 |
| 5.278 | 0.462 |
| 5.279 | 0.459 |
| 5.28 | 0.457 |
| 5.281 | 0.454 |
| 5.282 | 0.451 |
| 5.283 | 0.449 |
| 5.284 | 0.446 |
| 5.285 | 0.444 |
| 5.286 | 0.441 |
| 5.287 | 0.439 |
| 5.288 | 0.436 |
| 5.289 | 0.434 |
| 5.29 | 0.431 |
| 5.291 | 0.429 |
| 5.292 | 0.426 |
| 5.293 | 0.424 |
| 5.294 | 0.421 |
| 5.295 | 0.419 |
| 5.296 | 0.416 |
| 5.297 | 0.414 |
| 5.298 | 0.411 |
| 5.299 | 0.409 |
| 5.3 | 0.407 |
| 5.301 | 0.404 |
| 5.302 | 0.402 |
| 5.303 | 0.399 |
| 5.304 | 0.397 |
| 5.305 | 0.394 |
| 5.306 | 0.392 |
| 5.307 | 0.39 |
| 5.308 | 0.387 |
| 5.309 | 0.385 |
| 5.31 | 0.383 |
| 5.311 | 0.38 |
| 5.312 | 0.378 |
| 5.313 | 0.375 |
| 5.314 | 0.373 |
| 5.315 | 0.371 |
| 5.316 | 0.368 |
| 5.317 | 0.366 |
| 5.318 | 0.364 |
| 5.319 | 0.361 |
| 5.32 | 0.359 |
| 5.321 | 0.357 |
| 5.322 | 0.355 |
| 5.323 | 0.352 |
| 5.324 | 0.35 |
| 5.325 | 0.348 |
| 5.326 | 0.346 |
| 5.327 | 0.343 |
| 5.328 | 0.341 |
| 5.329 | 0.339 |
| 5.33 | 0.337 |
| 5.331 | 0.334 |
| 5.332 | 0.332 |
| 5.333 | 0.33 |
| 5.334 | 0.328 |
| 5.335 | 0.326 |
| 5.336 | 0.323 |
| 5.337 | 0.321 |
| 5.338 | 0.319 |
| 5.339 | 0.317 |
| 5.34 | 0.315 |
| 5.341 | 0.313 |
| 5.342 | 0.31 |
| 5.343 | 0.308 |
| 5.344 | 0.306 |
| 5.345 | 0.304 |
| 5.346 | 0.302 |
| 5.347 | 0.3 |
| 5.348 | 0.298 |
| 5.349 | 0.296 |
| 5.35 | 0.294 |
| 5.351 | 0.292 |
| 5.352 | 0.29 |
| 5.353 | 0.288 |
| 5.354 | 0.286 |
| 5.355 | 0.284 |
| 5.356 | 0.282 |
| 5.357 | 0.28 |
| 5.358 | 0.278 |
| 5.359 | 0.276 |
| 5.36 | 0.274 |
| 5.361 | 0.272 |
| 5.362 | 0.27 |
| 5.363 | 0.268 |
| 5.364 | 0.266 |
| 5.365 | 0.264 |
| 5.366 | 0.262 |
| 5.367 | 0.26 |
| 5.368 | 0.258 |
| 5.369 | 0.256 |
| 5.37 | 0.254 |
| 5.371 | 0.252 |
| 5.372 | 0.251 |
| 5.373 | 0.249 |
| 5.374 | 0.247 |
| 5.375 | 0.245 |
| 5.376 | 0.243 |
| 5.377 | 0.241 |
| 5.378 | 0.24 |
| 5.379 | 0.238 |
| 5.38 | 0.236 |
| 5.381 | 0.234 |
| 5.382 | 0.232 |
| 5.383 | 0.231 |
| 5.384 | 0.229 |
| 5.385 | 0.227 |
| 5.386 | 0.225 |
| 5.387 | 0.224 |
| 5.388 | 0.222 |
| 5.389 | 0.22 |
| 5.39 | 0.218 |
| 5.391 | 0.217 |
| 5.392 | 0.215 |
| 5.393 | 0.213 |
| 5.394 | 0.212 |
| 5.395 | 0.21 |
| 5.396 | 0.208 |
| 5.397 | 0.207 |
| 5.398 | 0.205 |
| 5.399 | 0.204 |
| 5.4 | 0.202 |
| 5.401 | 0.2 |
| 5.402 | 0.199 |
| 5.403 | 0.197 |
| 5.404 | 0.196 |
| 5.405 | 0.194 |
| 5.406 | 0.192 |
| 5.407 | 0.191 |
| 5.408 | 0.189 |
| 5.409 | 0.188 |
| 5.41 | 0.186 |
| 5.411 | 0.185 |
| 5.412 | 0.183 |
| 5.413 | 0.182 |
| 5.414 | 0.18 |
| 5.415 | 0.179 |
| 5.416 | 0.177 |
| 5.417 | 0.176 |
| 5.418 | 0.174 |
| 5.419 | 0.173 |
| 5.42 | 0.171 |
| 5.421 | 0.17 |
| 5.422 | 0.168 |
| 5.423 | 0.167 |
| 5.424 | 0.166 |
| 5.425 | 0.164 |
| 5.426 | 0.163 |
| 5.427 | 0.161 |
| 5.428 | 0.16 |
| 5.429 | 0.159 |
| 5.43 | 0.157 |
| 5.431 | 0.156 |
| 5.432 | 0.155 |
| 5.433 | 0.153 |
| 5.434 | 0.152 |
| 5.435 | 0.151 |
| 5.436 | 0.149 |
| 5.437 | 0.148 |
| 5.438 | 0.147 |
| 5.439 | 0.146 |
| 5.44 | 0.144 |
| 5.441 | 0.143 |
| 5.442 | 0.142 |
| 5.443 | 0.141 |
| 5.444 | 0.139 |
| 5.445 | 0.138 |
| 5.446 | 0.137 |
| 5.447 | 0.136 |
| 5.448 | 0.134 |
| 5.449 | 0.133 |
| 5.45 | 0.132 |
| 5.451 | 0.131 |
| 5.452 | 0.13 |
| 5.453 | 0.128 |
| 5.454 | 0.127 |
| 5.455 | 0.126 |
| 5.456 | 0.125 |
| 5.457 | 0.124 |
| 5.458 | 0.123 |
| 5.459 | 0.122 |
| 5.46 | 0.121 |
| 5.461 | 0.119 |
| 5.462 | 0.118 |
| 5.463 | 0.117 |
| 5.464 | 0.116 |
| 5.465 | 0.115 |
| 5.466 | 0.114 |
| 5.467 | 0.113 |
| 5.468 | 0.112 |
| 5.469 | 0.111 |
| 5.47 | 0.11 |
| 5.471 | 0.109 |
| 5.472 | 0.108 |
| 5.473 | 0.107 |
| 5.474 | 0.106 |
| 5.475 | 0.105 |
| 5.476 | 0.104 |
| 5.477 | 0.103 |
| 5.478 | 0.102 |
| 5.479 | 0.101 |
| 5.48 | 0.1 |
| 5.481 | 0.099 |
| 5.482 | 0.098 |
| 5.483 | 0.097 |
| 5.484 | 0.096 |
| 5.485 | 0.095 |
| 5.486 | 0.094 |
| 5.487 | 0.093 |
| 5.488 | 0.092 |
| 5.489 | 0.092 |
| 5.49 | 0.091 |
| 5.491 | 0.09 |
| 5.492 | 0.089 |
| 5.493 | 0.088 |
| 5.494 | 0.087 |
| 5.495 | 0.086 |
| 5.496 | 0.085 |
| 5.497 | 0.085 |
| 5.498 | 0.084 |
| 5.499 | 0.083 |
| 5.5 | 0.082 |
| 5.501 | 0.081 |
| 5.502 | 0.08 |
| 5.503 | 0.08 |
| 5.504 | 0.079 |
| 5.505 | 0.078 |
| 5.506 | 0.077 |
| 5.507 | 0.076 |
| 5.508 | 0.076 |
| 5.509 | 0.075 |
| 5.51 | 0.074 |
| 5.511 | 0.073 |
| 5.512 | 0.073 |
| 5.513 | 0.072 |
| 5.514 | 0.071 |
| 5.515 | 0.07 |
| 5.516 | 0.07 |
| 5.517 | 0.069 |
| 5.518 | 0.068 |
| 5.519 | 0.068 |
| 5.52 | 0.067 |
| 5.521 | 0.066 |
| 5.522 | 0.066 |
| 5.523 | 0.065 |
| 5.524 | 0.064 |
| 5.525 | 0.064 |
| 5.526 | 0.063 |
| 5.527 | 0.062 |
| 5.528 | 0.062 |
| 5.529 | 0.061 |
| 5.53 | 0.06 |
| 5.531 | 0.06 |
| 5.532 | 0.059 |
| 5.533 | 0.058 |
| 5.534 | 0.058 |
| 5.535 | 0.057 |
| 5.536 | 0.057 |
| 5.537 | 0.056 |
| 5.538 | 0.055 |
| 5.539 | 0.055 |
| 5.54 | 0.054 |
| 5.541 | 0.054 |
| 5.542 | 0.053 |
| 5.543 | 0.052 |
| 5.544 | 0.052 |
| 5.545 | 0.051 |
| 5.546 | 0.051 |
| 5.547 | 0.05 |
| 5.548 | 0.05 |
| 5.549 | 0.049 |
| 5.55 | 0.049 |
| 5.551 | 0.048 |
| 5.552 | 0.047 |
| 5.553 | 0.047 |
| 5.554 | 0.046 |
| 5.555 | 0.046 |
| 5.556 | 0.045 |
| 5.557 | 0.045 |
| 5.558 | 0.044 |
| 5.559 | 0.044 |
| 5.56 | 0.043 |
| 5.561 | 0.043 |
| 5.562 | 0.042 |
| 5.563 | 0.042 |
| 5.564 | 0.042 |
| 5.565 | 0.041 |
| 5.566 | 0.041 |
| 5.567 | 0.04 |
| 5.568 | 0.04 |
| 5.569 | 0.039 |
| 5.57 | 0.039 |
| 5.571 | 0.038 |
| 5.572 | 0.038 |
| 5.573 | 0.038 |
| 5.574 | 0.037 |
| 5.575 | 0.037 |
| 5.576 | 0.036 |
| 5.577 | 0.036 |
| 5.578 | 0.035 |
| 5.579 | 0.035 |
| 5.58 | 0.035 |
| 5.581 | 0.034 |
| 5.582 | 0.034 |
| 5.583 | 0.033 |
| 5.584 | 0.033 |
| 5.585 | 0.033 |
| 5.586 | 0.032 |
| 5.587 | 0.032 |
| 5.588 | 0.032 |
| 5.589 | 0.031 |
| 5.59 | 0.031 |
| 5.591 | 0.03 |
| 5.592 | 0.03 |
| 5.593 | 0.03 |
| 5.594 | 0.029 |
| 5.595 | 0.029 |
| 5.596 | 0.029 |
| 5.597 | 0.028 |
| 5.598 | 0.028 |
| 5.599 | 0.028 |
| 5.6 | 0.027 |
| 5.601 | 0.027 |
| 5.602 | 0.027 |
| 5.603 | 0.026 |
| 5.604 | 0.026 |
| 5.605 | 0.026 |
| 5.606 | 0.025 |
| 5.607 | 0.025 |
| 5.608 | 0.025 |
| 5.609 | 0.025 |
| 5.61 | 0.024 |
| 5.611 | 0.024 |
| 5.612 | 0.024 |
| 5.613 | 0.023 |
| 5.614 | 0.023 |
| 5.615 | 0.023 |
| 5.616 | 0.022 |
| 5.617 | 0.022 |
| 5.618 | 0.022 |
| 5.619 | 0.022 |
| 5.62 | 0.021 |
| 5.621 | 0.021 |
| 5.622 | 0.021 |
| 5.623 | 0.021 |
| 5.624 | 0.02 |
| 5.625 | 0.02 |
| 5.626 | 0.02 |
| 5.627 | 0.02 |
| 5.628 | 0.019 |
| 5.628999999999999 | 0.019 |
| 5.63 | 0.019 |
| 5.631 | 0.019 |
| 5.632 | 0.018 |
| 5.633 | 0.018 |
| 5.634 | 0.018 |
| 5.635 | 0.018 |
| 5.636 | 0.018 |
| 5.636999999999999 | 0.017 |
| 5.638 | 0.017 |
| 5.639 | 0.017 |
| 5.64 | 0.017 |
| 5.641 | 0.016 |
| 5.642 | 0.016 |
| 5.643 | 0.016 |
| 5.644 | 0.016 |
| 5.644999999999999 | 0.016 |
| 5.646 | 0.015 |
| 5.647 | 0.015 |
| 5.648 | 0.015 |
| 5.649 | 0.015 |
| 5.65 | 0.015 |
| 5.651 | 0.014 |
| 5.652 | 0.014 |
| 5.652999999999999 | 0.014 |
| 5.654 | 0.014 |
| 5.655 | 0.014 |
| 5.656 | 0.014 |
| 5.657 | 0.013 |
| 5.658 | 0.013 |
| 5.659 | 0.013 |
| 5.66 | 0.013 |
| 5.660999999999999 | 0.013 |
| 5.662 | 0.012 |
| 5.663 | 0.012 |
| 5.664 | 0.012 |
| 5.665 | 0.012 |
| 5.666 | 0.012 |
| 5.667 | 0.012 |
| 5.668 | 0.012 |
| 5.668999999999999 | 0.011 |
| 5.67 | 0.011 |
| 5.671 | 0.011 |
| 5.672 | 0.011 |
| 5.673 | 0.011 |
| 5.674 | 0.011 |
| 5.675 | 0.011 |
| 5.676 | 0.01 |
| 5.677 | 0.01 |
| 5.678 | 0.01 |
| 5.679 | 0.01 |
| 5.68 | 0.01 |
| 5.681 | 0.01 |
| 5.682 | 0.01 |
| 5.683 | 0.009 |
| 5.684 | 0.009 |
| 5.685 | 0.009 |
| 5.686 | 0.009 |
| 5.687 | 0.009 |
| 5.688 | 0.009 |
| 5.689 | 0.009 |
| 5.69 | 0.009 |
| 5.691 | 0.008 |
| 5.692 | 0.008 |
| 5.693 | 0.008 |
| 5.694 | 0.008 |
| 5.695 | 0.008 |
| 5.696 | 0.008 |
| 5.697 | 0.008 |
| 5.698 | 0.008 |
| 5.699 | 0.008 |
| 5.7 | 0.007 |
| 5.701 | 0.007 |
| 5.702 | 0.007 |
| 5.703 | 0.007 |
| 5.704 | 0.007 |
| 5.705 | 0.007 |
| 5.706 | 0.007 |
| 5.707 | 0.007 |
| 5.708 | 0.007 |
| 5.709 | 0.007 |
| 5.71 | 0.006 |
| 5.711 | 0.006 |
| 5.712 | 0.006 |
| 5.713 | 0.006 |
| 5.714 | 0.006 |
| 5.715 | 0.006 |
| 5.716 | 0.006 |
| 5.717 | 0.006 |
| 5.718 | 0.006 |
| 5.719 | 0.006 |
| 5.72 | 0.006 |
| 5.721 | 0.006 |
| 5.722 | 0.005 |
| 5.723 | 0.005 |
| 5.724 | 0.005 |
| 5.725 | 0.005 |
| 5.726 | 0.005 |
| 5.727 | 0.005 |
| 5.728 | 0.005 |
| 5.729 | 0.005 |
| 5.73 | 0.005 |
| 5.731 | 0.005 |
| 5.732 | 0.005 |
| 5.733 | 0.005 |
| 5.734 | 0.005 |
| 5.735 | 0.005 |
| 5.736 | 0.004 |
| 5.737 | 0.004 |
| 5.738 | 0.004 |
| 5.739 | 0.004 |
| 5.74 | 0.004 |
| 5.741 | 0.004 |
| 5.742 | 0.004 |
| 5.743 | 0.004 |
| 5.744 | 0.004 |
| 5.745 | 0.004 |
| 5.746 | 0.004 |
| 5.747 | 0.004 |
| 5.748 | 0.004 |
| 5.749 | 0.004 |
| 5.75 | 0.004 |
| 5.751 | 0.004 |
| 5.752 | 0.003 |
| 5.753 | 0.003 |
| 5.753999999999999 | 0.003 |
| 5.755 | 0.003 |
| 5.756 | 0.003 |
| 5.757 | 0.003 |
| 5.758 | 0.003 |
| 5.759 | 0.003 |
| 5.76 | 0.003 |
| 5.761 | 0.003 |
| 5.761999999999999 | 0.003 |
| 5.763 | 0.003 |
| 5.764 | 0.003 |
| 5.765 | 0.003 |
| 5.766 | 0.003 |
| 5.767 | 0.003 |
| 5.768 | 0.003 |
| 5.769 | 0.003 |
| 5.769999999999999 | 0.003 |
| 5.771 | 0.003 |
| 5.772 | 0.003 |
| 5.773 | 0.003 |
| 5.774 | 0.003 |
| 5.775 | 0.002 |
| 5.776 | 0.002 |
| 5.777 | 0.002 |
| 5.778 | 0.002 |
| 5.779 | 0.002 |
| 5.78 | 0.002 |
| 5.781 | 0.002 |
| 5.782 | 0.002 |
| 5.783 | 0.002 |
| 5.784 | 0.002 |
| 5.785 | 0.002 |
| 5.786 | 0.002 |
| 5.787 | 0.002 |
| 5.788 | 0.002 |
| 5.789 | 0.002 |
| 5.79 | 0.002 |
| 5.791 | 0.002 |
| 5.792 | 0.002 |
| 5.793 | 0.002 |
| 5.794 | 0.002 |
| 5.795 | 0.002 |
| 5.796 | 0.002 |
| 5.797 | 0.002 |
| 5.798 | 0.002 |
| 5.799 | 0.002 |
| 5.8 | 0.002 |
| 5.801 | 0.002 |
| 5.802 | 0.002 |
| 5.803 | 0.002 |
| 5.804 | 0.002 |
| 5.805 | 0.002 |
| 5.806 | 0.002 |
| 5.807 | 0.001 |
| 5.808 | 0.001 |
| 5.809 | 0.001 |
| 5.81 | 0.001 |
| 5.811 | 0.001 |
| 5.812 | 0.001 |
| 5.813 | 0.001 |
| 5.814 | 0.001 |
| 5.815 | 0.001 |
| 5.816 | 0.001 |
| 5.817 | 0.001 |
| 5.818 | 0.001 |
| 5.819 | 0.001 |
| 5.82 | 0.001 |
| 5.821 | 0.001 |
| 5.822 | 0.001 |
| 5.823 | 0.001 |
| 5.824 | 0.001 |
| 5.825 | 0.001 |
| 5.826 | 0.001 |
| 5.827 | 0.001 |
| 5.828 | 0.001 |
| 5.829 | 0.001 |
| 5.83 | 0.001 |
| 5.831 | 0.001 |
| 5.832 | 0.001 |
| 5.833 | 0.001 |
| 5.834 | 0.001 |
| 5.835 | 0.001 |
| 5.836 | 0.001 |
| 5.837 | 0.001 |
| 5.838 | 0.001 |
| 5.839 | 0.001 |
| 5.84 | 0.001 |
| 5.841 | 0.001 |
| 5.842 | 0.001 |
| 5.843 | 0.001 |
| 5.844 | 0.001 |
| 5.845 | 0.001 |
| 5.846 | 0.001 |
| 5.847 | 0.001 |
| 5.848 | 0.001 |
| 5.849 | 0.001 |
| 5.85 | 0.001 |
| 5.851 | 0.001 |
| 5.852 | 0.001 |
| 5.853 | 0.001 |
| 5.854 | 0.001 |
| 5.855 | 0.001 |
| 5.856 | 0.001 |
| 5.857 | 0.001 |
| 5.858 | 0.001 |
| 5.859 | 0.001 |
| 5.86 | 0.001 |
| 5.861 | 0.001 |
| 5.862 | 0.001 |
| 5.863 | 0.001 |
| 5.864 | 0.001 |
| 5.865 | 0.001 |
| 5.866 | 0.001 |
| 5.867 | 0.001 |
| 5.868 | 0.001 |
| 5.869 | 0.001 |
| 5.87 | 0.001 |
| 5.871 | 0.001 |
| 5.872 | 0 |
| 5.873 | 0 |
| 5.874 | 0 |
| 5.875 | 0 |
| 5.876 | 0 |
| 5.877 | 0 |
| 5.878 | 0 |
| 5.879 | 0 |
| 5.88 | 0 |
| 5.881 | 0 |
| 5.882 | 0 |
| 5.883 | 0 |
| 5.884 | 0 |
| 5.885 | 0 |
| 5.886 | 0 |
| 5.887 | 0 |
| 5.888 | 0 |
| 5.889 | 0 |
| 5.89 | 0 |
| 5.891 | 0 |
| 5.892 | 0 |
| 5.893 | 0 |
| 5.894 | 0 |
| 5.895 | 0 |
| 5.896 | 0 |
| 5.897 | 0 |
| 5.898 | 0 |
| 5.899 | 0 |
| 5.9 | 0 |
| 5.901 | 0 |
| 5.902 | 0 |
| 5.903 | 0 |
| 5.904 | 0 |
| 5.905 | 0 |
| 5.906 | 0 |
| 5.907 | 0 |
| 5.908 | 0 |
| 5.909 | 0 |
| 5.91 | 0 |
| 5.911 | 0 |
| 5.912 | 0 |
| 5.913 | 0 |
| 5.914 | 0 |
| 5.915 | 0 |
| 5.916 | 0 |
| 5.917 | 0 |
| 5.918 | 0 |
| 5.919 | 0 |
| 5.92 | 0 |
| 5.921 | 0 |
| 5.922 | 0 |
| 5.923 | 0 |
| 5.924 | 0 |
| 5.925 | 0 |
| 5.926 | 0 |
| 5.927 | 0 |
| 5.928 | 0 |
| 5.929 | 0 |
| 5.93 | 0 |
| 5.931 | 0 |
| 5.932 | 0 |
| 5.933 | 0 |
| 5.934 | 0 |
| 5.935 | 0 |
| 5.936 | 0 |
| 5.937 | 0 |
| 5.938 | 0 |
| 5.939 | 0 |
| 5.94 | 0 |
| 5.941 | 0 |
| 5.942 | 0 |
| 5.943 | 0 |
| 5.944 | 0 |
| 5.945 | 0 |
| 5.946 | 0 |
| 5.947 | 0 |
| 5.948 | 0 |
| 5.949 | 0 |
| 5.95 | 0 |
| 5.951 | 0 |
| 5.952 | 0 |
| 5.953 | 0 |
| 5.954 | 0 |
| 5.955 | 0 |
| 5.956 | 0 |
| 5.957 | 0 |
| 5.958 | 0 |
| 5.959 | 0 |
| 5.96 | 0 |
| 5.961 | 0 |
| 5.962 | 0 |
| 5.963 | 0 |
| 5.964 | 0 |
| 5.965 | 0 |
| 5.966 | 0 |
| 5.967 | 0 |
| 5.968 | 0 |
| 5.969 | 0 |
| 5.97 | 0 |
| 5.971 | 0 |
| 5.972 | 0 |
| 5.973 | 0 |
| 5.974 | 0 |
| 5.975 | 0 |
| 5.976 | 0 |
| 5.977 | 0 |
| 5.978 | 0 |
| 5.979 | 0 |
| 5.98 | 0 |
| 5.981 | 0 |
| 5.982 | 0 |
| 5.983 | 0 |
| 5.984 | 0 |
| 5.985 | 0 |
| 5.986 | 0 |
| 5.987 | 0 |
| 5.988 | 0 |
| 5.989 | 0 |
| 5.99 | 0 |
| 5.991 | 0 |
| 5.992 | 0 |
| 5.993 | 0 |
| 5.994 | 0 |
| 5.995 | 0 |
| 5.996 | 0 |
| 5.997 | 0 |
| 5.998 | 0 |
| 5.999 | 0 |
| 6.0 | 0 |
| 6.001 | 0 |
| 6.002 | 0 |
| 6.003 | 0 |
| 6.004 | 0 |
| 6.005 | 0 |
| 6.006 | 0 |
| 6.007 | 0 |
| 6.008 | 0 |
| 6.009 | 0 |
| 6.01 | 0 |
| 6.011 | 0 |
| 6.012 | 0 |
| 6.013 | 0 |
| 6.014 | 0 |
| 6.015 | 0 |
| 6.016 | 0 |
| 6.017 | 0 |
| 6.018 | 0 |
| 6.019 | 0 |
| 6.02 | 0 |
| 6.021 | 0 |
| 6.022 | 0 |
| 6.023 | 0 |
| 6.024 | 0 |
| 6.025 | 0 |
| 6.026 | 0 |
| 6.027 | 0 |
| 6.028 | 0 |
| 6.029 | 0 |
| 6.03 | 0 |
| 6.031 | 0 |
| 6.032 | 0 |
| 6.033 | 0 |
| 6.034 | 0 |
| 6.035 | 0 |
| 6.036 | 0 |
| 6.037 | 0 |
| 6.038 | 0 |
| 6.039 | 0 |
| 6.04 | 0 |
| 6.041 | 0 |
| 6.042 | 0 |
| 6.043 | 0 |
| 6.044 | 0 |
| 6.045 | 0 |
| 6.046 | 0 |
| 6.047 | 0 |
| 6.048 | 0 |
| 6.049 | 0 |
| 6.05 | 0 |
| 6.051 | 0 |
| 6.052 | 0 |
| 6.053 | 0 |
| 6.054 | 0 |
| 6.055 | 0 |
| 6.056 | 0 |
| 6.057 | 0 |
| 6.058 | 0 |
| 6.059 | 0 |
| 6.06 | 0 |
| 6.061 | 0 |
| 6.062 | 0 |
| 6.063 | 0 |
| 6.064 | 0 |
| 6.065 | 0 |
| 6.066 | 0 |
| 6.067 | 0 |
| 6.068 | 0 |
| 6.069 | 0 |
| 6.07 | 0 |
| 6.071 | 0 |
| 6.072 | 0 |
| 6.073 | 0 |
| 6.074 | 0 |
| 6.075 | 0 |
| 6.076 | 0 |
| 6.077 | 0 |
| 6.078 | 0 |
| 6.079 | 0 |
| 6.08 | 0 |
| 6.081 | 0 |
| 6.082 | 0 |
| 6.083 | 0 |
| 6.084 | 0 |
| 6.085 | 0 |
| 6.086 | 0 |
| 6.087 | 0 |
| 6.088 | 0 |
| 6.089 | 0 |
| 6.09 | 0 |
| 6.091 | 0 |
| 6.092 | 0 |
| 6.093 | 0 |
| 6.094 | 0 |
| 6.095 | 0 |
| 6.096 | 0 |
| 6.097 | 0 |
| 6.098 | 0 |
| 6.099 | 0 |
| 6.1 | 0 |
| 6.101 | 0 |
| 6.102 | 0 |
| 6.103 | 0 |
| 6.104 | 0 |
| 6.105 | 0 |
| 6.106 | 0 |
| 6.107 | 0 |
| 6.108 | 0 |
| 6.109 | 0 |
| 6.11 | 0 |
| 6.111 | 0 |
| 6.112 | 0 |
| 6.113 | 0 |
| 6.114 | 0 |
| 6.115 | 0 |
| 6.116 | 0 |
| 6.117 | 0 |
| 6.118 | 0 |
| 6.119 | 0 |
| 6.12 | 0 |
| 6.121 | 0 |
| 6.122 | 0 |
| 6.123 | 0 |
| 6.124 | 0 |
| 6.125 | 0 |
| 6.126 | 0 |
| 6.127 | 0 |
| 6.128 | 0 |
| 6.129 | 0 |
| 6.13 | 0 |
| 6.131 | 0 |
| 6.132 | 0 |
| 6.133 | 0 |
| 6.134 | 0 |
| 6.135 | 0 |
| 6.136 | 0 |
| 6.137 | 0 |
| 6.138 | 0 |
| 6.139 | 0 |
| 6.14 | 0 |
| 6.141 | 0 |
| 6.142 | 0 |
| 6.143 | 0 |
| 6.144 | 0 |
| 6.145 | 0 |
| 6.146 | 0 |
| 6.147 | 0 |
| 6.148 | 0 |
| 6.149 | 0 |
| 6.15 | 0 |
| 6.151 | 0 |
| 6.152 | 0 |
| 6.153 | 0 |
| 6.154 | 0 |
| 6.155 | 0 |
| 6.156 | 0 |
| 6.157 | 0 |
| 6.158 | 0 |
| 6.159 | 0 |
| 6.16 | 0 |
| 6.161 | 0 |
| 6.162 | 0 |
| 6.163 | 0 |
| 6.164 | 0 |
| 6.165 | 0 |
| 6.166 | 0 |
| 6.167 | 0 |
| 6.168 | 0 |
| 6.169 | 0 |
| 6.17 | 0 |
| 6.171 | 0 |
| 6.172 | 0 |
| 6.173 | 0 |
| 6.174 | 0 |
| 6.175 | 0 |
| 6.176 | 0 |
| 6.177 | 0 |
| 6.178 | 0 |
| 6.179 | 0 |
| 6.18 | 0 |
| 6.181 | 0 |
| 6.182 | 0 |
| 6.183 | 0.001 |
| 6.184 | 0.001 |
| 6.185 | 0.001 |
| 6.186 | 0.001 |
| 6.187 | 0.001 |
| 6.188 | 0.001 |
| 6.189 | 0.001 |
| 6.19 | 0.001 |
| 6.191 | 0.001 |
| 6.192 | 0.001 |
| 6.193 | 0.001 |
| 6.194 | 0.001 |
| 6.195 | 0.001 |
| 6.196 | 0.001 |
| 6.197 | 0.001 |
| 6.198 | 0.001 |
| 6.199 | 0.001 |
| 6.2 | 0.001 |
| 6.201 | 0.001 |
| 6.202 | 0.001 |
| 6.203 | 0.001 |
| 6.204 | 0.001 |
| 6.205 | 0.001 |
| 6.206 | 0.001 |
| 6.207 | 0.001 |
| 6.208 | 0.001 |
| 6.209 | 0.001 |
| 6.21 | 0.001 |
| 6.211 | 0.001 |
| 6.212 | 0.001 |
| 6.213 | 0.001 |
| 6.214 | 0.001 |
| 6.215 | 0.001 |
| 6.216 | 0.001 |
| 6.217 | 0.001 |
| 6.218 | 0.001 |
| 6.219 | 0.001 |
| 6.22 | 0.001 |
| 6.221 | 0.001 |
| 6.222 | 0.001 |
| 6.223 | 0.001 |
| 6.224 | 0.001 |
| 6.225 | 0.001 |
| 6.226 | 0.001 |
| 6.227 | 0.001 |
| 6.228 | 0.001 |
| 6.229 | 0.001 |
| 6.23 | 0.001 |
| 6.231 | 0.001 |
| 6.232 | 0.001 |
| 6.233 | 0.001 |
| 6.234 | 0.001 |
| 6.235 | 0.001 |
| 6.236 | 0.001 |
| 6.237 | 0.001 |
| 6.238 | 0.001 |
| 6.239 | 0.001 |
| 6.24 | 0.001 |
| 6.241 | 0.001 |
| 6.242 | 0.001 |
| 6.243 | 0.001 |
| 6.244 | 0.001 |
| 6.245 | 0.001 |
| 6.246 | 0.001 |
| 6.247 | 0.001 |
| 6.248 | 0.001 |
| 6.249 | 0.001 |
| 6.25 | 0.001 |
| 6.251 | 0.001 |
| 6.252 | 0.001 |
| 6.253 | 0.002 |
| 6.254 | 0.002 |
| 6.255 | 0.002 |
| 6.256 | 0.002 |
| 6.257 | 0.002 |
| 6.258 | 0.002 |
| 6.259 | 0.002 |
| 6.26 | 0.002 |
| 6.261 | 0.002 |
| 6.262 | 0.002 |
| 6.263 | 0.002 |
| 6.264 | 0.002 |
| 6.265 | 0.002 |
| 6.266 | 0.002 |
| 6.267 | 0.002 |
| 6.268 | 0.002 |
| 6.269 | 0.002 |
| 6.27 | 0.002 |
| 6.271 | 0.002 |
| 6.272 | 0.002 |
| 6.273 | 0.002 |
| 6.274 | 0.002 |
| 6.275 | 0.002 |
| 6.276 | 0.002 |
| 6.277 | 0.002 |
| 6.278 | 0.002 |
| 6.279 | 0.002 |
| 6.28 | 0.002 |
| 6.281 | 0.002 |
| 6.282 | 0.002 |
| 6.283 | 0.002 |
| 6.284 | 0.002 |
| 6.285 | 0.002 |
| 6.286 | 0.002 |
| 6.287 | 0.002 |
| 6.288 | 0.003 |
| 6.289 | 0.003 |
| 6.29 | 0.003 |
| 6.291 | 0.003 |
| 6.292 | 0.003 |
| 6.293 | 0.003 |
| 6.294 | 0.003 |
| 6.295 | 0.003 |
| 6.296 | 0.003 |
| 6.297 | 0.003 |
| 6.298 | 0.003 |
| 6.299 | 0.003 |
| 6.3 | 0.003 |
| 6.301 | 0.003 |
| 6.302 | 0.003 |
| 6.303 | 0.003 |
| 6.304 | 0.003 |
| 6.305 | 0.003 |
| 6.306 | 0.003 |
| 6.307 | 0.003 |
| 6.308 | 0.003 |
| 6.309 | 0.003 |
| 6.31 | 0.003 |
| 6.311 | 0.003 |
| 6.312 | 0.004 |
| 6.313 | 0.004 |
| 6.314 | 0.004 |
| 6.315 | 0.004 |
| 6.316 | 0.004 |
| 6.317 | 0.004 |
| 6.318 | 0.004 |
| 6.319 | 0.004 |
| 6.32 | 0.004 |
| 6.321 | 0.004 |
| 6.322 | 0.004 |
| 6.323 | 0.004 |
| 6.324 | 0.004 |
| 6.325 | 0.004 |
| 6.326 | 0.004 |
| 6.327 | 0.004 |
| 6.328 | 0.004 |
| 6.329 | 0.004 |
| 6.33 | 0.004 |
| 6.331 | 0.005 |
| 6.332 | 0.005 |
| 6.333 | 0.005 |
| 6.334 | 0.005 |
| 6.335 | 0.005 |
| 6.336 | 0.005 |
| 6.337 | 0.005 |
| 6.338 | 0.005 |
| 6.339 | 0.005 |
| 6.34 | 0.005 |
| 6.341 | 0.005 |
| 6.342 | 0.005 |
| 6.343 | 0.005 |
| 6.344 | 0.005 |
| 6.345 | 0.005 |
| 6.346 | 0.006 |
| 6.347 | 0.006 |
| 6.348 | 0.006 |
| 6.349 | 0.006 |
| 6.35 | 0.006 |
| 6.351 | 0.006 |
| 6.352 | 0.006 |
| 6.353 | 0.006 |
| 6.354 | 0.006 |
| 6.355 | 0.006 |
| 6.356 | 0.006 |
| 6.357 | 0.006 |
| 6.358 | 0.006 |
| 6.359 | 0.007 |
| 6.36 | 0.007 |
| 6.361 | 0.007 |
| 6.362 | 0.007 |
| 6.363 | 0.007 |
| 6.364 | 0.007 |
| 6.365 | 0.007 |
| 6.366 | 0.007 |
| 6.367 | 0.007 |
| 6.368 | 0.007 |
| 6.369 | 0.007 |
| 6.37 | 0.008 |
| 6.371 | 0.008 |
| 6.372 | 0.008 |
| 6.373 | 0.008 |
| 6.374 | 0.008 |
| 6.375 | 0.008 |
| 6.376 | 0.008 |
| 6.377 | 0.008 |
| 6.378 | 0.008 |
| 6.379 | 0.008 |
| 6.38 | 0.009 |
| 6.381 | 0.009 |
| 6.382 | 0.009 |
| 6.383 | 0.009 |
| 6.384 | 0.009 |
| 6.385 | 0.009 |
| 6.386 | 0.009 |
| 6.387 | 0.009 |
| 6.388 | 0.009 |
| 6.389 | 0.01 |
| 6.39 | 0.01 |
| 6.391 | 0.01 |
| 6.392 | 0.01 |
| 6.393 | 0.01 |
| 6.394 | 0.01 |
| 6.395 | 0.01 |
| 6.396 | 0.01 |
| 6.397 | 0.011 |
| 6.398 | 0.011 |
| 6.399 | 0.011 |
| 6.4 | 0.011 |
| 6.401 | 0.011 |
| 6.402 | 0.011 |
| 6.403 | 0.011 |
| 6.404 | 0.011 |
| 6.405 | 0.012 |
| 6.406 | 0.012 |
| 6.407 | 0.012 |
| 6.408 | 0.012 |
| 6.409 | 0.012 |
| 6.41 | 0.012 |
| 6.411 | 0.012 |
| 6.412 | 0.013 |
| 6.413 | 0.013 |
| 6.414 | 0.013 |
| 6.415 | 0.013 |
| 6.416 | 0.013 |
| 6.417 | 0.013 |
| 6.418 | 0.014 |
| 6.419 | 0.014 |
| 6.42 | 0.014 |
| 6.421 | 0.014 |
| 6.422 | 0.014 |
| 6.423 | 0.014 |
| 6.424 | 0.014 |
| 6.425 | 0.015 |
| 6.426 | 0.015 |
| 6.427 | 0.015 |
| 6.428 | 0.015 |
| 6.429 | 0.015 |
| 6.43 | 0.016 |
| 6.431 | 0.016 |
| 6.432 | 0.016 |
| 6.433 | 0.016 |
| 6.434 | 0.016 |
| 6.435 | 0.016 |
| 6.436 | 0.017 |
| 6.437 | 0.017 |
| 6.438 | 0.017 |
| 6.439 | 0.017 |
| 6.44 | 0.017 |
| 6.441 | 0.018 |
| 6.442 | 0.018 |
| 6.443 | 0.018 |
| 6.444 | 0.018 |
| 6.445 | 0.018 |
| 6.446 | 0.019 |
| 6.447 | 0.019 |
| 6.448 | 0.019 |
| 6.449 | 0.019 |
| 6.45 | 0.019 |
| 6.451 | 0.02 |
| 6.452 | 0.02 |
| 6.453 | 0.02 |
| 6.454 | 0.02 |
| 6.455 | 0.021 |
| 6.456 | 0.021 |
| 6.457 | 0.021 |
| 6.458 | 0.021 |
| 6.459 | 0.021 |
| 6.46 | 0.022 |
| 6.461 | 0.022 |
| 6.462 | 0.022 |
| 6.463 | 0.022 |
| 6.464 | 0.023 |
| 6.465 | 0.023 |
| 6.466 | 0.023 |
| 6.467 | 0.023 |
| 6.468 | 0.024 |
| 6.469 | 0.024 |
| 6.47 | 0.024 |
| 6.471 | 0.024 |
| 6.472 | 0.025 |
| 6.473 | 0.025 |
| 6.474 | 0.025 |
| 6.475 | 0.025 |
| 6.476 | 0.026 |
| 6.477 | 0.026 |
| 6.478 | 0.026 |
| 6.479 | 0.026 |
| 6.48 | 0.027 |
| 6.481 | 0.027 |
| 6.482 | 0.027 |
| 6.483 | 0.028 |
| 6.484 | 0.028 |
| 6.485 | 0.028 |
| 6.486 | 0.028 |
| 6.487 | 0.029 |
| 6.488 | 0.029 |
| 6.489 | 0.029 |
| 6.49 | 0.03 |
| 6.491 | 0.03 |
| 6.492 | 0.03 |
| 6.493 | 0.031 |
| 6.494 | 0.031 |
| 6.495 | 0.031 |
| 6.496 | 0.032 |
| 6.497 | 0.032 |
| 6.498 | 0.032 |
| 6.499 | 0.033 |
| 6.5 | 0.033 |
| 6.501 | 0.033 |
| 6.502 | 0.033 |
| 6.503 | 0.034 |
| 6.504 | 0.034 |
| 6.505 | 0.035 |
| 6.506 | 0.035 |
| 6.507 | 0.035 |
| 6.508 | 0.036 |
| 6.509 | 0.036 |
| 6.51 | 0.036 |
| 6.511 | 0.037 |
| 6.512 | 0.037 |
| 6.513 | 0.037 |
| 6.514 | 0.038 |
| 6.515 | 0.038 |
| 6.516 | 0.038 |
| 6.517 | 0.039 |
| 6.518 | 0.039 |
| 6.519 | 0.04 |
| 6.52 | 0.04 |
| 6.521 | 0.04 |
| 6.522 | 0.041 |
| 6.523 | 0.041 |
| 6.524 | 0.042 |
| 6.525 | 0.042 |
| 6.526 | 0.042 |
| 6.527 | 0.043 |
| 6.528 | 0.043 |
| 6.529 | 0.044 |
| 6.53 | 0.044 |
| 6.531 | 0.044 |
| 6.532 | 0.045 |
| 6.533 | 0.045 |
| 6.534 | 0.046 |
| 6.535 | 0.046 |
| 6.536 | 0.046 |
| 6.537 | 0.047 |
| 6.538 | 0.047 |
| 6.539 | 0.048 |
| 6.54 | 0.048 |
| 6.541 | 0.049 |
| 6.542 | 0.049 |
| 6.543 | 0.05 |
| 6.544 | 0.05 |
| 6.545 | 0.05 |
| 6.546 | 0.051 |
| 6.547 | 0.051 |
| 6.548 | 0.052 |
| 6.549 | 0.052 |
| 6.55 | 0.053 |
| 6.551 | 0.053 |
| 6.552 | 0.054 |
| 6.553 | 0.054 |
| 6.554 | 0.055 |
| 6.555 | 0.055 |
| 6.556 | 0.056 |
| 6.557 | 0.056 |
| 6.558 | 0.057 |
| 6.559 | 0.057 |
| 6.56 | 0.058 |
| 6.561 | 0.058 |
| 6.562 | 0.059 |
| 6.563 | 0.059 |
| 6.564 | 0.06 |
| 6.565 | 0.06 |
| 6.566 | 0.061 |
| 6.567 | 0.061 |
| 6.568 | 0.062 |
| 6.569 | 0.062 |
| 6.57 | 0.063 |
| 6.571 | 0.064 |
| 6.572 | 0.064 |
| 6.573 | 0.065 |
| 6.574 | 0.065 |
| 6.575 | 0.066 |
| 6.576 | 0.066 |
| 6.577 | 0.067 |
| 6.578 | 0.067 |
| 6.579 | 0.068 |
| 6.58 | 0.069 |
| 6.581 | 0.069 |
| 6.582 | 0.07 |
| 6.583 | 0.07 |
| 6.584 | 0.071 |
| 6.585 | 0.071 |
| 6.586 | 0.072 |
| 6.587 | 0.073 |
| 6.588 | 0.073 |
| 6.589 | 0.074 |
| 6.59 | 0.074 |
| 6.591 | 0.075 |
| 6.592 | 0.076 |
| 6.593 | 0.076 |
| 6.594 | 0.077 |
| 6.595 | 0.078 |
| 6.596 | 0.078 |
| 6.597 | 0.079 |
| 6.598 | 0.079 |
| 6.599 | 0.08 |
| 6.6 | 0.081 |
| 6.601 | 0.081 |
| 6.602 | 0.082 |
| 6.603 | 0.083 |
| 6.604 | 0.083 |
| 6.605 | 0.084 |
| 6.606 | 0.085 |
| 6.607 | 0.085 |
| 6.608 | 0.086 |
| 6.609 | 0.087 |
| 6.61 | 0.087 |
| 6.611 | 0.088 |
| 6.612 | 0.089 |
| 6.613 | 0.089 |
| 6.614 | 0.09 |
| 6.615 | 0.091 |
| 6.616 | 0.092 |
| 6.617 | 0.092 |
| 6.618 | 0.093 |
| 6.619 | 0.094 |
| 6.62 | 0.094 |
| 6.621 | 0.095 |
| 6.622 | 0.096 |
| 6.623 | 0.097 |
| 6.624 | 0.097 |
| 6.625 | 0.098 |
| 6.626 | 0.099 |
| 6.627 | 0.1 |
| 6.628 | 0.1 |
| 6.628999999999999 | 0.101 |
| 6.63 | 0.102 |
| 6.631 | 0.102 |
| 6.632 | 0.103 |
| 6.633 | 0.104 |
| 6.634 | 0.105 |
| 6.635 | 0.106 |
| 6.636 | 0.106 |
| 6.636999999999999 | 0.107 |
| 6.638 | 0.108 |
| 6.639 | 0.109 |
| 6.64 | 0.109 |
| 6.641 | 0.11 |
| 6.642 | 0.111 |
| 6.643 | 0.112 |
| 6.644 | 0.113 |
| 6.644999999999999 | 0.113 |
| 6.646 | 0.114 |
| 6.647 | 0.115 |
| 6.648 | 0.116 |
| 6.649 | 0.117 |
| 6.65 | 0.118 |
| 6.651 | 0.118 |
| 6.652 | 0.119 |
| 6.652999999999999 | 0.12 |
| 6.654 | 0.121 |
| 6.655 | 0.122 |
| 6.656 | 0.122 |
| 6.657 | 0.123 |
| 6.658 | 0.124 |
| 6.659 | 0.125 |
| 6.66 | 0.126 |
| 6.660999999999999 | 0.127 |
| 6.662 | 0.128 |
| 6.663 | 0.128 |
| 6.664 | 0.129 |
| 6.665 | 0.13 |
| 6.666 | 0.131 |
| 6.667 | 0.132 |
| 6.668 | 0.133 |
| 6.668999999999999 | 0.134 |
| 6.67 | 0.135 |
| 6.671 | 0.136 |
| 6.672 | 0.136 |
| 6.673 | 0.137 |
| 6.674 | 0.138 |
| 6.675 | 0.139 |
| 6.676 | 0.14 |
| 6.677 | 0.141 |
| 6.678 | 0.142 |
| 6.679 | 0.143 |
| 6.68 | 0.144 |
| 6.681 | 0.145 |
| 6.682 | 0.146 |
| 6.683 | 0.146 |
| 6.684 | 0.147 |
| 6.685 | 0.148 |
| 6.686 | 0.149 |
| 6.687 | 0.15 |
| 6.688 | 0.151 |
| 6.689 | 0.152 |
| 6.69 | 0.153 |
| 6.691 | 0.154 |
| 6.692 | 0.155 |
| 6.693 | 0.156 |
| 6.694 | 0.157 |
| 6.695 | 0.158 |
| 6.696 | 0.159 |
| 6.697 | 0.16 |
| 6.698 | 0.161 |
| 6.699 | 0.162 |
| 6.7 | 0.163 |
| 6.701 | 0.164 |
| 6.702 | 0.165 |
| 6.703 | 0.166 |
| 6.704 | 0.167 |
| 6.705 | 0.168 |
| 6.706 | 0.169 |
| 6.707 | 0.17 |
| 6.708 | 0.171 |
| 6.709 | 0.172 |
| 6.71 | 0.173 |
| 6.711 | 0.174 |
| 6.712 | 0.175 |
| 6.713 | 0.176 |
| 6.714 | 0.177 |
| 6.715 | 0.178 |
| 6.716 | 0.179 |
| 6.717 | 0.18 |
| 6.718 | 0.181 |
| 6.719 | 0.182 |
| 6.72 | 0.183 |
| 6.721 | 0.184 |
| 6.722 | 0.185 |
| 6.723 | 0.186 |
| 6.724 | 0.187 |
| 6.725 | 0.188 |
| 6.726 | 0.189 |
| 6.727 | 0.19 |
| 6.728 | 0.191 |
| 6.729 | 0.192 |
| 6.73 | 0.193 |
| 6.731 | 0.194 |
| 6.732 | 0.195 |
| 6.733 | 0.196 |
| 6.734 | 0.197 |
| 6.735 | 0.198 |
| 6.736 | 0.199 |
| 6.737 | 0.2 |
| 6.738 | 0.201 |
| 6.739 | 0.202 |
| 6.74 | 0.203 |
| 6.741 | 0.205 |
| 6.742 | 0.206 |
| 6.743 | 0.207 |
| 6.744 | 0.208 |
| 6.745 | 0.209 |
| 6.746 | 0.21 |
| 6.747 | 0.211 |
| 6.748 | 0.212 |
| 6.749 | 0.213 |
| 6.75 | 0.214 |
| 6.751 | 0.215 |
| 6.752 | 0.216 |
| 6.753 | 0.217 |
| 6.753999999999999 | 0.218 |
| 6.755 | 0.219 |
| 6.756 | 0.221 |
| 6.757 | 0.222 |
| 6.758 | 0.223 |
| 6.759 | 0.224 |
| 6.76 | 0.225 |
| 6.761 | 0.226 |
| 6.761999999999999 | 0.227 |
| 6.763 | 0.228 |
| 6.764 | 0.229 |
| 6.765 | 0.23 |
| 6.766 | 0.231 |
| 6.767 | 0.232 |
| 6.768 | 0.234 |
| 6.769 | 0.235 |
| 6.769999999999999 | 0.236 |
| 6.771 | 0.237 |
| 6.772 | 0.238 |
| 6.773 | 0.239 |
| 6.774 | 0.24 |
| 6.775 | 0.241 |
| 6.776 | 0.242 |
| 6.777 | 0.243 |
| 6.778 | 0.244 |
| 6.779 | 0.245 |
| 6.78 | 0.247 |
| 6.781 | 0.248 |
| 6.782 | 0.249 |
| 6.783 | 0.25 |
| 6.784 | 0.251 |
| 6.785 | 0.252 |
| 6.786 | 0.253 |
| 6.787 | 0.254 |
| 6.788 | 0.255 |
| 6.789 | 0.256 |
| 6.79 | 0.257 |
| 6.791 | 0.258 |
| 6.792 | 0.26 |
| 6.793 | 0.261 |
| 6.794 | 0.262 |
| 6.795 | 0.263 |
| 6.796 | 0.264 |
| 6.797 | 0.265 |
| 6.798 | 0.266 |
| 6.799 | 0.267 |
| 6.8 | 0.268 |
| 6.801 | 0.269 |
| 6.802 | 0.27 |
| 6.803 | 0.271 |
| 6.804 | 0.272 |
| 6.805 | 0.273 |
| 6.806 | 0.275 |
| 6.807 | 0.276 |
| 6.808 | 0.277 |
| 6.809 | 0.278 |
| 6.81 | 0.279 |
| 6.811 | 0.28 |
| 6.812 | 0.281 |
| 6.813 | 0.282 |
| 6.814 | 0.283 |
| 6.815 | 0.284 |
| 6.816 | 0.285 |
| 6.817 | 0.286 |
| 6.818 | 0.287 |
| 6.819 | 0.288 |
| 6.82 | 0.289 |
| 6.821 | 0.29 |
| 6.822 | 0.291 |
| 6.823 | 0.292 |
| 6.824 | 0.293 |
| 6.825 | 0.294 |
| 6.826 | 0.296 |
| 6.827 | 0.297 |
| 6.828 | 0.298 |
| 6.829 | 0.299 |
| 6.83 | 0.3 |
| 6.831 | 0.301 |
| 6.832 | 0.302 |
| 6.833 | 0.303 |
| 6.834 | 0.304 |
| 6.835 | 0.305 |
| 6.836 | 0.306 |
| 6.837 | 0.307 |
| 6.838 | 0.308 |
| 6.839 | 0.309 |
| 6.84 | 0.31 |
| 6.841 | 0.311 |
| 6.842 | 0.312 |
| 6.843 | 0.313 |
| 6.844 | 0.314 |
| 6.845 | 0.315 |
| 6.846 | 0.316 |
| 6.847 | 0.317 |
| 6.848 | 0.317 |
| 6.849 | 0.318 |
| 6.85 | 0.319 |
| 6.851 | 0.32 |
| 6.852 | 0.321 |
| 6.853 | 0.322 |
| 6.854 | 0.323 |
| 6.855 | 0.324 |
| 6.856 | 0.325 |
| 6.857 | 0.326 |
| 6.858 | 0.327 |
| 6.859 | 0.328 |
| 6.86 | 0.329 |
| 6.861 | 0.33 |
| 6.862 | 0.331 |
| 6.863 | 0.332 |
| 6.864 | 0.332 |
| 6.865 | 0.333 |
| 6.866 | 0.334 |
| 6.867 | 0.335 |
| 6.868 | 0.336 |
| 6.869 | 0.337 |
| 6.87 | 0.338 |
| 6.871 | 0.339 |
| 6.872 | 0.34 |
| 6.873 | 0.34 |
| 6.874 | 0.341 |
| 6.875 | 0.342 |
| 6.876 | 0.343 |
| 6.877 | 0.344 |
| 6.878 | 0.345 |
| 6.879 | 0.346 |
| 6.88 | 0.346 |
| 6.881 | 0.347 |
| 6.882 | 0.348 |
| 6.883 | 0.349 |
| 6.884 | 0.35 |
| 6.885 | 0.35 |
| 6.886 | 0.351 |
| 6.887 | 0.352 |
| 6.888 | 0.353 |
| 6.889 | 0.354 |
| 6.89 | 0.354 |
| 6.891 | 0.355 |
| 6.892 | 0.356 |
| 6.893 | 0.357 |
| 6.894 | 0.357 |
| 6.895 | 0.358 |
| 6.896 | 0.359 |
| 6.897 | 0.36 |
| 6.898 | 0.36 |
| 6.899 | 0.361 |
| 6.9 | 0.362 |
| 6.901 | 0.363 |
| 6.902 | 0.363 |
| 6.903 | 0.364 |
| 6.904 | 0.365 |
| 6.905 | 0.365 |
| 6.906 | 0.366 |
| 6.907 | 0.367 |
| 6.908 | 0.368 |
| 6.909 | 0.368 |
| 6.91 | 0.369 |
| 6.911 | 0.37 |
| 6.912 | 0.37 |
| 6.913 | 0.371 |
| 6.914 | 0.371 |
| 6.915 | 0.372 |
| 6.916 | 0.373 |
| 6.917 | 0.373 |
| 6.918 | 0.374 |
| 6.919 | 0.375 |
| 6.92 | 0.375 |
| 6.921 | 0.376 |
| 6.922 | 0.376 |
| 6.923 | 0.377 |
| 6.924 | 0.378 |
| 6.925 | 0.378 |
| 6.926 | 0.379 |
| 6.927 | 0.379 |
| 6.928 | 0.38 |
| 6.929 | 0.38 |
| 6.93 | 0.381 |
| 6.931 | 0.381 |
| 6.932 | 0.382 |
| 6.933 | 0.382 |
| 6.934 | 0.383 |
| 6.935 | 0.383 |
| 6.936 | 0.384 |
| 6.937 | 0.384 |
| 6.938 | 0.385 |
| 6.939 | 0.385 |
| 6.94 | 0.386 |
| 6.941 | 0.386 |
| 6.942 | 0.387 |
| 6.943 | 0.387 |
| 6.944 | 0.388 |
| 6.945 | 0.388 |
| 6.946 | 0.389 |
| 6.947 | 0.389 |
| 6.948 | 0.389 |
| 6.949 | 0.39 |
| 6.95 | 0.39 |
| 6.951 | 0.391 |
| 6.952 | 0.391 |
| 6.953 | 0.391 |
| 6.954 | 0.392 |
| 6.955 | 0.392 |
| 6.956 | 0.392 |
| 6.957 | 0.393 |
| 6.958 | 0.393 |
| 6.959 | 0.393 |
| 6.96 | 0.394 |
| 6.961 | 0.394 |
| 6.962 | 0.394 |
| 6.963 | 0.395 |
| 6.964 | 0.395 |
| 6.965 | 0.395 |
| 6.966 | 0.395 |
| 6.967 | 0.396 |
| 6.968 | 0.396 |
| 6.969 | 0.396 |
| 6.97 | 0.396 |
| 6.971 | 0.397 |
| 6.972 | 0.397 |
| 6.973 | 0.397 |
| 6.974 | 0.397 |
| 6.975 | 0.398 |
| 6.976 | 0.398 |
| 6.977 | 0.398 |
| 6.978 | 0.398 |
| 6.979 | 0.398 |
| 6.98 | 0.398 |
| 6.981 | 0.399 |
| 6.982 | 0.399 |
| 6.983 | 0.399 |
| 6.984 | 0.399 |
| 6.985 | 0.399 |
| 6.986 | 0.399 |
| 6.987 | 0.399 |
| 6.988 | 0.399 |
| 6.989 | 0.4 |
| 6.99 | 0.4 |
| 6.991 | 0.4 |
| 6.992 | 0.4 |
| 6.993 | 0.4 |
| 6.994 | 0.4 |
| 6.995 | 0.4 |
| 6.996 | 0.4 |
| 6.997 | 0.4 |
| 6.998 | 0.4 |
| 6.999 | 0.4 |
| 7.0 | 0.4 |
| 7.001 | 0.4 |
| 7.002 | 0.4 |
| 7.003 | 0.4 |
| 7.004 | 0.4 |
| 7.005 | 0.4 |
| 7.006 | 0.4 |
| 7.007 | 0.4 |
| 7.008 | 0.4 |
| 7.009 | 0.4 |
| 7.01 | 0.4 |
| 7.011 | 0.4 |
| 7.012 | 0.399 |
| 7.013 | 0.399 |
| 7.014 | 0.399 |
| 7.015 | 0.399 |
| 7.016 | 0.399 |
| 7.017 | 0.399 |
| 7.018 | 0.399 |
| 7.019 | 0.399 |
| 7.02 | 0.398 |
| 7.021 | 0.398 |
| 7.022 | 0.398 |
| 7.023 | 0.398 |
| 7.024 | 0.398 |
| 7.025 | 0.398 |
| 7.026 | 0.397 |
| 7.027 | 0.397 |
| 7.028 | 0.397 |
| 7.029 | 0.397 |
| 7.03 | 0.396 |
| 7.031 | 0.396 |
| 7.032 | 0.396 |
| 7.033 | 0.396 |
| 7.034 | 0.395 |
| 7.035 | 0.395 |
| 7.036 | 0.395 |
| 7.037 | 0.395 |
| 7.038 | 0.394 |
| 7.039 | 0.394 |
| 7.04 | 0.394 |
| 7.041 | 0.393 |
| 7.042 | 0.393 |
| 7.043 | 0.393 |
| 7.044 | 0.392 |
| 7.045 | 0.392 |
| 7.046 | 0.392 |
| 7.047 | 0.391 |
| 7.048 | 0.391 |
| 7.049 | 0.391 |
| 7.05 | 0.39 |
| 7.051 | 0.39 |
| 7.052 | 0.389 |
| 7.053 | 0.389 |
| 7.054 | 0.389 |
| 7.055 | 0.388 |
| 7.056 | 0.388 |
| 7.057 | 0.387 |
| 7.058 | 0.387 |
| 7.059 | 0.386 |
| 7.06 | 0.386 |
| 7.061 | 0.385 |
| 7.062 | 0.385 |
| 7.063 | 0.384 |
| 7.064 | 0.384 |
| 7.065 | 0.383 |
| 7.066 | 0.383 |
| 7.067 | 0.382 |
| 7.068 | 0.382 |
| 7.069 | 0.381 |
| 7.07 | 0.381 |
| 7.071 | 0.38 |
| 7.072 | 0.38 |
| 7.073 | 0.379 |
| 7.074 | 0.379 |
| 7.075 | 0.378 |
| 7.076 | 0.378 |
| 7.077 | 0.377 |
| 7.078 | 0.376 |
| 7.079 | 0.376 |
| 7.08 | 0.375 |
| 7.081 | 0.375 |
| 7.082 | 0.374 |
| 7.083 | 0.373 |
| 7.084 | 0.373 |
| 7.085 | 0.372 |
| 7.086 | 0.371 |
| 7.087 | 0.371 |
| 7.088 | 0.37 |
| 7.089 | 0.37 |
| 7.09 | 0.369 |
| 7.091 | 0.368 |
| 7.092 | 0.368 |
| 7.093 | 0.367 |
| 7.094 | 0.366 |
| 7.095 | 0.365 |
| 7.096 | 0.365 |
| 7.097 | 0.364 |
| 7.098 | 0.363 |
| 7.099 | 0.363 |
| 7.1 | 0.362 |
| 7.101 | 0.361 |
| 7.102 | 0.36 |
| 7.103 | 0.36 |
| 7.104 | 0.359 |
| 7.105 | 0.358 |
| 7.106 | 0.357 |
| 7.107 | 0.357 |
| 7.108 | 0.356 |
| 7.109 | 0.355 |
| 7.11 | 0.354 |
| 7.111 | 0.354 |
| 7.112 | 0.353 |
| 7.113 | 0.352 |
| 7.114 | 0.351 |
| 7.115 | 0.35 |
| 7.116 | 0.35 |
| 7.117 | 0.349 |
| 7.118 | 0.348 |
| 7.119 | 0.347 |
| 7.12 | 0.346 |
| 7.121 | 0.346 |
| 7.122 | 0.345 |
| 7.123 | 0.344 |
| 7.124 | 0.343 |
| 7.125 | 0.342 |
| 7.126 | 0.341 |
| 7.127 | 0.34 |
| 7.128 | 0.34 |
| 7.129 | 0.339 |
| 7.13 | 0.338 |
| 7.131 | 0.337 |
| 7.132 | 0.336 |
| 7.133 | 0.335 |
| 7.134 | 0.334 |
| 7.135 | 0.333 |
| 7.136 | 0.332 |
| 7.137 | 0.332 |
| 7.138 | 0.331 |
| 7.139 | 0.33 |
| 7.14 | 0.329 |
| 7.141 | 0.328 |
| 7.142 | 0.327 |
| 7.143 | 0.326 |
| 7.144 | 0.325 |
| 7.145 | 0.324 |
| 7.146 | 0.323 |
| 7.147 | 0.322 |
| 7.148 | 0.321 |
| 7.149 | 0.32 |
| 7.15 | 0.319 |
| 7.151 | 0.318 |
| 7.152 | 0.317 |
| 7.153 | 0.317 |
| 7.154 | 0.316 |
| 7.155 | 0.315 |
| 7.156 | 0.314 |
| 7.157 | 0.313 |
| 7.158 | 0.312 |
| 7.159 | 0.311 |
| 7.16 | 0.31 |
| 7.161 | 0.309 |
| 7.162 | 0.308 |
| 7.163 | 0.307 |
| 7.164 | 0.306 |
| 7.165 | 0.305 |
| 7.166 | 0.304 |
| 7.167 | 0.303 |
| 7.168 | 0.302 |
| 7.169 | 0.301 |
| 7.17 | 0.3 |
| 7.171 | 0.299 |
| 7.172 | 0.298 |
| 7.173 | 0.297 |
| 7.174 | 0.296 |
| 7.175 | 0.294 |
| 7.176 | 0.293 |
| 7.177 | 0.292 |
| 7.178 | 0.291 |
| 7.179 | 0.29 |
| 7.18 | 0.289 |
| 7.181 | 0.288 |
| 7.182 | 0.287 |
| 7.183 | 0.286 |
| 7.184 | 0.285 |
| 7.185 | 0.284 |
| 7.186 | 0.283 |
| 7.187 | 0.282 |
| 7.188 | 0.281 |
| 7.189 | 0.28 |
| 7.19 | 0.279 |
| 7.191 | 0.278 |
| 7.192 | 0.277 |
| 7.193 | 0.276 |
| 7.194 | 0.275 |
| 7.195 | 0.273 |
| 7.196 | 0.272 |
| 7.197 | 0.271 |
| 7.198 | 0.27 |
| 7.199 | 0.269 |
| 7.2 | 0.268 |
| 7.201 | 0.267 |
| 7.202 | 0.266 |
| 7.203 | 0.265 |
| 7.204 | 0.264 |
| 7.205 | 0.263 |
| 7.206 | 0.262 |
| 7.207 | 0.261 |
| 7.208 | 0.26 |
| 7.209 | 0.258 |
| 7.21 | 0.257 |
| 7.211 | 0.256 |
| 7.212 | 0.255 |
| 7.213 | 0.254 |
| 7.214 | 0.253 |
| 7.215 | 0.252 |
| 7.216 | 0.251 |
| 7.217 | 0.25 |
| 7.218 | 0.249 |
| 7.219 | 0.248 |
| 7.22 | 0.247 |
| 7.221 | 0.245 |
| 7.222 | 0.244 |
| 7.223 | 0.243 |
| 7.224 | 0.242 |
| 7.225 | 0.241 |
| 7.226 | 0.24 |
| 7.227 | 0.239 |
| 7.228 | 0.238 |
| 7.229 | 0.237 |
| 7.23 | 0.236 |
| 7.231 | 0.235 |
| 7.232 | 0.234 |
| 7.233 | 0.232 |
| 7.234 | 0.231 |
| 7.235 | 0.23 |
| 7.236 | 0.229 |
| 7.237 | 0.228 |
| 7.238 | 0.227 |
| 7.239 | 0.226 |
| 7.24 | 0.225 |
| 7.241 | 0.224 |
| 7.242 | 0.223 |
| 7.243 | 0.222 |
| 7.244 | 0.221 |
| 7.245 | 0.219 |
| 7.246 | 0.218 |
| 7.247 | 0.217 |
| 7.248 | 0.216 |
| 7.249 | 0.215 |
| 7.25 | 0.214 |
| 7.251 | 0.213 |
| 7.252 | 0.212 |
| 7.253 | 0.211 |
| 7.254 | 0.21 |
| 7.255 | 0.209 |
| 7.256 | 0.208 |
| 7.257 | 0.207 |
| 7.258 | 0.206 |
| 7.259 | 0.205 |
| 7.26 | 0.203 |
| 7.261 | 0.202 |
| 7.262 | 0.201 |
| 7.263 | 0.2 |
| 7.264 | 0.199 |
| 7.265 | 0.198 |
| 7.266 | 0.197 |
| 7.267 | 0.196 |
| 7.268 | 0.195 |
| 7.269 | 0.194 |
| 7.27 | 0.193 |
| 7.271 | 0.192 |
| 7.272 | 0.191 |
| 7.273 | 0.19 |
| 7.274 | 0.189 |
| 7.275 | 0.188 |
| 7.276 | 0.187 |
| 7.277 | 0.186 |
| 7.278 | 0.185 |
| 7.279 | 0.184 |
| 7.28 | 0.183 |
| 7.281 | 0.182 |
| 7.282 | 0.181 |
| 7.283 | 0.18 |
| 7.284 | 0.179 |
| 7.285 | 0.178 |
| 7.286 | 0.177 |
| 7.287 | 0.176 |
| 7.288 | 0.175 |
| 7.289 | 0.174 |
| 7.29 | 0.173 |
| 7.291 | 0.172 |
| 7.292 | 0.171 |
| 7.293 | 0.17 |
| 7.294 | 0.169 |
| 7.295 | 0.168 |
| 7.296 | 0.167 |
| 7.297 | 0.166 |
| 7.298 | 0.165 |
| 7.299 | 0.164 |
| 7.3 | 0.163 |
| 7.301 | 0.162 |
| 7.302 | 0.161 |
| 7.303 | 0.16 |
| 7.304 | 0.159 |
| 7.305 | 0.158 |
| 7.306 | 0.157 |
| 7.307 | 0.156 |
| 7.308 | 0.155 |
| 7.309 | 0.154 |
| 7.31 | 0.153 |
| 7.311 | 0.152 |
| 7.312 | 0.151 |
| 7.313 | 0.15 |
| 7.314 | 0.149 |
| 7.315 | 0.148 |
| 7.316 | 0.147 |
| 7.317 | 0.146 |
| 7.318 | 0.146 |
| 7.319 | 0.145 |
| 7.32 | 0.144 |
| 7.321 | 0.143 |
| 7.322 | 0.142 |
| 7.323 | 0.141 |
| 7.324 | 0.14 |
| 7.325 | 0.139 |
| 7.326 | 0.138 |
| 7.327 | 0.137 |
| 7.328 | 0.136 |
| 7.329 | 0.136 |
| 7.33 | 0.135 |
| 7.331 | 0.134 |
| 7.332 | 0.133 |
| 7.333 | 0.132 |
| 7.334 | 0.131 |
| 7.335 | 0.13 |
| 7.336 | 0.129 |
| 7.337 | 0.128 |
| 7.338 | 0.128 |
| 7.339 | 0.127 |
| 7.34 | 0.126 |
| 7.341 | 0.125 |
| 7.342 | 0.124 |
| 7.343 | 0.123 |
| 7.344 | 0.122 |
| 7.345 | 0.122 |
| 7.346 | 0.121 |
| 7.347 | 0.12 |
| 7.348 | 0.119 |
| 7.349 | 0.118 |
| 7.35 | 0.118 |
| 7.351 | 0.117 |
| 7.352 | 0.116 |
| 7.353 | 0.115 |
| 7.354 | 0.114 |
| 7.355 | 0.113 |
| 7.356 | 0.113 |
| 7.357 | 0.112 |
| 7.358 | 0.111 |
| 7.359 | 0.11 |
| 7.36 | 0.109 |
| 7.361 | 0.109 |
| 7.362 | 0.108 |
| 7.363 | 0.107 |
| 7.364 | 0.106 |
| 7.365 | 0.106 |
| 7.366 | 0.105 |
| 7.367 | 0.104 |
| 7.368 | 0.103 |
| 7.369 | 0.102 |
| 7.37 | 0.102 |
| 7.371 | 0.101 |
| 7.372 | 0.1 |
| 7.373 | 0.1 |
| 7.374 | 0.099 |
| 7.375 | 0.098 |
| 7.376 | 0.097 |
| 7.377 | 0.097 |
| 7.378 | 0.096 |
| 7.379 | 0.095 |
| 7.38 | 0.094 |
| 7.381 | 0.094 |
| 7.382 | 0.093 |
| 7.383 | 0.092 |
| 7.384 | 0.092 |
| 7.385 | 0.091 |
| 7.386 | 0.09 |
| 7.387 | 0.089 |
| 7.388 | 0.089 |
| 7.389 | 0.088 |
| 7.39 | 0.087 |
| 7.391 | 0.087 |
| 7.392 | 0.086 |
| 7.393 | 0.085 |
| 7.394 | 0.085 |
| 7.395 | 0.084 |
| 7.396 | 0.083 |
| 7.397 | 0.083 |
| 7.398 | 0.082 |
| 7.399 | 0.081 |
| 7.4 | 0.081 |
| 7.401 | 0.08 |
| 7.402 | 0.079 |
| 7.403 | 0.079 |
| 7.404 | 0.078 |
| 7.405 | 0.078 |
| 7.406 | 0.077 |
| 7.407 | 0.076 |
| 7.408 | 0.076 |
| 7.409 | 0.075 |
| 7.41 | 0.074 |
| 7.411 | 0.074 |
| 7.412 | 0.073 |
| 7.413 | 0.073 |
| 7.414 | 0.072 |
| 7.415 | 0.071 |
| 7.416 | 0.071 |
| 7.417 | 0.07 |
| 7.418 | 0.07 |
| 7.419 | 0.069 |
| 7.42 | 0.069 |
| 7.421 | 0.068 |
| 7.422 | 0.067 |
| 7.423 | 0.067 |
| 7.424 | 0.066 |
| 7.425 | 0.066 |
| 7.426 | 0.065 |
| 7.427 | 0.065 |
| 7.428 | 0.064 |
| 7.429 | 0.064 |
| 7.43 | 0.063 |
| 7.431 | 0.062 |
| 7.432 | 0.062 |
| 7.433 | 0.061 |
| 7.434 | 0.061 |
| 7.435 | 0.06 |
| 7.436 | 0.06 |
| 7.437 | 0.059 |
| 7.438 | 0.059 |
| 7.439 | 0.058 |
| 7.44 | 0.058 |
| 7.441 | 0.057 |
| 7.442 | 0.057 |
| 7.443 | 0.056 |
| 7.444 | 0.056 |
| 7.445 | 0.055 |
| 7.446 | 0.055 |
| 7.447 | 0.054 |
| 7.448 | 0.054 |
| 7.449 | 0.053 |
| 7.45 | 0.053 |
| 7.451 | 0.052 |
| 7.452 | 0.052 |
| 7.453 | 0.051 |
| 7.454 | 0.051 |
| 7.455 | 0.05 |
| 7.456 | 0.05 |
| 7.457 | 0.05 |
| 7.458 | 0.049 |
| 7.459 | 0.049 |
| 7.46 | 0.048 |
| 7.461 | 0.048 |
| 7.462 | 0.047 |
| 7.463 | 0.047 |
| 7.464 | 0.046 |
| 7.465 | 0.046 |
| 7.466 | 0.046 |
| 7.467 | 0.045 |
| 7.468 | 0.045 |
| 7.469 | 0.044 |
| 7.47 | 0.044 |
| 7.471 | 0.044 |
| 7.472 | 0.043 |
| 7.473 | 0.043 |
| 7.474 | 0.042 |
| 7.475 | 0.042 |
| 7.476 | 0.042 |
| 7.477 | 0.041 |
| 7.478 | 0.041 |
| 7.479 | 0.04 |
| 7.48 | 0.04 |
| 7.481 | 0.04 |
| 7.482 | 0.039 |
| 7.483 | 0.039 |
| 7.484 | 0.038 |
| 7.485 | 0.038 |
| 7.486 | 0.038 |
| 7.487 | 0.037 |
| 7.488 | 0.037 |
| 7.489 | 0.037 |
| 7.49 | 0.036 |
| 7.491 | 0.036 |
| 7.492 | 0.036 |
| 7.493 | 0.035 |
| 7.494 | 0.035 |
| 7.495 | 0.035 |
| 7.496 | 0.034 |
| 7.497 | 0.034 |
| 7.498 | 0.033 |
| 7.499 | 0.033 |
| 7.5 | 0.033 |
| 7.501 | 0.033 |
| 7.502 | 0.032 |
| 7.503 | 0.032 |
| 7.504 | 0.032 |
| 7.505 | 0.031 |
| 7.506 | 0.031 |
| 7.507 | 0.031 |
| 7.508 | 0.03 |
| 7.509 | 0.03 |
| 7.51 | 0.03 |
| 7.511 | 0.029 |
| 7.512 | 0.029 |
| 7.513 | 0.029 |
| 7.514 | 0.028 |
| 7.515 | 0.028 |
| 7.516 | 0.028 |
| 7.517 | 0.028 |
| 7.518 | 0.027 |
| 7.519 | 0.027 |
| 7.52 | 0.027 |
| 7.521 | 0.026 |
| 7.522 | 0.026 |
| 7.523 | 0.026 |
| 7.524 | 0.026 |
| 7.525 | 0.025 |
| 7.526 | 0.025 |
| 7.527 | 0.025 |
| 7.528 | 0.025 |
| 7.529 | 0.024 |
| 7.53 | 0.024 |
| 7.531 | 0.024 |
| 7.532 | 0.024 |
| 7.533 | 0.023 |
| 7.534 | 0.023 |
| 7.535 | 0.023 |
| 7.536 | 0.023 |
| 7.537 | 0.022 |
| 7.538 | 0.022 |
| 7.539 | 0.022 |
| 7.54 | 0.022 |
| 7.541 | 0.021 |
| 7.542 | 0.021 |
| 7.543 | 0.021 |
| 7.544 | 0.021 |
| 7.545 | 0.021 |
| 7.546 | 0.02 |
| 7.547 | 0.02 |
| 7.548 | 0.02 |
| 7.549 | 0.02 |
| 7.55 | 0.019 |
| 7.551 | 0.019 |
| 7.552 | 0.019 |
| 7.553 | 0.019 |
| 7.554 | 0.019 |
| 7.555 | 0.018 |
| 7.556 | 0.018 |
| 7.557 | 0.018 |
| 7.558 | 0.018 |
| 7.559 | 0.018 |
| 7.56 | 0.017 |
| 7.561 | 0.017 |
| 7.562 | 0.017 |
| 7.563 | 0.017 |
| 7.564 | 0.017 |
| 7.565 | 0.016 |
| 7.566 | 0.016 |
| 7.567 | 0.016 |
| 7.568 | 0.016 |
| 7.569 | 0.016 |
| 7.57 | 0.016 |
| 7.571 | 0.015 |
| 7.572 | 0.015 |
| 7.573 | 0.015 |
| 7.574 | 0.015 |
| 7.575 | 0.015 |
| 7.576 | 0.014 |
| 7.577 | 0.014 |
| 7.578 | 0.014 |
| 7.579 | 0.014 |
| 7.58 | 0.014 |
| 7.581 | 0.014 |
| 7.582 | 0.014 |
| 7.583 | 0.013 |
| 7.584 | 0.013 |
| 7.585 | 0.013 |
| 7.586 | 0.013 |
| 7.587 | 0.013 |
| 7.588 | 0.013 |
| 7.589 | 0.012 |
| 7.59 | 0.012 |
| 7.591 | 0.012 |
| 7.592 | 0.012 |
| 7.593 | 0.012 |
| 7.594 | 0.012 |
| 7.595 | 0.012 |
| 7.596 | 0.011 |
| 7.597 | 0.011 |
| 7.598 | 0.011 |
| 7.599 | 0.011 |
| 7.6 | 0.011 |
| 7.601 | 0.011 |
| 7.602 | 0.011 |
| 7.603 | 0.011 |
| 7.604 | 0.01 |
| 7.605 | 0.01 |
| 7.606 | 0.01 |
| 7.607 | 0.01 |
| 7.608 | 0.01 |
| 7.609 | 0.01 |
| 7.61 | 0.01 |
| 7.611 | 0.01 |
| 7.612 | 0.009 |
| 7.613 | 0.009 |
| 7.614 | 0.009 |
| 7.615 | 0.009 |
| 7.616 | 0.009 |
| 7.617 | 0.009 |
| 7.618 | 0.009 |
| 7.619 | 0.009 |
| 7.62 | 0.009 |
| 7.621 | 0.008 |
| 7.622 | 0.008 |
| 7.623 | 0.008 |
| 7.624 | 0.008 |
| 7.625 | 0.008 |
| 7.626 | 0.008 |
| 7.627 | 0.008 |
| 7.628 | 0.008 |
| 7.628999999999999 | 0.008 |
| 7.63 | 0.008 |
| 7.631 | 0.007 |
| 7.632 | 0.007 |
| 7.633 | 0.007 |
| 7.634 | 0.007 |
| 7.635 | 0.007 |
| 7.636 | 0.007 |
| 7.636999999999999 | 0.007 |
| 7.638 | 0.007 |
| 7.639 | 0.007 |
| 7.64 | 0.007 |
| 7.641 | 0.007 |
| 7.642 | 0.006 |
| 7.643 | 0.006 |
| 7.644 | 0.006 |
| 7.644999999999999 | 0.006 |
| 7.646 | 0.006 |
| 7.647 | 0.006 |
| 7.648 | 0.006 |
| 7.649 | 0.006 |
| 7.65 | 0.006 |
| 7.651 | 0.006 |
| 7.652 | 0.006 |
| 7.652999999999999 | 0.006 |
| 7.654 | 0.006 |
| 7.655 | 0.005 |
| 7.656 | 0.005 |
| 7.657 | 0.005 |
| 7.658 | 0.005 |
| 7.659 | 0.005 |
| 7.66 | 0.005 |
| 7.660999999999999 | 0.005 |
| 7.662 | 0.005 |
| 7.663 | 0.005 |
| 7.664 | 0.005 |
| 7.665 | 0.005 |
| 7.666 | 0.005 |
| 7.667 | 0.005 |
| 7.668 | 0.005 |
| 7.668999999999999 | 0.005 |
| 7.67 | 0.004 |
| 7.671 | 0.004 |
| 7.672 | 0.004 |
| 7.673 | 0.004 |
| 7.674 | 0.004 |
| 7.675 | 0.004 |
| 7.676 | 0.004 |
| 7.677 | 0.004 |
| 7.678 | 0.004 |
| 7.679 | 0.004 |
| 7.68 | 0.004 |
| 7.681 | 0.004 |
| 7.682 | 0.004 |
| 7.683 | 0.004 |
| 7.684 | 0.004 |
| 7.685 | 0.004 |
| 7.686 | 0.004 |
| 7.687 | 0.004 |
| 7.688 | 0.004 |
| 7.689 | 0.003 |
| 7.69 | 0.003 |
| 7.691 | 0.003 |
| 7.692 | 0.003 |
| 7.693 | 0.003 |
| 7.694 | 0.003 |
| 7.695 | 0.003 |
| 7.696 | 0.003 |
| 7.697 | 0.003 |
| 7.698 | 0.003 |
| 7.699 | 0.003 |
| 7.7 | 0.003 |
| 7.701 | 0.003 |
| 7.702 | 0.003 |
| 7.703 | 0.003 |
| 7.704 | 0.003 |
| 7.705 | 0.003 |
| 7.706 | 0.003 |
| 7.707 | 0.003 |
| 7.708 | 0.003 |
| 7.709 | 0.003 |
| 7.71 | 0.003 |
| 7.711 | 0.003 |
| 7.712 | 0.003 |
| 7.713 | 0.002 |
| 7.714 | 0.002 |
| 7.715 | 0.002 |
| 7.716 | 0.002 |
| 7.717 | 0.002 |
| 7.718 | 0.002 |
| 7.719 | 0.002 |
| 7.72 | 0.002 |
| 7.721 | 0.002 |
| 7.722 | 0.002 |
| 7.723 | 0.002 |
| 7.724 | 0.002 |
| 7.725 | 0.002 |
| 7.726 | 0.002 |
| 7.727 | 0.002 |
| 7.728 | 0.002 |
| 7.729 | 0.002 |
| 7.73 | 0.002 |
| 7.731 | 0.002 |
| 7.732 | 0.002 |
| 7.733 | 0.002 |
| 7.734 | 0.002 |
| 7.735 | 0.002 |
| 7.736 | 0.002 |
| 7.737 | 0.002 |
| 7.738 | 0.002 |
| 7.739 | 0.002 |
| 7.74 | 0.002 |
| 7.741 | 0.002 |
| 7.742 | 0.002 |
| 7.743 | 0.002 |
| 7.744 | 0.002 |
| 7.745 | 0.002 |
| 7.746 | 0.002 |
| 7.747 | 0.002 |
| 7.748 | 0.001 |
| 7.749 | 0.001 |
| 7.75 | 0.001 |
| 7.751 | 0.001 |
| 7.752 | 0.001 |
| 7.753 | 0.001 |
| 7.753999999999999 | 0.001 |
| 7.755 | 0.001 |
| 7.756 | 0.001 |
| 7.757 | 0.001 |
| 7.758 | 0.001 |
| 7.759 | 0.001 |
| 7.76 | 0.001 |
| 7.761 | 0.001 |
| 7.761999999999999 | 0.001 |
| 7.763 | 0.001 |
| 7.764 | 0.001 |
| 7.765 | 0.001 |
| 7.766 | 0.001 |
| 7.767 | 0.001 |
| 7.768 | 0.001 |
| 7.769 | 0.001 |
| 7.769999999999999 | 0.001 |
| 7.771 | 0.001 |
| 7.772 | 0.001 |
| 7.773 | 0.001 |
| 7.774 | 0.001 |
| 7.775 | 0.001 |
| 7.776 | 0.001 |
| 7.777 | 0.001 |
| 7.778 | 0.001 |
| 7.779 | 0.001 |
| 7.78 | 0.001 |
| 7.781 | 0.001 |
| 7.782 | 0.001 |
| 7.783 | 0.001 |
| 7.784 | 0.001 |
| 7.785 | 0.001 |
| 7.786 | 0.001 |
| 7.787 | 0.001 |
| 7.788 | 0.001 |
| 7.789 | 0.001 |
| 7.79 | 0.001 |
| 7.791 | 0.001 |
| 7.792 | 0.001 |
| 7.793 | 0.001 |
| 7.794 | 0.001 |
| 7.795 | 0.001 |
| 7.796 | 0.001 |
| 7.797 | 0.001 |
| 7.798 | 0.001 |
| 7.799 | 0.001 |
| 7.8 | 0.001 |
| 7.801 | 0.001 |
| 7.802 | 0.001 |
| 7.803 | 0.001 |
| 7.804 | 0.001 |
| 7.805 | 0.001 |
| 7.806 | 0.001 |
| 7.807 | 0.001 |
| 7.808 | 0.001 |
| 7.809 | 0.001 |
| 7.81 | 0.001 |
| 7.811 | 0.001 |
| 7.812 | 0.001 |
| 7.813 | 0.001 |
| 7.814 | 0.001 |
| 7.815 | 0.001 |
| 7.816 | 0.001 |
| 7.817 | 0.001 |
| 7.818 | 0 |
| 7.819 | 0 |
| 7.82 | 0 |
| 7.821 | 0 |
| 7.822 | 0 |
| 7.823 | 0 |
| 7.824 | 0 |
| 7.825 | 0 |
| 7.826 | 0 |
| 7.827 | 0 |
| 7.828 | 0 |
| 7.829 | 0 |
| 7.83 | 0 |
| 7.831 | 0 |
| 7.832 | 0 |
| 7.833 | 0 |
| 7.834 | 0 |
| 7.835 | 0 |
| 7.836 | 0 |
| 7.837 | 0 |
| 7.838 | 0 |
| 7.839 | 0 |
| 7.84 | 0 |
| 7.841 | 0 |
| 7.842 | 0 |
| 7.843 | 0 |
| 7.844 | 0 |
| 7.845 | 0 |
| 7.846 | 0 |
| 7.847 | 0 |
| 7.848 | 0 |
| 7.849 | 0 |
| 7.85 | 0 |
| 7.851 | 0 |
| 7.852 | 0 |
| 7.853 | 0 |
| 7.854 | 0 |
| 7.855 | 0 |
| 7.856 | 0 |
| 7.857 | 0 |
| 7.858 | 0 |
| 7.859 | 0 |
| 7.86 | 0 |
| 7.861 | 0 |
| 7.862 | 0 |
| 7.863 | 0 |
| 7.864 | 0 |
| 7.865 | 0 |
| 7.866 | 0 |
| 7.867 | 0 |
| 7.868 | 0 |
| 7.869 | 0 |
| 7.87 | 0 |
| 7.871 | 0 |
| 7.872 | 0 |
| 7.873 | 0 |
| 7.874 | 0 |
| 7.875 | 0 |
| 7.876 | 0 |
| 7.877 | 0 |
| 7.878 | 0 |
| 7.879 | 0 |
| 7.88 | 0 |
| 7.881 | 0 |
| 7.882 | 0 |
| 7.883 | 0 |
| 7.884 | 0 |
| 7.885 | 0 |
| 7.886 | 0 |
| 7.887 | 0 |
| 7.888 | 0 |
| 7.889 | 0 |
| 7.89 | 0 |
| 7.891 | 0 |
| 7.892 | 0 |
| 7.893 | 0 |
| 7.894 | 0 |
| 7.895 | 0 |
| 7.896 | 0 |
| 7.897 | 0 |
| 7.898 | 0 |
| 7.899 | 0 |
| 7.9 | 0 |
| 7.901 | 0 |
| 7.902 | 0 |
| 7.903 | 0 |
| 7.904 | 0 |
| 7.905 | 0 |
| 7.906 | 0 |
| 7.907 | 0 |
| 7.908 | 0 |
| 7.909 | 0 |
| 7.91 | 0 |
| 7.911 | 0 |
| 7.912 | 0 |
| 7.913 | 0 |
| 7.914 | 0 |
| 7.915 | 0 |
| 7.916 | 0 |
| 7.917 | 0 |
| 7.918 | 0 |
| 7.919 | 0 |
| 7.92 | 0 |
| 7.921 | 0 |
| 7.922 | 0 |
| 7.923 | 0 |
| 7.924 | 0 |
| 7.925 | 0 |
| 7.926 | 0 |
| 7.927 | 0 |
| 7.928 | 0 |
| 7.929 | 0 |
| 7.93 | 0 |
| 7.931 | 0 |
| 7.932 | 0 |
| 7.933 | 0 |
| 7.934 | 0 |
| 7.935 | 0 |
| 7.936 | 0 |
| 7.937 | 0 |
| 7.938 | 0 |
| 7.939 | 0 |
| 7.94 | 0 |
| 7.941 | 0 |
| 7.942 | 0 |
| 7.943 | 0 |
| 7.944 | 0 |
| 7.945 | 0 |
| 7.946 | 0 |
| 7.947 | 0 |
| 7.948 | 0 |
| 7.949 | 0 |
| 7.95 | 0 |
| 7.951 | 0 |
| 7.952 | 0 |
| 7.953 | 0 |
| 7.954 | 0 |
| 7.955 | 0 |
| 7.956 | 0 |
| 7.957 | 0 |
| 7.958 | 0 |
| 7.959 | 0 |
| 7.96 | 0 |
| 7.961 | 0 |
| 7.962 | 0 |
| 7.963 | 0 |
| 7.964 | 0 |
| 7.965 | 0 |
| 7.966 | 0 |
| 7.967 | 0 |
| 7.968 | 0 |
| 7.969 | 0 |
| 7.97 | 0 |
| 7.971 | 0 |
| 7.972 | 0 |
| 7.973 | 0 |
| 7.974 | 0 |
| 7.975 | 0 |
| 7.976 | 0 |
| 7.977 | 0 |
| 7.978 | 0 |
| 7.979 | 0 |
| 7.98 | 0 |
| 7.981 | 0 |
| 7.982 | 0 |
| 7.983 | 0 |
| 7.984 | 0 |
| 7.985 | 0 |
| 7.986 | 0 |
| 7.987 | 0 |
| 7.988 | 0 |
| 7.989 | 0 |
| 7.99 | 0 |
| 7.991 | 0 |
| 7.992 | 0 |
| 7.993 | 0 |
| 7.994 | 0 |
| 7.995 | 0 |
| 7.996 | 0 |
| 7.997 | 0 |
| 7.998 | 0 |
| 7.999 | 0 |
| 8.0 | 0 |
| 8.001 | 0 |
| 8.002 | 0 |
| 8.003 | 0 |
| 8.004 | 0 |
| 8.005 | 0 |
| 8.006 | 0 |
| 8.007 | 0 |
| 8.008 | 0 |
| 8.009 | 0 |
| 8.01 | 0 |
| 8.011 | 0 |
| 8.012 | 0 |
| 8.013 | 0 |
| 8.014 | 0 |
| 8.015 | 0 |
| 8.016 | 0 |
| 8.017 | 0 |
| 8.018 | 0 |
| 8.019 | 0 |
| 8.02 | 0 |
| 8.021 | 0 |
| 8.022 | 0 |
| 8.023 | 0 |
| 8.024 | 0 |
| 8.025 | 0 |
| 8.026 | 0 |
| 8.027 | 0 |
| 8.028 | 0 |
| 8.029 | 0 |
| 8.03 | 0 |
| 8.031 | 0 |
| 8.032 | 0 |
| 8.033 | 0 |
| 8.034 | 0 |
| 8.035 | 0 |
| 8.036 | 0 |
| 8.037 | 0 |
| 8.038 | 0 |
| 8.039 | 0 |
| 8.04 | 0 |
| 8.041 | 0 |
| 8.042 | 0 |
| 8.043 | 0 |
| 8.044 | 0 |
| 8.045 | 0 |
| 8.046 | 0 |
| 8.047 | 0 |
| 8.048 | 0 |
| 8.049 | 0 |
| 8.05 | 0 |
| 8.051 | 0 |
| 8.052 | 0 |
| 8.053 | 0 |
| 8.054 | 0 |
| 8.055 | 0 |
| 8.056 | 0 |
| 8.057 | 0 |
| 8.058 | 0 |
| 8.059 | 0 |
| 8.06 | 0 |
| 8.061 | 0 |
| 8.062 | 0 |
| 8.063 | 0 |
| 8.064 | 0 |
| 8.065 | 0 |
| 8.066 | 0 |
| 8.067 | 0 |
| 8.068 | 0 |
| 8.069 | 0 |
| 8.07 | 0 |
| 8.071 | 0 |
| 8.072 | 0 |
| 8.073 | 0 |
| 8.074 | 0 |
| 8.075 | 0 |
| 8.076 | 0 |
| 8.077 | 0 |
| 8.078 | 0 |
| 8.079 | 0 |
| 8.08 | 0 |
| 8.081 | 0 |
| 8.082 | 0 |
| 8.083 | 0 |
| 8.084 | 0 |
| 8.085 | 0 |
| 8.086 | 0 |
| 8.087 | 0 |
| 8.088 | 0 |
| 8.089 | 0 |
| 8.09 | 0 |
| 8.091 | 0 |
| 8.092 | 0 |
| 8.093 | 0 |
| 8.094 | 0 |
| 8.095 | 0 |
| 8.096 | 0 |
| 8.097 | 0 |
| 8.098 | 0 |
| 8.099 | 0 |
| 8.1 | 0 |
| 8.101 | 0 |
| 8.102 | 0 |
| 8.103 | 0 |
| 8.104 | 0 |
| 8.105 | 0 |
| 8.106 | 0 |
| 8.107 | 0 |
| 8.108 | 0 |
| 8.109 | 0 |
| 8.11 | 0 |
| 8.111 | 0 |
| 8.112 | 0 |
| 8.113 | 0 |
| 8.114 | 0 |
| 8.115 | 0 |
| 8.116 | 0 |
| 8.117 | 0 |
| 8.118 | 0 |
| 8.119 | 0 |
| 8.12 | 0 |
| 8.121 | 0 |
| 8.122 | 0 |
| 8.123 | 0 |
| 8.124 | 0 |
| 8.125 | 0 |
| 8.126 | 0 |
| 8.127 | 0 |
| 8.128 | 0 |
| 8.129 | 0 |
| 8.13 | 0 |
| 8.131 | 0 |
| 8.132 | 0 |
| 8.133 | 0 |
| 8.134 | 0 |
| 8.135 | 0 |
| 8.136 | 0 |
| 8.137 | 0 |
| 8.138 | 0 |
| 8.139 | 0 |
| 8.14 | 0 |
| 8.141 | 0 |
| 8.142 | 0 |
| 8.143 | 0 |
| 8.144 | 0 |
| 8.145 | 0 |
| 8.146 | 0 |
| 8.147 | 0 |
| 8.148 | 0 |
| 8.149 | 0 |
| 8.15 | 0 |
| 8.151 | 0 |
| 8.152 | 0 |
| 8.153 | 0 |
| 8.154 | 0 |
| 8.155 | 0 |
| 8.156 | 0 |
| 8.157 | 0 |
| 8.158 | 0 |
| 8.159 | 0 |
| 8.16 | 0 |
| 8.161 | 0 |
| 8.162 | 0 |
| 8.163 | 0 |
| 8.164 | 0 |
| 8.165 | 0 |
| 8.166 | 0 |
| 8.167 | 0 |
| 8.168 | 0 |
| 8.169 | 0 |
| 8.17 | 0 |
| 8.171 | 0 |
| 8.172 | 0 |
| 8.173 | 0 |
| 8.174 | 0 |
| 8.175 | 0 |
| 8.176 | 0 |
| 8.177 | 0 |
| 8.178 | 0 |
| 8.179 | 0 |
| 8.18 | 0 |
| 8.181 | 0 |
| 8.182 | 0 |
| 8.183 | 0 |
| 8.184 | 0 |
| 8.185 | 0 |
| 8.186 | 0 |
| 8.187 | 0 |
| 8.188 | 0 |
| 8.189 | 0 |
| 8.19 | 0 |
| 8.191 | 0 |
| 8.192 | 0 |
| 8.193 | 0 |
| 8.194 | 0.001 |
| 8.195 | 0.001 |
| 8.196 | 0.001 |
| 8.197 | 0.001 |
| 8.198 | 0.001 |
| 8.199 | 0.001 |
| 8.2 | 0.001 |
| 8.201 | 0.001 |
| 8.202 | 0.001 |
| 8.203 | 0.001 |
| 8.204 | 0.001 |
| 8.205 | 0.001 |
| 8.206 | 0.001 |
| 8.207 | 0.001 |
| 8.208 | 0.001 |
| 8.209 | 0.001 |
| 8.21 | 0.001 |
| 8.211 | 0.001 |
| 8.212 | 0.001 |
| 8.213 | 0.001 |
| 8.214 | 0.001 |
| 8.215 | 0.001 |
| 8.216 | 0.001 |
| 8.217 | 0.001 |
| 8.218 | 0.001 |
| 8.219 | 0.001 |
| 8.22 | 0.001 |
| 8.221 | 0.001 |
| 8.222 | 0.001 |
| 8.223 | 0.001 |
| 8.224 | 0.001 |
| 8.225 | 0.001 |
| 8.226 | 0.001 |
| 8.227 | 0.001 |
| 8.228 | 0.001 |
| 8.229 | 0.001 |
| 8.23 | 0.001 |
| 8.231 | 0.001 |
| 8.232 | 0.001 |
| 8.233 | 0.001 |
| 8.234 | 0.001 |
| 8.235 | 0.001 |
| 8.236 | 0.001 |
| 8.237 | 0.001 |
| 8.238 | 0.001 |
| 8.239 | 0.001 |
| 8.24 | 0.001 |
| 8.241 | 0.001 |
| 8.242 | 0.001 |
| 8.243 | 0.001 |
| 8.244 | 0.001 |
| 8.245 | 0.001 |
| 8.246 | 0.001 |
| 8.247 | 0.001 |
| 8.248 | 0.001 |
| 8.249 | 0.001 |
| 8.25 | 0.001 |
| 8.251 | 0.001 |
| 8.252 | 0.001 |
| 8.253 | 0.001 |
| 8.254 | 0.001 |
| 8.255 | 0.001 |
| 8.256 | 0.001 |
| 8.257 | 0.001 |
| 8.258 | 0.001 |
| 8.259 | 0.001 |
| 8.26 | 0.001 |
| 8.261 | 0.001 |
| 8.262 | 0.001 |
| 8.263 | 0.001 |
| 8.264 | 0.001 |
| 8.265 | 0.002 |
| 8.266 | 0.002 |
| 8.267 | 0.002 |
| 8.268 | 0.002 |
| 8.269 | 0.002 |
| 8.27 | 0.002 |
| 8.271 | 0.002 |
| 8.272 | 0.002 |
| 8.273 | 0.002 |
| 8.274 | 0.002 |
| 8.275 | 0.002 |
| 8.276 | 0.002 |
| 8.277 | 0.002 |
| 8.278 | 0.002 |
| 8.279 | 0.002 |
| 8.28 | 0.002 |
| 8.281 | 0.002 |
| 8.282 | 0.002 |
| 8.283 | 0.002 |
| 8.284 | 0.002 |
| 8.285 | 0.002 |
| 8.286 | 0.002 |
| 8.287 | 0.002 |
| 8.288 | 0.002 |
| 8.289 | 0.002 |
| 8.29 | 0.002 |
| 8.291 | 0.002 |
| 8.292 | 0.002 |
| 8.293 | 0.002 |
| 8.294 | 0.002 |
| 8.295 | 0.002 |
| 8.296 | 0.002 |
| 8.297 | 0.002 |
| 8.298 | 0.002 |
| 8.299 | 0.002 |
| 8.3 | 0.002 |
| 8.301 | 0.003 |
| 8.302 | 0.003 |
| 8.303 | 0.003 |
| 8.304 | 0.003 |
| 8.305 | 0.003 |
| 8.306 | 0.003 |
| 8.307 | 0.003 |
| 8.308 | 0.003 |
| 8.309 | 0.003 |
| 8.31 | 0.003 |
| 8.311 | 0.003 |
| 8.312 | 0.003 |
| 8.313 | 0.003 |
| 8.314 | 0.003 |
| 8.315 | 0.003 |
| 8.316 | 0.003 |
| 8.317 | 0.003 |
| 8.318 | 0.003 |
| 8.319 | 0.003 |
| 8.32 | 0.003 |
| 8.321 | 0.003 |
| 8.322 | 0.003 |
| 8.323 | 0.003 |
| 8.324 | 0.003 |
| 8.325 | 0.004 |
| 8.326 | 0.004 |
| 8.327 | 0.004 |
| 8.328 | 0.004 |
| 8.329 | 0.004 |
| 8.33 | 0.004 |
| 8.331 | 0.004 |
| 8.332 | 0.004 |
| 8.333 | 0.004 |
| 8.334 | 0.004 |
| 8.335 | 0.004 |
| 8.336 | 0.004 |
| 8.337 | 0.004 |
| 8.338 | 0.004 |
| 8.339 | 0.004 |
| 8.34 | 0.004 |
| 8.341 | 0.004 |
| 8.342 | 0.004 |
| 8.343 | 0.004 |
| 8.344 | 0.005 |
| 8.345 | 0.005 |
| 8.346 | 0.005 |
| 8.347 | 0.005 |
| 8.348 | 0.005 |
| 8.349 | 0.005 |
| 8.35 | 0.005 |
| 8.351 | 0.005 |
| 8.352 | 0.005 |
| 8.353 | 0.005 |
| 8.354 | 0.005 |
| 8.355 | 0.005 |
| 8.356 | 0.005 |
| 8.357 | 0.005 |
| 8.358 | 0.005 |
| 8.359 | 0.005 |
| 8.36 | 0.006 |
| 8.361 | 0.006 |
| 8.362 | 0.006 |
| 8.363 | 0.006 |
| 8.364 | 0.006 |
| 8.365 | 0.006 |
| 8.366 | 0.006 |
| 8.367 | 0.006 |
| 8.368 | 0.006 |
| 8.369 | 0.006 |
| 8.37 | 0.006 |
| 8.371 | 0.006 |
| 8.372 | 0.006 |
| 8.373 | 0.007 |
| 8.374 | 0.007 |
| 8.375 | 0.007 |
| 8.376 | 0.007 |
| 8.377 | 0.007 |
| 8.378 | 0.007 |
| 8.379 | 0.007 |
| 8.38 | 0.007 |
| 8.381 | 0.007 |
| 8.382 | 0.007 |
| 8.383 | 0.007 |
| 8.384 | 0.007 |
| 8.385 | 0.008 |
| 8.386 | 0.008 |
| 8.387 | 0.008 |
| 8.388 | 0.008 |
| 8.389 | 0.008 |
| 8.39 | 0.008 |
| 8.391 | 0.008 |
| 8.392 | 0.008 |
| 8.393 | 0.008 |
| 8.394 | 0.008 |
| 8.395 | 0.009 |
| 8.396 | 0.009 |
| 8.397 | 0.009 |
| 8.398 | 0.009 |
| 8.399 | 0.009 |
| 8.4 | 0.009 |
| 8.401 | 0.009 |
| 8.402 | 0.009 |
| 8.403 | 0.009 |
| 8.404 | 0.01 |
| 8.405 | 0.01 |
| 8.406 | 0.01 |
| 8.407 | 0.01 |
| 8.408 | 0.01 |
| 8.409 | 0.01 |
| 8.41 | 0.01 |
| 8.411 | 0.01 |
| 8.412 | 0.011 |
| 8.413 | 0.011 |
| 8.414 | 0.011 |
| 8.415 | 0.011 |
| 8.416 | 0.011 |
| 8.417 | 0.011 |
| 8.418 | 0.011 |
| 8.419 | 0.011 |
| 8.42 | 0.012 |
| 8.421 | 0.012 |
| 8.422 | 0.012 |
| 8.423 | 0.012 |
| 8.424 | 0.012 |
| 8.425 | 0.012 |
| 8.426 | 0.012 |
| 8.427 | 0.013 |
| 8.428 | 0.013 |
| 8.429 | 0.013 |
| 8.43 | 0.013 |
| 8.431 | 0.013 |
| 8.432 | 0.013 |
| 8.433 | 0.013 |
| 8.434 | 0.014 |
| 8.435 | 0.014 |
| 8.436 | 0.014 |
| 8.437 | 0.014 |
| 8.438 | 0.014 |
| 8.439 | 0.014 |
| 8.44 | 0.014 |
| 8.441 | 0.015 |
| 8.442 | 0.015 |
| 8.443 | 0.015 |
| 8.444 | 0.015 |
| 8.445 | 0.015 |
| 8.446 | 0.015 |
| 8.447 | 0.016 |
| 8.448 | 0.016 |
| 8.449 | 0.016 |
| 8.45 | 0.016 |
| 8.451 | 0.016 |
| 8.452 | 0.017 |
| 8.453 | 0.017 |
| 8.454 | 0.017 |
| 8.455 | 0.017 |
| 8.456 | 0.017 |
| 8.457 | 0.017 |
| 8.458 | 0.018 |
| 8.459 | 0.018 |
| 8.46 | 0.018 |
| 8.461 | 0.018 |
| 8.462 | 0.018 |
| 8.463 | 0.019 |
| 8.464 | 0.019 |
| 8.465 | 0.019 |
| 8.466 | 0.019 |
| 8.467 | 0.019 |
| 8.468 | 0.02 |
| 8.469 | 0.02 |
| 8.47 | 0.02 |
| 8.471 | 0.02 |
| 8.472 | 0.021 |
| 8.473 | 0.021 |
| 8.474 | 0.021 |
| 8.475 | 0.021 |
| 8.476 | 0.021 |
| 8.477 | 0.022 |
| 8.478 | 0.022 |
| 8.479 | 0.022 |
| 8.48 | 0.022 |
| 8.481 | 0.023 |
| 8.482 | 0.023 |
| 8.483 | 0.023 |
| 8.484 | 0.023 |
| 8.485 | 0.023 |
| 8.486 | 0.024 |
| 8.487 | 0.024 |
| 8.488 | 0.024 |
| 8.489 | 0.024 |
| 8.49 | 0.025 |
| 8.491 | 0.025 |
| 8.492 | 0.025 |
| 8.493 | 0.025 |
| 8.494 | 0.026 |
| 8.495 | 0.026 |
| 8.496 | 0.026 |
| 8.497 | 0.027 |
| 8.498 | 0.027 |
| 8.499 | 0.027 |
| 8.5 | 0.027 |
| 8.501 | 0.028 |
| 8.502 | 0.028 |
| 8.503 | 0.028 |
| 8.504 | 0.028 |
| 8.505 | 0.029 |
| 8.506 | 0.029 |
| 8.507 | 0.029 |
| 8.508 | 0.03 |
| 8.509 | 0.03 |
| 8.51 | 0.03 |
| 8.511 | 0.031 |
| 8.512 | 0.031 |
| 8.513 | 0.031 |
| 8.514 | 0.031 |
| 8.515 | 0.032 |
| 8.516 | 0.032 |
| 8.517 | 0.032 |
| 8.518 | 0.033 |
| 8.519 | 0.033 |
| 8.52 | 0.033 |
| 8.521 | 0.034 |
| 8.522 | 0.034 |
| 8.523 | 0.034 |
| 8.524 | 0.035 |
| 8.525 | 0.035 |
| 8.526 | 0.035 |
| 8.527 | 0.036 |
| 8.528 | 0.036 |
| 8.529 | 0.036 |
| 8.53 | 0.037 |
| 8.531 | 0.037 |
| 8.532 | 0.037 |
| 8.533 | 0.038 |
| 8.534 | 0.038 |
| 8.535 | 0.038 |
| 8.536 | 0.039 |
| 8.537 | 0.039 |
| 8.538 | 0.039 |
| 8.539 | 0.04 |
| 8.54 | 0.04 |
| 8.541 | 0.041 |
| 8.542 | 0.041 |
| 8.543 | 0.041 |
| 8.544 | 0.042 |
| 8.545 | 0.042 |
| 8.546 | 0.042 |
| 8.547 | 0.043 |
| 8.548 | 0.043 |
| 8.549 | 0.044 |
| 8.55 | 0.044 |
| 8.551 | 0.044 |
| 8.552 | 0.045 |
| 8.553 | 0.045 |
| 8.554 | 0.046 |
| 8.555 | 0.046 |
| 8.556 | 0.046 |
| 8.557 | 0.047 |
| 8.558 | 0.047 |
| 8.559 | 0.048 |
| 8.56 | 0.048 |
| 8.561 | 0.049 |
| 8.562 | 0.049 |
| 8.563 | 0.049 |
| 8.564 | 0.05 |
| 8.565 | 0.05 |
| 8.566 | 0.051 |
| 8.567 | 0.051 |
| 8.568 | 0.052 |
| 8.569 | 0.052 |
| 8.57 | 0.052 |
| 8.571 | 0.053 |
| 8.572 | 0.053 |
| 8.573 | 0.054 |
| 8.574 | 0.054 |
| 8.575 | 0.055 |
| 8.576 | 0.055 |
| 8.577 | 0.056 |
| 8.578 | 0.056 |
| 8.579 | 0.057 |
| 8.58 | 0.057 |
| 8.581 | 0.058 |
| 8.582 | 0.058 |
| 8.583 | 0.059 |
| 8.584 | 0.059 |
| 8.585 | 0.06 |
| 8.586 | 0.06 |
| 8.587 | 0.061 |
| 8.588 | 0.061 |
| 8.589 | 0.062 |
| 8.59 | 0.062 |
| 8.591 | 0.063 |
| 8.592 | 0.063 |
| 8.593 | 0.064 |
| 8.594 | 0.064 |
| 8.595 | 0.065 |
| 8.596 | 0.065 |
| 8.597 | 0.066 |
| 8.598 | 0.066 |
| 8.599 | 0.067 |
| 8.6 | 0.067 |
| 8.601 | 0.068 |
| 8.602 | 0.068 |
| 8.603 | 0.069 |
| 8.604 | 0.069 |
| 8.605 | 0.07 |
| 8.606 | 0.071 |
| 8.607 | 0.071 |
| 8.608 | 0.072 |
| 8.609 | 0.072 |
| 8.61 | 0.073 |
| 8.611 | 0.073 |
| 8.612 | 0.074 |
| 8.613 | 0.075 |
| 8.614 | 0.075 |
| 8.615 | 0.076 |
| 8.616 | 0.076 |
| 8.617 | 0.077 |
| 8.618 | 0.077 |
| 8.619 | 0.078 |
| 8.62 | 0.079 |
| 8.621 | 0.079 |
| 8.622 | 0.08 |
| 8.623 | 0.08 |
| 8.624 | 0.081 |
| 8.625 | 0.082 |
| 8.626 | 0.082 |
| 8.627 | 0.083 |
| 8.628 | 0.084 |
| 8.629 | 0.084 |
| 8.63 | 0.085 |
| 8.631 | 0.085 |
| 8.632 | 0.086 |
| 8.633 | 0.087 |
| 8.634 | 0.087 |
| 8.635 | 0.088 |
| 8.636 | 0.089 |
| 8.637 | 0.089 |
| 8.638 | 0.09 |
| 8.639 | 0.091 |
| 8.64 | 0.091 |
| 8.641 | 0.092 |
| 8.642 | 0.093 |
| 8.643 | 0.093 |
| 8.644 | 0.094 |
| 8.645 | 0.095 |
| 8.646 | 0.095 |
| 8.647 | 0.096 |
| 8.648 | 0.097 |
| 8.649 | 0.097 |
| 8.65 | 0.098 |
| 8.651 | 0.099 |
| 8.652 | 0.099 |
| 8.653 | 0.1 |
| 8.654 | 0.101 |
| 8.655 | 0.101 |
| 8.656 | 0.102 |
| 8.657 | 0.103 |
| 8.658 | 0.103 |
| 8.659 | 0.104 |
| 8.66 | 0.105 |
| 8.661 | 0.106 |
| 8.662 | 0.106 |
| 8.663 | 0.107 |
| 8.664 | 0.108 |
| 8.665 | 0.109 |
| 8.666 | 0.109 |
| 8.667 | 0.11 |
| 8.668 | 0.111 |
| 8.669 | 0.111 |
| 8.67 | 0.112 |
| 8.671 | 0.113 |
| 8.672 | 0.114 |
| 8.673 | 0.114 |
| 8.674 | 0.115 |
| 8.675 | 0.116 |
| 8.676 | 0.117 |
| 8.677 | 0.117 |
| 8.678 | 0.118 |
| 8.679 | 0.119 |
| 8.68 | 0.12 |
| 8.681 | 0.12 |
| 8.682 | 0.121 |
| 8.683 | 0.122 |
| 8.684 | 0.123 |
| 8.685 | 0.124 |
| 8.686 | 0.124 |
| 8.687 | 0.125 |
| 8.688 | 0.126 |
| 8.689 | 0.127 |
| 8.69 | 0.128 |
| 8.691 | 0.128 |
| 8.692 | 0.129 |
| 8.693 | 0.13 |
| 8.694 | 0.131 |
| 8.695 | 0.131 |
| 8.696 | 0.132 |
| 8.697 | 0.133 |
| 8.698 | 0.134 |
| 8.699 | 0.135 |
| 8.7 | 0.136 |
| 8.701 | 0.136 |
| 8.702 | 0.137 |
| 8.703 | 0.138 |
| 8.704 | 0.139 |
| 8.705 | 0.14 |
| 8.706 | 0.14 |
| 8.707 | 0.141 |
| 8.708 | 0.142 |
| 8.709 | 0.143 |
| 8.71 | 0.144 |
| 8.711 | 0.145 |
| 8.712 | 0.145 |
| 8.713 | 0.146 |
| 8.714 | 0.147 |
| 8.715 | 0.148 |
| 8.716 | 0.149 |
| 8.717 | 0.15 |
| 8.718 | 0.15 |
| 8.719 | 0.151 |
| 8.72 | 0.152 |
| 8.721 | 0.153 |
| 8.722 | 0.154 |
| 8.723 | 0.155 |
| 8.724 | 0.156 |
| 8.725 | 0.156 |
| 8.726 | 0.157 |
| 8.727 | 0.158 |
| 8.728 | 0.159 |
| 8.729 | 0.16 |
| 8.73 | 0.161 |
| 8.731 | 0.162 |
| 8.732 | 0.163 |
| 8.733 | 0.163 |
| 8.734 | 0.164 |
| 8.735 | 0.165 |
| 8.736 | 0.166 |
| 8.737 | 0.167 |
| 8.738 | 0.168 |
| 8.739 | 0.169 |
| 8.74 | 0.17 |
| 8.741 | 0.17 |
| 8.742 | 0.171 |
| 8.743 | 0.172 |
| 8.744 | 0.173 |
| 8.745 | 0.174 |
| 8.746 | 0.175 |
| 8.747 | 0.176 |
| 8.748 | 0.177 |
| 8.749 | 0.178 |
| 8.75 | 0.178 |
| 8.751 | 0.179 |
| 8.752 | 0.18 |
| 8.753 | 0.181 |
| 8.754 | 0.182 |
| 8.755 | 0.183 |
| 8.756 | 0.184 |
| 8.757 | 0.185 |
| 8.758 | 0.186 |
| 8.759 | 0.186 |
| 8.76 | 0.187 |
| 8.761 | 0.188 |
| 8.762 | 0.189 |
| 8.763 | 0.19 |
| 8.764 | 0.191 |
| 8.765 | 0.192 |
| 8.766 | 0.193 |
| 8.767 | 0.194 |
| 8.768 | 0.195 |
| 8.769 | 0.195 |
| 8.77 | 0.196 |
| 8.771 | 0.197 |
| 8.772 | 0.198 |
| 8.773 | 0.199 |
| 8.774 | 0.2 |
| 8.775 | 0.201 |
| 8.776 | 0.202 |
| 8.777 | 0.203 |
| 8.778 | 0.204 |
| 8.779 | 0.205 |
| 8.78 | 0.205 |
| 8.781 | 0.206 |
| 8.782 | 0.207 |
| 8.783 | 0.208 |
| 8.784 | 0.209 |
| 8.785 | 0.21 |
| 8.786 | 0.211 |
| 8.787 | 0.212 |
| 8.788 | 0.213 |
| 8.789 | 0.214 |
| 8.79 | 0.214 |
| 8.791 | 0.215 |
| 8.792 | 0.216 |
| 8.793 | 0.217 |
| 8.794 | 0.218 |
| 8.795 | 0.219 |
| 8.796 | 0.22 |
| 8.797 | 0.221 |
| 8.798 | 0.222 |
| 8.799 | 0.223 |
| 8.8 | 0.223 |
| 8.801 | 0.224 |
| 8.802 | 0.225 |
| 8.803 | 0.226 |
| 8.804 | 0.227 |
| 8.805 | 0.228 |
| 8.806 | 0.229 |
| 8.807 | 0.23 |
| 8.808 | 0.231 |
| 8.809 | 0.231 |
| 8.81 | 0.232 |
| 8.811 | 0.233 |
| 8.812 | 0.234 |
| 8.813 | 0.235 |
| 8.814 | 0.236 |
| 8.815 | 0.237 |
| 8.816 | 0.238 |
| 8.817 | 0.238 |
| 8.818 | 0.239 |
| 8.819 | 0.24 |
| 8.82 | 0.241 |
| 8.821 | 0.242 |
| 8.822 | 0.243 |
| 8.823 | 0.244 |
| 8.824 | 0.245 |
| 8.825 | 0.245 |
| 8.826 | 0.246 |
| 8.827 | 0.247 |
| 8.828 | 0.248 |
| 8.829 | 0.249 |
| 8.83 | 0.25 |
| 8.831 | 0.251 |
| 8.832 | 0.251 |
| 8.833 | 0.252 |
| 8.834 | 0.253 |
| 8.835 | 0.254 |
| 8.836 | 0.255 |
| 8.837 | 0.256 |
| 8.838 | 0.256 |
| 8.839 | 0.257 |
| 8.84 | 0.258 |
| 8.841 | 0.259 |
| 8.842 | 0.26 |
| 8.843 | 0.261 |
| 8.844 | 0.261 |
| 8.845 | 0.262 |
| 8.846 | 0.263 |
| 8.847 | 0.264 |
| 8.848 | 0.265 |
| 8.849 | 0.265 |
| 8.85 | 0.266 |
| 8.851 | 0.267 |
| 8.852 | 0.268 |
| 8.853 | 0.269 |
| 8.854 | 0.269 |
| 8.855 | 0.27 |
| 8.856 | 0.271 |
| 8.857 | 0.272 |
| 8.858 | 0.272 |
| 8.859 | 0.273 |
| 8.86 | 0.274 |
| 8.861 | 0.275 |
| 8.862 | 0.276 |
| 8.863 | 0.276 |
| 8.864 | 0.277 |
| 8.865 | 0.278 |
| 8.866 | 0.279 |
| 8.867 | 0.279 |
| 8.868 | 0.28 |
| 8.869 | 0.281 |
| 8.87 | 0.282 |
| 8.871 | 0.282 |
| 8.872 | 0.283 |
| 8.873 | 0.284 |
| 8.874 | 0.284 |
| 8.875 | 0.285 |
| 8.876 | 0.286 |
| 8.877 | 0.287 |
| 8.878 | 0.287 |
| 8.879 | 0.288 |
| 8.88 | 0.289 |
| 8.881 | 0.289 |
| 8.882 | 0.29 |
| 8.883 | 0.291 |
| 8.884 | 0.291 |
| 8.885 | 0.292 |
| 8.886 | 0.293 |
| 8.887 | 0.293 |
| 8.888 | 0.294 |
| 8.889 | 0.295 |
| 8.89 | 0.295 |
| 8.891 | 0.296 |
| 8.892 | 0.297 |
| 8.893 | 0.297 |
| 8.894 | 0.298 |
| 8.895 | 0.299 |
| 8.896 | 0.299 |
| 8.897 | 0.3 |
| 8.898 | 0.3 |
| 8.899 | 0.301 |
| 8.9 | 0.302 |
| 8.901 | 0.302 |
| 8.902 | 0.303 |
| 8.903 | 0.303 |
| 8.904 | 0.304 |
| 8.905 | 0.305 |
| 8.906 | 0.305 |
| 8.907 | 0.306 |
| 8.908 | 0.306 |
| 8.909 | 0.307 |
| 8.91 | 0.307 |
| 8.911 | 0.308 |
| 8.912 | 0.308 |
| 8.913 | 0.309 |
| 8.914 | 0.31 |
| 8.915 | 0.31 |
| 8.916 | 0.311 |
| 8.917 | 0.311 |
| 8.918 | 0.312 |
| 8.919 | 0.312 |
| 8.92 | 0.313 |
| 8.921 | 0.313 |
| 8.922 | 0.314 |
| 8.923 | 0.314 |
| 8.924 | 0.315 |
| 8.925 | 0.315 |
| 8.926 | 0.316 |
| 8.927 | 0.316 |
| 8.928 | 0.316 |
| 8.929 | 0.317 |
| 8.93 | 0.317 |
| 8.931 | 0.318 |
| 8.932 | 0.318 |
| 8.933 | 0.319 |
| 8.934 | 0.319 |
| 8.935 | 0.32 |
| 8.936 | 0.32 |
| 8.937 | 0.32 |
| 8.938 | 0.321 |
| 8.939 | 0.321 |
| 8.94 | 0.322 |
| 8.941 | 0.322 |
| 8.942 | 0.322 |
| 8.943 | 0.323 |
| 8.944 | 0.323 |
| 8.945 | 0.323 |
| 8.946 | 0.324 |
| 8.947 | 0.324 |
| 8.948 | 0.324 |
| 8.949 | 0.325 |
| 8.95 | 0.325 |
| 8.951 | 0.325 |
| 8.952 | 0.326 |
| 8.953 | 0.326 |
| 8.954 | 0.326 |
| 8.955 | 0.327 |
| 8.956 | 0.327 |
| 8.957 | 0.327 |
| 8.958 | 0.328 |
| 8.959 | 0.328 |
| 8.96 | 0.328 |
| 8.961 | 0.328 |
| 8.962 | 0.329 |
| 8.963 | 0.329 |
| 8.964 | 0.329 |
| 8.965 | 0.329 |
| 8.966 | 0.33 |
| 8.967 | 0.33 |
| 8.968 | 0.33 |
| 8.969 | 0.33 |
| 8.97 | 0.33 |
| 8.971 | 0.331 |
| 8.972 | 0.331 |
| 8.973 | 0.331 |
| 8.974 | 0.331 |
| 8.975 | 0.331 |
| 8.976 | 0.331 |
| 8.977 | 0.332 |
| 8.978 | 0.332 |
| 8.979 | 0.332 |
| 8.98 | 0.332 |
| 8.981 | 0.332 |
| 8.982 | 0.332 |
| 8.983 | 0.332 |
| 8.984 | 0.332 |
| 8.985 | 0.333 |
| 8.986 | 0.333 |
| 8.987 | 0.333 |
| 8.988 | 0.333 |
| 8.989 | 0.333 |
| 8.99 | 0.333 |
| 8.991 | 0.333 |
| 8.992 | 0.333 |
| 8.993 | 0.333 |
| 8.994 | 0.333 |
| 8.995 | 0.333 |
| 8.996 | 0.333 |
| 8.997 | 0.333 |
| 8.998 | 0.333 |
| 8.999 | 0.333 |
| 9.0 | 0.333 |
| 9.001 | 0.333 |
| 9.002 | 0.333 |
| 9.003 | 0.333 |
| 9.004 | 0.333 |
| 9.005 | 0.333 |
| 9.006 | 0.333 |
| 9.007 | 0.333 |
| 9.008 | 0.333 |
| 9.009 | 0.333 |
| 9.01 | 0.333 |
| 9.011 | 0.333 |
| 9.012 | 0.333 |
| 9.013 | 0.333 |
| 9.014 | 0.333 |
| 9.015 | 0.333 |
| 9.016 | 0.332 |
| 9.017 | 0.332 |
| 9.018 | 0.332 |
| 9.019 | 0.332 |
| 9.02 | 0.332 |
| 9.021 | 0.332 |
| 9.022 | 0.332 |
| 9.023 | 0.332 |
| 9.024 | 0.331 |
| 9.025 | 0.331 |
| 9.026 | 0.331 |
| 9.027 | 0.331 |
| 9.028 | 0.331 |
| 9.029 | 0.331 |
| 9.03 | 0.33 |
| 9.031 | 0.33 |
| 9.032 | 0.33 |
| 9.033 | 0.33 |
| 9.034 | 0.33 |
| 9.035 | 0.329 |
| 9.036 | 0.329 |
| 9.037 | 0.329 |
| 9.038 | 0.329 |
| 9.039 | 0.328 |
| 9.04 | 0.328 |
| 9.041 | 0.328 |
| 9.042 | 0.328 |
| 9.043 | 0.327 |
| 9.044 | 0.327 |
| 9.045 | 0.327 |
| 9.046 | 0.326 |
| 9.047 | 0.326 |
| 9.048 | 0.326 |
| 9.049 | 0.325 |
| 9.05 | 0.325 |
| 9.051 | 0.325 |
| 9.052 | 0.324 |
| 9.053 | 0.324 |
| 9.054 | 0.324 |
| 9.055 | 0.323 |
| 9.056 | 0.323 |
| 9.057 | 0.323 |
| 9.058 | 0.322 |
| 9.059 | 0.322 |
| 9.06 | 0.322 |
| 9.061 | 0.321 |
| 9.062 | 0.321 |
| 9.063 | 0.32 |
| 9.064 | 0.32 |
| 9.065 | 0.32 |
| 9.066 | 0.319 |
| 9.067 | 0.319 |
| 9.068 | 0.318 |
| 9.069 | 0.318 |
| 9.07 | 0.317 |
| 9.071 | 0.317 |
| 9.072 | 0.316 |
| 9.073 | 0.316 |
| 9.074 | 0.316 |
| 9.075 | 0.315 |
| 9.076 | 0.315 |
| 9.077 | 0.314 |
| 9.078 | 0.314 |
| 9.079 | 0.313 |
| 9.08 | 0.313 |
| 9.081 | 0.312 |
| 9.082 | 0.312 |
| 9.083 | 0.311 |
| 9.084 | 0.311 |
| 9.085 | 0.31 |
| 9.086 | 0.31 |
| 9.087 | 0.309 |
| 9.088 | 0.308 |
| 9.089 | 0.308 |
| 9.09 | 0.307 |
| 9.091 | 0.307 |
| 9.092 | 0.306 |
| 9.093 | 0.306 |
| 9.094 | 0.305 |
| 9.095 | 0.305 |
| 9.096 | 0.304 |
| 9.097 | 0.303 |
| 9.098 | 0.303 |
| 9.099 | 0.302 |
| 9.1 | 0.302 |
| 9.101 | 0.301 |
| 9.102 | 0.3 |
| 9.103 | 0.3 |
| 9.104 | 0.299 |
| 9.105 | 0.299 |
| 9.106 | 0.298 |
| 9.107 | 0.297 |
| 9.108 | 0.297 |
| 9.109 | 0.296 |
| 9.11 | 0.295 |
| 9.111 | 0.295 |
| 9.112 | 0.294 |
| 9.113 | 0.293 |
| 9.114 | 0.293 |
| 9.115 | 0.292 |
| 9.116 | 0.291 |
| 9.117 | 0.291 |
| 9.118 | 0.29 |
| 9.119 | 0.289 |
| 9.12 | 0.289 |
| 9.121 | 0.288 |
| 9.122 | 0.287 |
| 9.123 | 0.287 |
| 9.124 | 0.286 |
| 9.125 | 0.285 |
| 9.126 | 0.284 |
| 9.127 | 0.284 |
| 9.128 | 0.283 |
| 9.129 | 0.282 |
| 9.13 | 0.282 |
| 9.131 | 0.281 |
| 9.132 | 0.28 |
| 9.133 | 0.279 |
| 9.134 | 0.279 |
| 9.135 | 0.278 |
| 9.136 | 0.277 |
| 9.137 | 0.276 |
| 9.138 | 0.276 |
| 9.139 | 0.275 |
| 9.14 | 0.274 |
| 9.141 | 0.273 |
| 9.142 | 0.272 |
| 9.143 | 0.272 |
| 9.144 | 0.271 |
| 9.145 | 0.27 |
| 9.146 | 0.269 |
| 9.147 | 0.269 |
| 9.148 | 0.268 |
| 9.149 | 0.267 |
| 9.15 | 0.266 |
| 9.151 | 0.265 |
| 9.152 | 0.265 |
| 9.153 | 0.264 |
| 9.154 | 0.263 |
| 9.155 | 0.262 |
| 9.156 | 0.261 |
| 9.157 | 0.261 |
| 9.158 | 0.26 |
| 9.159 | 0.259 |
| 9.16 | 0.258 |
| 9.161 | 0.257 |
| 9.162 | 0.256 |
| 9.163 | 0.256 |
| 9.164 | 0.255 |
| 9.165 | 0.254 |
| 9.166 | 0.253 |
| 9.167 | 0.252 |
| 9.168 | 0.251 |
| 9.169 | 0.251 |
| 9.17 | 0.25 |
| 9.171 | 0.249 |
| 9.172 | 0.248 |
| 9.173 | 0.247 |
| 9.174 | 0.246 |
| 9.175 | 0.245 |
| 9.176 | 0.245 |
| 9.177 | 0.244 |
| 9.178 | 0.243 |
| 9.179 | 0.242 |
| 9.18 | 0.241 |
| 9.181 | 0.24 |
| 9.182 | 0.239 |
| 9.183 | 0.238 |
| 9.184 | 0.238 |
| 9.185 | 0.237 |
| 9.186 | 0.236 |
| 9.187 | 0.235 |
| 9.188 | 0.234 |
| 9.189 | 0.233 |
| 9.19 | 0.232 |
| 9.191 | 0.231 |
| 9.192 | 0.231 |
| 9.193 | 0.23 |
| 9.194 | 0.229 |
| 9.195 | 0.228 |
| 9.196 | 0.227 |
| 9.197 | 0.226 |
| 9.198 | 0.225 |
| 9.199 | 0.224 |
| 9.2 | 0.223 |
| 9.201 | 0.223 |
| 9.202 | 0.222 |
| 9.203 | 0.221 |
| 9.204 | 0.22 |
| 9.205 | 0.219 |
| 9.206 | 0.218 |
| 9.207 | 0.217 |
| 9.208 | 0.216 |
| 9.209 | 0.215 |
| 9.21 | 0.214 |
| 9.211 | 0.214 |
| 9.212 | 0.213 |
| 9.213 | 0.212 |
| 9.214 | 0.211 |
| 9.215 | 0.21 |
| 9.216 | 0.209 |
| 9.217 | 0.208 |
| 9.218 | 0.207 |
| 9.219 | 0.206 |
| 9.22 | 0.205 |
| 9.221 | 0.205 |
| 9.222 | 0.204 |
| 9.223 | 0.203 |
| 9.224 | 0.202 |
| 9.225 | 0.201 |
| 9.226 | 0.2 |
| 9.227 | 0.199 |
| 9.228 | 0.198 |
| 9.229 | 0.197 |
| 9.23 | 0.196 |
| 9.231 | 0.195 |
| 9.232 | 0.195 |
| 9.233 | 0.194 |
| 9.234 | 0.193 |
| 9.235 | 0.192 |
| 9.236 | 0.191 |
| 9.237 | 0.19 |
| 9.238 | 0.189 |
| 9.239 | 0.188 |
| 9.24 | 0.187 |
| 9.241 | 0.186 |
| 9.242 | 0.186 |
| 9.243 | 0.185 |
| 9.244 | 0.184 |
| 9.245 | 0.183 |
| 9.246 | 0.182 |
| 9.247 | 0.181 |
| 9.248 | 0.18 |
| 9.249 | 0.179 |
| 9.25 | 0.178 |
| 9.251 | 0.178 |
| 9.252 | 0.177 |
| 9.253 | 0.176 |
| 9.254 | 0.175 |
| 9.255 | 0.174 |
| 9.256 | 0.173 |
| 9.257 | 0.172 |
| 9.258 | 0.171 |
| 9.259 | 0.17 |
| 9.26 | 0.17 |
| 9.261 | 0.169 |
| 9.262 | 0.168 |
| 9.263 | 0.167 |
| 9.264 | 0.166 |
| 9.265 | 0.165 |
| 9.266 | 0.164 |
| 9.267 | 0.163 |
| 9.268 | 0.163 |
| 9.269 | 0.162 |
| 9.27 | 0.161 |
| 9.271 | 0.16 |
| 9.272 | 0.159 |
| 9.273 | 0.158 |
| 9.274 | 0.157 |
| 9.275 | 0.156 |
| 9.276 | 0.156 |
| 9.277 | 0.155 |
| 9.278 | 0.154 |
| 9.279 | 0.153 |
| 9.28 | 0.152 |
| 9.281 | 0.151 |
| 9.282 | 0.15 |
| 9.283 | 0.15 |
| 9.284 | 0.149 |
| 9.285 | 0.148 |
| 9.286 | 0.147 |
| 9.287 | 0.146 |
| 9.288 | 0.145 |
| 9.289 | 0.145 |
| 9.29 | 0.144 |
| 9.291 | 0.143 |
| 9.292 | 0.142 |
| 9.293 | 0.141 |
| 9.294 | 0.14 |
| 9.295 | 0.14 |
| 9.296 | 0.139 |
| 9.297 | 0.138 |
| 9.298 | 0.137 |
| 9.299 | 0.136 |
| 9.3 | 0.136 |
| 9.301 | 0.135 |
| 9.302 | 0.134 |
| 9.303 | 0.133 |
| 9.304 | 0.132 |
| 9.305 | 0.131 |
| 9.306 | 0.131 |
| 9.307 | 0.13 |
| 9.308 | 0.129 |
| 9.309 | 0.128 |
| 9.31 | 0.128 |
| 9.311 | 0.127 |
| 9.312 | 0.126 |
| 9.313 | 0.125 |
| 9.314 | 0.124 |
| 9.315 | 0.124 |
| 9.316 | 0.123 |
| 9.317 | 0.122 |
| 9.318 | 0.121 |
| 9.319 | 0.12 |
| 9.32 | 0.12 |
| 9.321 | 0.119 |
| 9.322 | 0.118 |
| 9.323 | 0.117 |
| 9.324 | 0.117 |
| 9.325 | 0.116 |
| 9.326 | 0.115 |
| 9.327 | 0.114 |
| 9.328 | 0.114 |
| 9.329 | 0.113 |
| 9.33 | 0.112 |
| 9.331 | 0.111 |
| 9.332 | 0.111 |
| 9.333 | 0.11 |
| 9.334 | 0.109 |
| 9.335 | 0.109 |
| 9.336 | 0.108 |
| 9.337 | 0.107 |
| 9.338 | 0.106 |
| 9.339 | 0.106 |
| 9.34 | 0.105 |
| 9.341 | 0.104 |
| 9.342 | 0.103 |
| 9.343 | 0.103 |
| 9.344 | 0.102 |
| 9.345 | 0.101 |
| 9.346 | 0.101 |
| 9.347 | 0.1 |
| 9.348 | 0.099 |
| 9.349 | 0.099 |
| 9.35 | 0.098 |
| 9.351 | 0.097 |
| 9.352 | 0.097 |
| 9.353 | 0.096 |
| 9.354 | 0.095 |
| 9.355 | 0.095 |
| 9.356 | 0.094 |
| 9.357 | 0.093 |
| 9.358 | 0.093 |
| 9.359 | 0.092 |
| 9.36 | 0.091 |
| 9.361 | 0.091 |
| 9.362 | 0.09 |
| 9.363 | 0.089 |
| 9.364 | 0.089 |
| 9.365 | 0.088 |
| 9.366 | 0.087 |
| 9.367 | 0.087 |
| 9.368 | 0.086 |
| 9.369 | 0.085 |
| 9.37 | 0.085 |
| 9.371 | 0.084 |
| 9.372 | 0.084 |
| 9.373 | 0.083 |
| 9.374 | 0.082 |
| 9.375 | 0.082 |
| 9.376 | 0.081 |
| 9.377 | 0.08 |
| 9.378 | 0.08 |
| 9.379 | 0.079 |
| 9.38 | 0.079 |
| 9.381 | 0.078 |
| 9.382 | 0.077 |
| 9.383 | 0.077 |
| 9.384 | 0.076 |
| 9.385 | 0.076 |
| 9.386 | 0.075 |
| 9.387 | 0.075 |
| 9.388 | 0.074 |
| 9.389 | 0.073 |
| 9.39 | 0.073 |
| 9.391 | 0.072 |
| 9.392 | 0.072 |
| 9.393 | 0.071 |
| 9.394 | 0.071 |
| 9.395 | 0.07 |
| 9.396 | 0.069 |
| 9.397 | 0.069 |
| 9.398 | 0.068 |
| 9.399 | 0.068 |
| 9.4 | 0.067 |
| 9.401 | 0.067 |
| 9.402 | 0.066 |
| 9.403 | 0.066 |
| 9.404 | 0.065 |
| 9.405 | 0.065 |
| 9.406 | 0.064 |
| 9.407 | 0.064 |
| 9.408 | 0.063 |
| 9.409 | 0.063 |
| 9.41 | 0.062 |
| 9.411 | 0.062 |
| 9.412 | 0.061 |
| 9.413 | 0.061 |
| 9.414 | 0.06 |
| 9.415 | 0.06 |
| 9.416 | 0.059 |
| 9.417 | 0.059 |
| 9.418 | 0.058 |
| 9.419 | 0.058 |
| 9.42 | 0.057 |
| 9.421 | 0.057 |
| 9.422 | 0.056 |
| 9.423 | 0.056 |
| 9.424 | 0.055 |
| 9.425 | 0.055 |
| 9.426 | 0.054 |
| 9.427 | 0.054 |
| 9.428 | 0.053 |
| 9.429 | 0.053 |
| 9.43 | 0.052 |
| 9.431 | 0.052 |
| 9.432 | 0.052 |
| 9.433 | 0.051 |
| 9.434 | 0.051 |
| 9.435 | 0.05 |
| 9.436 | 0.05 |
| 9.437 | 0.049 |
| 9.438 | 0.049 |
| 9.439 | 0.049 |
| 9.44 | 0.048 |
| 9.441 | 0.048 |
| 9.442 | 0.047 |
| 9.443 | 0.047 |
| 9.444 | 0.046 |
| 9.445 | 0.046 |
| 9.446 | 0.046 |
| 9.447 | 0.045 |
| 9.448 | 0.045 |
| 9.449 | 0.044 |
| 9.45 | 0.044 |
| 9.451 | 0.044 |
| 9.452 | 0.043 |
| 9.453 | 0.043 |
| 9.454 | 0.042 |
| 9.455 | 0.042 |
| 9.456 | 0.042 |
| 9.457 | 0.041 |
| 9.458 | 0.041 |
| 9.459 | 0.041 |
| 9.46 | 0.04 |
| 9.461 | 0.04 |
| 9.462 | 0.039 |
| 9.463 | 0.039 |
| 9.464 | 0.039 |
| 9.465 | 0.038 |
| 9.466 | 0.038 |
| 9.467 | 0.038 |
| 9.468 | 0.037 |
| 9.469 | 0.037 |
| 9.47 | 0.037 |
| 9.471 | 0.036 |
| 9.472 | 0.036 |
| 9.473 | 0.036 |
| 9.474 | 0.035 |
| 9.475 | 0.035 |
| 9.476 | 0.035 |
| 9.477 | 0.034 |
| 9.478 | 0.034 |
| 9.479 | 0.034 |
| 9.48 | 0.033 |
| 9.481 | 0.033 |
| 9.482 | 0.033 |
| 9.483 | 0.032 |
| 9.484 | 0.032 |
| 9.485 | 0.032 |
| 9.486 | 0.031 |
| 9.487 | 0.031 |
| 9.488 | 0.031 |
| 9.489 | 0.031 |
| 9.49 | 0.03 |
| 9.491 | 0.03 |
| 9.492 | 0.03 |
| 9.493 | 0.029 |
| 9.494 | 0.029 |
| 9.495 | 0.029 |
| 9.496 | 0.028 |
| 9.497 | 0.028 |
| 9.498 | 0.028 |
| 9.499 | 0.028 |
| 9.5 | 0.027 |
| 9.501 | 0.027 |
| 9.502 | 0.027 |
| 9.503 | 0.027 |
| 9.504 | 0.026 |
| 9.505 | 0.026 |
| 9.506 | 0.026 |
| 9.507 | 0.025 |
| 9.508 | 0.025 |
| 9.509 | 0.025 |
| 9.51 | 0.025 |
| 9.511 | 0.024 |
| 9.512 | 0.024 |
| 9.513 | 0.024 |
| 9.514 | 0.024 |
| 9.515 | 0.023 |
| 9.516 | 0.023 |
| 9.517 | 0.023 |
| 9.518 | 0.023 |
| 9.519 | 0.023 |
| 9.52 | 0.022 |
| 9.521 | 0.022 |
| 9.522 | 0.022 |
| 9.523 | 0.022 |
| 9.524 | 0.021 |
| 9.525 | 0.021 |
| 9.526 | 0.021 |
| 9.527 | 0.021 |
| 9.528 | 0.021 |
| 9.529 | 0.02 |
| 9.53 | 0.02 |
| 9.531 | 0.02 |
| 9.532 | 0.02 |
| 9.533 | 0.019 |
| 9.534 | 0.019 |
| 9.535 | 0.019 |
| 9.536 | 0.019 |
| 9.537 | 0.019 |
| 9.538 | 0.018 |
| 9.539 | 0.018 |
| 9.54 | 0.018 |
| 9.541 | 0.018 |
| 9.542 | 0.018 |
| 9.543 | 0.017 |
| 9.544 | 0.017 |
| 9.545 | 0.017 |
| 9.546 | 0.017 |
| 9.547 | 0.017 |
| 9.548 | 0.017 |
| 9.549 | 0.016 |
| 9.55 | 0.016 |
| 9.551 | 0.016 |
| 9.552 | 0.016 |
| 9.553 | 0.016 |
| 9.554 | 0.015 |
| 9.555 | 0.015 |
| 9.556 | 0.015 |
| 9.557 | 0.015 |
| 9.558 | 0.015 |
| 9.559 | 0.015 |
| 9.56 | 0.014 |
| 9.561 | 0.014 |
| 9.562 | 0.014 |
| 9.563 | 0.014 |
| 9.564 | 0.014 |
| 9.565 | 0.014 |
| 9.566 | 0.014 |
| 9.567 | 0.013 |
| 9.568 | 0.013 |
| 9.569 | 0.013 |
| 9.57 | 0.013 |
| 9.571 | 0.013 |
| 9.572 | 0.013 |
| 9.573 | 0.013 |
| 9.574 | 0.012 |
| 9.575 | 0.012 |
| 9.576 | 0.012 |
| 9.577 | 0.012 |
| 9.578 | 0.012 |
| 9.579 | 0.012 |
| 9.58 | 0.012 |
| 9.581 | 0.011 |
| 9.582 | 0.011 |
| 9.583 | 0.011 |
| 9.584 | 0.011 |
| 9.585 | 0.011 |
| 9.586 | 0.011 |
| 9.587 | 0.011 |
| 9.588 | 0.011 |
| 9.589 | 0.01 |
| 9.59 | 0.01 |
| 9.591 | 0.01 |
| 9.592 | 0.01 |
| 9.593 | 0.01 |
| 9.594 | 0.01 |
| 9.595 | 0.01 |
| 9.596 | 0.01 |
| 9.597 | 0.009 |
| 9.598 | 0.009 |
| 9.599 | 0.009 |
| 9.6 | 0.009 |
| 9.601 | 0.009 |
| 9.602 | 0.009 |
| 9.603 | 0.009 |
| 9.604 | 0.009 |
| 9.605 | 0.009 |
| 9.606 | 0.008 |
| 9.607 | 0.008 |
| 9.608 | 0.008 |
| 9.609 | 0.008 |
| 9.61 | 0.008 |
| 9.611 | 0.008 |
| 9.612 | 0.008 |
| 9.613 | 0.008 |
| 9.614 | 0.008 |
| 9.615 | 0.008 |
| 9.616 | 0.007 |
| 9.617 | 0.007 |
| 9.618 | 0.007 |
| 9.619 | 0.007 |
| 9.62 | 0.007 |
| 9.621 | 0.007 |
| 9.622 | 0.007 |
| 9.623 | 0.007 |
| 9.624 | 0.007 |
| 9.625 | 0.007 |
| 9.626 | 0.007 |
| 9.627 | 0.007 |
| 9.628 | 0.006 |
| 9.629 | 0.006 |
| 9.63 | 0.006 |
| 9.631 | 0.006 |
| 9.632 | 0.006 |
| 9.633 | 0.006 |
| 9.634 | 0.006 |
| 9.635 | 0.006 |
| 9.636 | 0.006 |
| 9.637 | 0.006 |
| 9.638 | 0.006 |
| 9.639 | 0.006 |
| 9.64 | 0.006 |
| 9.641 | 0.005 |
| 9.642 | 0.005 |
| 9.643 | 0.005 |
| 9.644 | 0.005 |
| 9.645 | 0.005 |
| 9.646 | 0.005 |
| 9.647 | 0.005 |
| 9.648 | 0.005 |
| 9.649 | 0.005 |
| 9.65 | 0.005 |
| 9.651 | 0.005 |
| 9.652 | 0.005 |
| 9.653 | 0.005 |
| 9.654 | 0.005 |
| 9.655 | 0.005 |
| 9.656 | 0.005 |
| 9.657 | 0.004 |
| 9.658 | 0.004 |
| 9.659 | 0.004 |
| 9.66 | 0.004 |
| 9.661 | 0.004 |
| 9.662 | 0.004 |
| 9.663 | 0.004 |
| 9.664 | 0.004 |
| 9.665 | 0.004 |
| 9.666 | 0.004 |
| 9.667 | 0.004 |
| 9.668 | 0.004 |
| 9.669 | 0.004 |
| 9.67 | 0.004 |
| 9.671 | 0.004 |
| 9.672 | 0.004 |
| 9.673 | 0.004 |
| 9.674 | 0.004 |
| 9.675 | 0.004 |
| 9.676 | 0.003 |
| 9.677 | 0.003 |
| 9.678 | 0.003 |
| 9.679 | 0.003 |
| 9.68 | 0.003 |
| 9.681 | 0.003 |
| 9.682 | 0.003 |
| 9.683 | 0.003 |
| 9.684 | 0.003 |
| 9.685 | 0.003 |
| 9.686 | 0.003 |
| 9.687 | 0.003 |
| 9.688 | 0.003 |
| 9.689 | 0.003 |
| 9.69 | 0.003 |
| 9.691 | 0.003 |
| 9.692 | 0.003 |
| 9.693 | 0.003 |
| 9.694 | 0.003 |
| 9.695 | 0.003 |
| 9.696 | 0.003 |
| 9.697 | 0.003 |
| 9.698 | 0.003 |
| 9.699 | 0.003 |
| 9.7 | 0.002 |
| 9.701 | 0.002 |
| 9.702 | 0.002 |
| 9.703 | 0.002 |
| 9.704 | 0.002 |
| 9.705 | 0.002 |
| 9.706 | 0.002 |
| 9.707 | 0.002 |
| 9.708 | 0.002 |
| 9.709 | 0.002 |
| 9.71 | 0.002 |
| 9.711 | 0.002 |
| 9.712 | 0.002 |
| 9.713 | 0.002 |
| 9.714 | 0.002 |
| 9.715 | 0.002 |
| 9.716 | 0.002 |
| 9.717 | 0.002 |
| 9.718 | 0.002 |
| 9.719 | 0.002 |
| 9.72 | 0.002 |
| 9.721 | 0.002 |
| 9.722 | 0.002 |
| 9.723 | 0.002 |
| 9.724 | 0.002 |
| 9.725 | 0.002 |
| 9.726 | 0.002 |
| 9.727 | 0.002 |
| 9.728 | 0.002 |
| 9.729 | 0.002 |
| 9.73 | 0.002 |
| 9.731 | 0.002 |
| 9.732 | 0.002 |
| 9.733 | 0.002 |
| 9.734 | 0.002 |
| 9.735 | 0.002 |
| 9.736 | 0.001 |
| 9.737 | 0.001 |
| 9.738 | 0.001 |
| 9.739 | 0.001 |
| 9.74 | 0.001 |
| 9.741 | 0.001 |
| 9.742 | 0.001 |
| 9.743 | 0.001 |
| 9.744 | 0.001 |
| 9.745 | 0.001 |
| 9.746 | 0.001 |
| 9.747 | 0.001 |
| 9.748 | 0.001 |
| 9.749 | 0.001 |
| 9.75 | 0.001 |
| 9.751 | 0.001 |
| 9.752 | 0.001 |
| 9.753 | 0.001 |
| 9.754 | 0.001 |
| 9.755 | 0.001 |
| 9.756 | 0.001 |
| 9.757 | 0.001 |
| 9.758 | 0.001 |
| 9.759 | 0.001 |
| 9.76 | 0.001 |
| 9.761 | 0.001 |
| 9.762 | 0.001 |
| 9.763 | 0.001 |
| 9.764 | 0.001 |
| 9.765 | 0.001 |
| 9.766 | 0.001 |
| 9.767 | 0.001 |
| 9.768 | 0.001 |
| 9.769 | 0.001 |
| 9.77 | 0.001 |
| 9.771 | 0.001 |
| 9.772 | 0.001 |
| 9.773 | 0.001 |
| 9.774 | 0.001 |
| 9.775 | 0.001 |
| 9.776 | 0.001 |
| 9.777 | 0.001 |
| 9.778 | 0.001 |
| 9.779 | 0.001 |
| 9.78 | 0.001 |
| 9.781 | 0.001 |
| 9.782 | 0.001 |
| 9.783 | 0.001 |
| 9.784 | 0.001 |
| 9.785 | 0.001 |
| 9.786 | 0.001 |
| 9.787 | 0.001 |
| 9.788 | 0.001 |
| 9.789 | 0.001 |
| 9.79 | 0.001 |
| 9.791 | 0.001 |
| 9.792 | 0.001 |
| 9.793 | 0.001 |
| 9.794 | 0.001 |
| 9.795 | 0.001 |
| 9.796 | 0.001 |
| 9.797 | 0.001 |
| 9.798 | 0.001 |
| 9.799 | 0.001 |
| 9.8 | 0.001 |
| 9.801 | 0.001 |
| 9.802 | 0.001 |
| 9.803 | 0.001 |
| 9.804 | 0.001 |
| 9.805 | 0.001 |
| 9.806 | 0.001 |
| 9.807 | 0 |
| 9.808 | 0 |
| 9.809 | 0 |
| 9.81 | 0 |
| 9.811 | 0 |
| 9.812 | 0 |
| 9.813 | 0 |
| 9.814 | 0 |
| 9.815 | 0 |
| 9.816 | 0 |
| 9.817 | 0 |
| 9.818 | 0 |
| 9.819 | 0 |
| 9.82 | 0 |
| 9.821 | 0 |
| 9.822 | 0 |
| 9.823 | 0 |
| 9.824 | 0 |
| 9.825 | 0 |
| 9.826 | 0 |
| 9.827 | 0 |
| 9.828 | 0 |
| 9.829 | 0 |
| 9.83 | 0 |
| 9.831 | 0 |
| 9.832 | 0 |
| 9.833 | 0 |
| 9.834 | 0 |
| 9.835 | 0 |
| 9.836 | 0 |
| 9.837 | 0 |
| 9.838 | 0 |
| 9.839 | 0 |
| 9.84 | 0 |
| 9.841 | 0 |
| 9.842 | 0 |
| 9.843 | 0 |
| 9.844 | 0 |
| 9.845 | 0 |
| 9.846 | 0 |
| 9.847 | 0 |
| 9.848 | 0 |
| 9.849 | 0 |
| 9.85 | 0 |
| 9.851 | 0 |
| 9.852 | 0 |
| 9.853 | 0 |
| 9.854 | 0 |
| 9.855 | 0 |
| 9.856 | 0 |
| 9.857 | 0 |
| 9.858 | 0 |
| 9.859 | 0 |
| 9.86 | 0 |
| 9.861 | 0 |
| 9.862 | 0 |
| 9.863 | 0 |
| 9.864 | 0 |
| 9.865 | 0 |
| 9.866 | 0 |
| 9.867 | 0 |
| 9.868 | 0 |
| 9.869 | 0 |
| 9.87 | 0 |
| 9.871 | 0 |
| 9.872 | 0 |
| 9.873 | 0 |
| 9.874 | 0 |
| 9.875 | 0 |
| 9.876 | 0 |
| 9.877 | 0 |
| 9.878 | 0 |
| 9.879 | 0 |
| 9.88 | 0 |
| 9.881 | 0 |
| 9.882 | 0 |
| 9.883 | 0 |
| 9.884 | 0 |
| 9.885 | 0 |
| 9.886 | 0 |
| 9.887 | 0 |
| 9.888 | 0 |
| 9.889 | 0 |
| 9.89 | 0 |
| 9.891 | 0 |
| 9.892 | 0 |
| 9.893 | 0 |
| 9.894 | 0 |
| 9.895 | 0 |
| 9.896 | 0 |
| 9.897 | 0 |
| 9.898 | 0 |
| 9.899 | 0 |
| 9.9 | 0 |
| 9.901 | 0 |
| 9.902 | 0 |
| 9.903 | 0 |
| 9.904 | 0 |
| 9.905 | 0 |
| 9.906 | 0 |
| 9.907 | 0 |
| 9.908 | 0 |
| 9.909 | 0 |
| 9.91 | 0 |
| 9.911 | 0 |
| 9.912 | 0 |
| 9.913 | 0 |
| 9.914 | 0 |
| 9.915 | 0 |
| 9.916 | 0 |
| 9.917 | 0 |
| 9.918 | 0 |
| 9.919 | 0 |
| 9.92 | 0 |
| 9.921 | 0 |
| 9.922 | 0 |
| 9.923 | 0 |
| 9.924 | 0 |
| 9.925 | 0 |
| 9.926 | 0 |
| 9.927 | 0 |
| 9.928 | 0 |
| 9.929 | 0 |
| 9.93 | 0 |
| 9.931 | 0 |
| 9.932 | 0 |
| 9.933 | 0 |
| 9.934 | 0 |
| 9.935 | 0 |
| 9.936 | 0 |
| 9.937 | 0 |
| 9.938 | 0 |
| 9.939 | 0 |
| 9.94 | 0 |
| 9.941 | 0 |
| 9.942 | 0 |
| 9.943 | 0 |
| 9.944 | 0 |
| 9.945 | 0 |
| 9.946 | 0 |
| 9.947 | 0 |
| 9.948 | 0 |
| 9.949 | 0 |
| 9.95 | 0 |
| 9.951 | 0 |
| 9.952 | 0 |
| 9.953 | 0 |
| 9.954 | 0 |
| 9.955 | 0 |
| 9.956 | 0 |
| 9.957 | 0 |
| 9.958 | 0 |
| 9.959 | 0 |
| 9.96 | 0 |
| 9.961 | 0 |
| 9.962 | 0 |
| 9.963 | 0 |
| 9.964 | 0 |
| 9.965 | 0 |
| 9.966 | 0 |
| 9.967 | 0 |
| 9.968 | 0 |
| 9.969 | 0 |
| 9.97 | 0 |
| 9.971 | 0 |
| 9.972 | 0 |
| 9.973 | 0 |
| 9.974 | 0 |
| 9.975 | 0 |
| 9.976 | 0 |
| 9.977 | 0 |
| 9.978 | 0 |
| 9.979 | 0 |
| 9.98 | 0 |
| 9.981 | 0 |
| 9.982 | 0 |
| 9.983 | 0 |
| 9.984 | 0 |
| 9.985 | 0 |
| 9.986 | 0 |
| 9.987 | 0 |
| 9.988 | 0 |
| 9.989 | 0 |
| 9.99 | 0 |
| 9.991 | 0 |
| 9.992 | 0 |
| 9.993 | 0 |
| 9.994 | 0 |
| 9.995 | 0 |
| 9.996 | 0 |
| 9.997 | 0 |
| 9.998 | 0 |
| 9.999 | 0 |
| 10.0 | 0 |